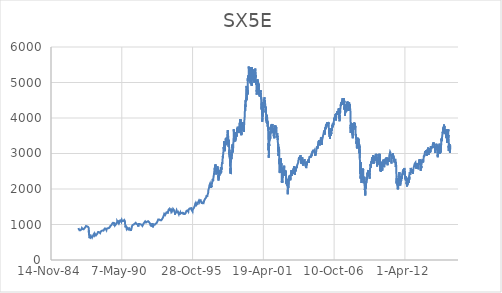
| Category | SX5E |
|---|---|
| 31777.0 | 900.82 |
| 31778.0 | 900.82 |
| 31779.0 | 891.78 |
| 31782.0 | 898.33 |
| 31783.0 | 902.32 |
| 31784.0 | 899.15 |
| 31785.0 | 887.37 |
| 31786.0 | 868.31 |
| 31789.0 | 879.41 |
| 31790.0 | 872.74 |
| 31791.0 | 876.39 |
| 31792.0 | 884.37 |
| 31793.0 | 883.78 |
| 31796.0 | 876.15 |
| 31797.0 | 875.1 |
| 31798.0 | 872.47 |
| 31799.0 | 876.69 |
| 31800.0 | 883.62 |
| 31803.0 | 870.96 |
| 31804.0 | 868.19 |
| 31805.0 | 838.6 |
| 31806.0 | 847.38 |
| 31807.0 | 859.08 |
| 31810.0 | 849.03 |
| 31811.0 | 839.6 |
| 31812.0 | 838.53 |
| 31813.0 | 833.03 |
| 31814.0 | 842.23 |
| 31817.0 | 844.73 |
| 31818.0 | 837.91 |
| 31819.0 | 837.56 |
| 31820.0 | 840.53 |
| 31821.0 | 841.54 |
| 31824.0 | 844.11 |
| 31825.0 | 833.81 |
| 31826.0 | 834.15 |
| 31827.0 | 844.07 |
| 31828.0 | 845.11 |
| 31831.0 | 839.36 |
| 31832.0 | 837.9 |
| 31833.0 | 833.39 |
| 31834.0 | 838.23 |
| 31835.0 | 840.97 |
| 31838.0 | 842.7 |
| 31839.0 | 836.22 |
| 31840.0 | 848.78 |
| 31841.0 | 855.04 |
| 31842.0 | 854.82 |
| 31845.0 | 856.93 |
| 31846.0 | 850.99 |
| 31847.0 | 844.78 |
| 31848.0 | 851.62 |
| 31849.0 | 855 |
| 31852.0 | 855.21 |
| 31853.0 | 848.47 |
| 31854.0 | 854.69 |
| 31855.0 | 842.48 |
| 31856.0 | 848.13 |
| 31859.0 | 860.44 |
| 31860.0 | 866.76 |
| 31861.0 | 868.3 |
| 31862.0 | 874.75 |
| 31863.0 | 882.89 |
| 31866.0 | 877.3 |
| 31867.0 | 869.44 |
| 31868.0 | 883.95 |
| 31869.0 | 888.39 |
| 31870.0 | 888.97 |
| 31873.0 | 900.79 |
| 31874.0 | 896.33 |
| 31875.0 | 895.42 |
| 31876.0 | 895.62 |
| 31877.0 | 884.61 |
| 31880.0 | 875.19 |
| 31881.0 | 881 |
| 31882.0 | 888.71 |
| 31883.0 | 895.48 |
| 31884.0 | 896.06 |
| 31887.0 | 893.33 |
| 31888.0 | 889.55 |
| 31889.0 | 900.5 |
| 31890.0 | 896.53 |
| 31891.0 | 890.62 |
| 31894.0 | 871.69 |
| 31895.0 | 879.07 |
| 31896.0 | 884.37 |
| 31897.0 | 881.46 |
| 31898.0 | 883.32 |
| 31901.0 | 880.31 |
| 31902.0 | 875.43 |
| 31903.0 | 880.91 |
| 31904.0 | 882.84 |
| 31905.0 | 882.7 |
| 31908.0 | 887.34 |
| 31909.0 | 879.78 |
| 31910.0 | 882.77 |
| 31911.0 | 883.11 |
| 31912.0 | 866.11 |
| 31915.0 | 868.85 |
| 31916.0 | 865.65 |
| 31917.0 | 856.08 |
| 31918.0 | 854.02 |
| 31919.0 | 857.63 |
| 31922.0 | 856.95 |
| 31923.0 | 864.83 |
| 31924.0 | 869.49 |
| 31925.0 | 869.29 |
| 31926.0 | 866.41 |
| 31929.0 | 872.52 |
| 31930.0 | 863.11 |
| 31931.0 | 864.57 |
| 31932.0 | 869.42 |
| 31933.0 | 864.75 |
| 31936.0 | 866.08 |
| 31937.0 | 863.17 |
| 31938.0 | 860.8 |
| 31939.0 | 868.26 |
| 31940.0 | 869.28 |
| 31943.0 | 879.82 |
| 31944.0 | 885.41 |
| 31945.0 | 885.93 |
| 31946.0 | 885.19 |
| 31947.0 | 897.16 |
| 31950.0 | 908.73 |
| 31951.0 | 915.58 |
| 31952.0 | 901.6 |
| 31953.0 | 903.66 |
| 31954.0 | 909.42 |
| 31957.0 | 909.76 |
| 31958.0 | 905.3 |
| 31959.0 | 894.32 |
| 31960.0 | 904.15 |
| 31961.0 | 917.81 |
| 31964.0 | 918.19 |
| 31965.0 | 917.15 |
| 31966.0 | 923.2 |
| 31967.0 | 920.76 |
| 31968.0 | 921.82 |
| 31971.0 | 921.73 |
| 31972.0 | 925.93 |
| 31973.0 | 928.92 |
| 31974.0 | 932.15 |
| 31975.0 | 941.03 |
| 31978.0 | 945.38 |
| 31979.0 | 941.54 |
| 31980.0 | 937.13 |
| 31981.0 | 932.12 |
| 31982.0 | 933.19 |
| 31985.0 | 936.9 |
| 31986.0 | 941.84 |
| 31987.0 | 949.38 |
| 31988.0 | 957.8 |
| 31989.0 | 955.83 |
| 31992.0 | 959.68 |
| 31993.0 | 957.2 |
| 31994.0 | 955.55 |
| 31995.0 | 961.22 |
| 31996.0 | 963.12 |
| 31999.0 | 962.46 |
| 32000.0 | 952.68 |
| 32001.0 | 961.8 |
| 32002.0 | 959.8 |
| 32003.0 | 961.79 |
| 32006.0 | 959.11 |
| 32007.0 | 949.25 |
| 32008.0 | 940.09 |
| 32009.0 | 949.22 |
| 32010.0 | 950.03 |
| 32013.0 | 941.89 |
| 32014.0 | 941.91 |
| 32015.0 | 942.2 |
| 32016.0 | 943.3 |
| 32017.0 | 947.55 |
| 32020.0 | 951.06 |
| 32021.0 | 953.63 |
| 32022.0 | 947.24 |
| 32023.0 | 939.54 |
| 32024.0 | 930.39 |
| 32027.0 | 919.53 |
| 32028.0 | 919.47 |
| 32029.0 | 919.76 |
| 32030.0 | 928.08 |
| 32031.0 | 933.42 |
| 32034.0 | 940.81 |
| 32035.0 | 936.45 |
| 32036.0 | 930.91 |
| 32037.0 | 934.09 |
| 32038.0 | 928.5 |
| 32041.0 | 927.1 |
| 32042.0 | 922.49 |
| 32043.0 | 937.85 |
| 32044.0 | 931.48 |
| 32045.0 | 928.34 |
| 32048.0 | 934 |
| 32049.0 | 936.2 |
| 32050.0 | 930.71 |
| 32051.0 | 938.2 |
| 32052.0 | 944.2 |
| 32055.0 | 949.42 |
| 32056.0 | 945.26 |
| 32057.0 | 935.79 |
| 32058.0 | 940.33 |
| 32059.0 | 926.63 |
| 32062.0 | 919.64 |
| 32063.0 | 921.87 |
| 32064.0 | 916.83 |
| 32065.0 | 901.83 |
| 32066.0 | 894.23 |
| 32069.0 | 823.32 |
| 32070.0 | 783.33 |
| 32071.0 | 831.37 |
| 32072.0 | 799.94 |
| 32073.0 | 788.59 |
| 32076.0 | 734.34 |
| 32077.0 | 741.49 |
| 32078.0 | 701.32 |
| 32079.0 | 691.31 |
| 32080.0 | 730.75 |
| 32083.0 | 725.43 |
| 32084.0 | 712.87 |
| 32085.0 | 689.49 |
| 32086.0 | 682.12 |
| 32087.0 | 683.04 |
| 32090.0 | 654.09 |
| 32091.0 | 615.9 |
| 32092.0 | 632.36 |
| 32093.0 | 676.32 |
| 32094.0 | 674.57 |
| 32097.0 | 694.95 |
| 32098.0 | 678.12 |
| 32099.0 | 676.37 |
| 32100.0 | 669.38 |
| 32101.0 | 653.27 |
| 32104.0 | 658.18 |
| 32105.0 | 676.14 |
| 32106.0 | 675.26 |
| 32107.0 | 671.13 |
| 32108.0 | 675.21 |
| 32111.0 | 658.03 |
| 32112.0 | 654.9 |
| 32113.0 | 655.07 |
| 32114.0 | 650.92 |
| 32115.0 | 635.83 |
| 32118.0 | 634.13 |
| 32119.0 | 638.18 |
| 32120.0 | 640.49 |
| 32121.0 | 641.11 |
| 32122.0 | 636.25 |
| 32125.0 | 639.67 |
| 32126.0 | 648.78 |
| 32127.0 | 661.4 |
| 32128.0 | 663.47 |
| 32129.0 | 658.56 |
| 32132.0 | 665.5 |
| 32133.0 | 667.53 |
| 32134.0 | 672.74 |
| 32135.0 | 671.57 |
| 32136.0 | 671.57 |
| 32139.0 | 663.68 |
| 32140.0 | 651.88 |
| 32141.0 | 656.14 |
| 32142.0 | 648.13 |
| 32143.0 | 648.32 |
| 32146.0 | 633.3 |
| 32147.0 | 658.48 |
| 32148.0 | 665.43 |
| 32149.0 | 669.13 |
| 32150.0 | 674.72 |
| 32153.0 | 650.12 |
| 32154.0 | 649.16 |
| 32155.0 | 639.19 |
| 32156.0 | 642.68 |
| 32157.0 | 645.79 |
| 32160.0 | 661.85 |
| 32161.0 | 648.62 |
| 32162.0 | 638.35 |
| 32163.0 | 633.54 |
| 32164.0 | 635.91 |
| 32167.0 | 636.19 |
| 32168.0 | 640.18 |
| 32169.0 | 637.47 |
| 32170.0 | 633.5 |
| 32171.0 | 635.95 |
| 32174.0 | 639.49 |
| 32175.0 | 638.99 |
| 32176.0 | 644.82 |
| 32177.0 | 653.51 |
| 32178.0 | 655.59 |
| 32181.0 | 660.39 |
| 32182.0 | 652.07 |
| 32183.0 | 658.26 |
| 32184.0 | 673 |
| 32185.0 | 678.61 |
| 32188.0 | 686.68 |
| 32189.0 | 688.36 |
| 32190.0 | 696.79 |
| 32191.0 | 697.01 |
| 32192.0 | 695.96 |
| 32195.0 | 702.05 |
| 32196.0 | 704.53 |
| 32197.0 | 707.13 |
| 32198.0 | 712.17 |
| 32199.0 | 705.06 |
| 32202.0 | 708.88 |
| 32203.0 | 715.83 |
| 32204.0 | 717.62 |
| 32205.0 | 716.51 |
| 32206.0 | 711.09 |
| 32209.0 | 700.57 |
| 32210.0 | 709.99 |
| 32211.0 | 713.48 |
| 32212.0 | 719.48 |
| 32213.0 | 713.28 |
| 32216.0 | 714.18 |
| 32217.0 | 714.82 |
| 32218.0 | 721.6 |
| 32219.0 | 706.85 |
| 32220.0 | 743.45 |
| 32223.0 | 740.41 |
| 32224.0 | 729.93 |
| 32225.0 | 731.4 |
| 32226.0 | 729.04 |
| 32227.0 | 719.87 |
| 32230.0 | 700.5 |
| 32231.0 | 706.16 |
| 32232.0 | 706.39 |
| 32233.0 | 701.56 |
| 32234.0 | 701.37 |
| 32237.0 | 699.45 |
| 32238.0 | 696.84 |
| 32239.0 | 707.35 |
| 32240.0 | 712.88 |
| 32241.0 | 712.36 |
| 32244.0 | 723.06 |
| 32245.0 | 728.31 |
| 32246.0 | 731.26 |
| 32247.0 | 725.77 |
| 32248.0 | 712.42 |
| 32251.0 | 711.6 |
| 32252.0 | 716.63 |
| 32253.0 | 711.86 |
| 32254.0 | 708.23 |
| 32255.0 | 711.58 |
| 32258.0 | 714.45 |
| 32259.0 | 716.27 |
| 32260.0 | 714.72 |
| 32261.0 | 717.48 |
| 32262.0 | 710.55 |
| 32265.0 | 709.88 |
| 32266.0 | 705.58 |
| 32267.0 | 710.63 |
| 32268.0 | 708.49 |
| 32269.0 | 707.04 |
| 32272.0 | 694.64 |
| 32273.0 | 691.69 |
| 32274.0 | 682.6 |
| 32275.0 | 680.1 |
| 32276.0 | 678.99 |
| 32279.0 | 693.32 |
| 32280.0 | 699.73 |
| 32281.0 | 697.68 |
| 32282.0 | 686.38 |
| 32283.0 | 691 |
| 32286.0 | 688.63 |
| 32287.0 | 689.83 |
| 32288.0 | 698.42 |
| 32289.0 | 697.56 |
| 32290.0 | 696.04 |
| 32293.0 | 702.31 |
| 32294.0 | 711.12 |
| 32295.0 | 724.44 |
| 32296.0 | 742.44 |
| 32297.0 | 732.45 |
| 32300.0 | 736.99 |
| 32301.0 | 733.47 |
| 32302.0 | 736.43 |
| 32303.0 | 749.58 |
| 32304.0 | 749.26 |
| 32307.0 | 746.51 |
| 32308.0 | 750.26 |
| 32309.0 | 752.49 |
| 32310.0 | 745.17 |
| 32311.0 | 747.38 |
| 32314.0 | 745.56 |
| 32315.0 | 748.29 |
| 32316.0 | 754.23 |
| 32317.0 | 759.34 |
| 32318.0 | 763.67 |
| 32321.0 | 762.99 |
| 32322.0 | 756.75 |
| 32323.0 | 760.82 |
| 32324.0 | 760.54 |
| 32325.0 | 769.63 |
| 32328.0 | 771.49 |
| 32329.0 | 775.35 |
| 32330.0 | 787.97 |
| 32331.0 | 783.36 |
| 32332.0 | 783.07 |
| 32335.0 | 780.72 |
| 32336.0 | 771.99 |
| 32337.0 | 766.99 |
| 32338.0 | 770.82 |
| 32339.0 | 774.77 |
| 32342.0 | 772.11 |
| 32343.0 | 767.36 |
| 32344.0 | 771.81 |
| 32345.0 | 772.11 |
| 32346.0 | 765.79 |
| 32349.0 | 765.03 |
| 32350.0 | 772.58 |
| 32351.0 | 775.46 |
| 32352.0 | 771.12 |
| 32353.0 | 780.03 |
| 32356.0 | 786.65 |
| 32357.0 | 786.91 |
| 32358.0 | 785.35 |
| 32359.0 | 784.49 |
| 32360.0 | 790.72 |
| 32363.0 | 786.05 |
| 32364.0 | 788.65 |
| 32365.0 | 774.91 |
| 32366.0 | 766.11 |
| 32367.0 | 773.27 |
| 32370.0 | 770.05 |
| 32371.0 | 766.83 |
| 32372.0 | 775.41 |
| 32373.0 | 777.71 |
| 32374.0 | 774.53 |
| 32377.0 | 773.6 |
| 32378.0 | 767.15 |
| 32379.0 | 769.97 |
| 32380.0 | 762.04 |
| 32381.0 | 760.86 |
| 32384.0 | 757.41 |
| 32385.0 | 759.76 |
| 32386.0 | 761.63 |
| 32387.0 | 757.92 |
| 32388.0 | 755.5 |
| 32391.0 | 762.97 |
| 32392.0 | 764.79 |
| 32393.0 | 767.95 |
| 32394.0 | 773.44 |
| 32395.0 | 768.47 |
| 32398.0 | 776.16 |
| 32399.0 | 779.82 |
| 32400.0 | 789.7 |
| 32401.0 | 794.24 |
| 32402.0 | 793.88 |
| 32405.0 | 798.4 |
| 32406.0 | 797.96 |
| 32407.0 | 803.58 |
| 32408.0 | 805.49 |
| 32409.0 | 802.23 |
| 32412.0 | 805.86 |
| 32413.0 | 802.73 |
| 32414.0 | 801.46 |
| 32415.0 | 807.99 |
| 32416.0 | 809.03 |
| 32419.0 | 809.23 |
| 32420.0 | 812.2 |
| 32421.0 | 814.6 |
| 32422.0 | 816.7 |
| 32423.0 | 818.72 |
| 32426.0 | 823.99 |
| 32427.0 | 817.84 |
| 32428.0 | 812.66 |
| 32429.0 | 819.84 |
| 32430.0 | 823.39 |
| 32433.0 | 825.53 |
| 32434.0 | 833.38 |
| 32435.0 | 837.6 |
| 32436.0 | 832.5 |
| 32437.0 | 832.21 |
| 32440.0 | 831.32 |
| 32441.0 | 832.41 |
| 32442.0 | 846.5 |
| 32443.0 | 836.33 |
| 32444.0 | 841.45 |
| 32447.0 | 837.84 |
| 32448.0 | 842.83 |
| 32449.0 | 838.65 |
| 32450.0 | 837.14 |
| 32451.0 | 838.31 |
| 32454.0 | 830.56 |
| 32455.0 | 836.86 |
| 32456.0 | 833.03 |
| 32457.0 | 830.49 |
| 32458.0 | 826.42 |
| 32461.0 | 821.69 |
| 32462.0 | 819.76 |
| 32463.0 | 822.09 |
| 32464.0 | 819.3 |
| 32465.0 | 825.01 |
| 32468.0 | 822.15 |
| 32469.0 | 822.15 |
| 32470.0 | 828.6 |
| 32471.0 | 829.94 |
| 32472.0 | 827.28 |
| 32475.0 | 822.2 |
| 32476.0 | 823.08 |
| 32477.0 | 828.32 |
| 32478.0 | 828.11 |
| 32479.0 | 825.56 |
| 32482.0 | 823.66 |
| 32483.0 | 827.01 |
| 32484.0 | 834.37 |
| 32485.0 | 833.25 |
| 32486.0 | 843.45 |
| 32489.0 | 836.02 |
| 32490.0 | 835.75 |
| 32491.0 | 832.87 |
| 32492.0 | 832.27 |
| 32493.0 | 839.18 |
| 32496.0 | 846.69 |
| 32497.0 | 854.39 |
| 32498.0 | 853.69 |
| 32499.0 | 843.38 |
| 32500.0 | 856.46 |
| 32503.0 | 856.06 |
| 32504.0 | 861.08 |
| 32505.0 | 859.15 |
| 32506.0 | 861.22 |
| 32507.0 | 861.36 |
| 32510.0 | 866.04 |
| 32511.0 | 872.11 |
| 32512.0 | 876.29 |
| 32513.0 | 883.29 |
| 32514.0 | 884.13 |
| 32517.0 | 886.05 |
| 32518.0 | 881.16 |
| 32519.0 | 881.55 |
| 32520.0 | 884.53 |
| 32521.0 | 885.25 |
| 32524.0 | 885.24 |
| 32525.0 | 881.7 |
| 32526.0 | 880.4 |
| 32527.0 | 888.68 |
| 32528.0 | 885.46 |
| 32531.0 | 880.02 |
| 32532.0 | 885.82 |
| 32533.0 | 892.57 |
| 32534.0 | 887.82 |
| 32535.0 | 891.09 |
| 32538.0 | 887.65 |
| 32539.0 | 880.79 |
| 32540.0 | 875.47 |
| 32541.0 | 878.08 |
| 32542.0 | 884.09 |
| 32545.0 | 885.49 |
| 32546.0 | 883.82 |
| 32547.0 | 891.81 |
| 32548.0 | 889.28 |
| 32549.0 | 888.1 |
| 32552.0 | 876.81 |
| 32553.0 | 878.7 |
| 32554.0 | 870.83 |
| 32555.0 | 872.89 |
| 32556.0 | 869.54 |
| 32559.0 | 876.73 |
| 32560.0 | 874.7 |
| 32561.0 | 867.41 |
| 32562.0 | 856.7 |
| 32563.0 | 864.05 |
| 32566.0 | 845.09 |
| 32567.0 | 852.86 |
| 32568.0 | 859.83 |
| 32569.0 | 860.68 |
| 32570.0 | 871.1 |
| 32573.0 | 879.28 |
| 32574.0 | 878.31 |
| 32575.0 | 872.83 |
| 32576.0 | 873.66 |
| 32577.0 | 870.96 |
| 32580.0 | 872.52 |
| 32581.0 | 876.31 |
| 32582.0 | 881.84 |
| 32583.0 | 882.9 |
| 32584.0 | 879.88 |
| 32587.0 | 853.38 |
| 32588.0 | 874.93 |
| 32589.0 | 874.77 |
| 32590.0 | 875.44 |
| 32591.0 | 875.9 |
| 32594.0 | 873.69 |
| 32595.0 | 875.62 |
| 32596.0 | 880.18 |
| 32597.0 | 882 |
| 32598.0 | 883.82 |
| 32601.0 | 891.11 |
| 32602.0 | 892.13 |
| 32603.0 | 893.29 |
| 32604.0 | 889.88 |
| 32605.0 | 891.2 |
| 32608.0 | 895.58 |
| 32609.0 | 899.74 |
| 32610.0 | 902.61 |
| 32611.0 | 902.29 |
| 32612.0 | 904.91 |
| 32615.0 | 909.4 |
| 32616.0 | 911.73 |
| 32617.0 | 911.97 |
| 32618.0 | 908.91 |
| 32619.0 | 908.9 |
| 32622.0 | 909.26 |
| 32623.0 | 904.67 |
| 32624.0 | 901.26 |
| 32625.0 | 901.96 |
| 32626.0 | 901.71 |
| 32629.0 | 900.64 |
| 32630.0 | 899.12 |
| 32631.0 | 897.81 |
| 32632.0 | 896.8 |
| 32633.0 | 904.73 |
| 32636.0 | 900.19 |
| 32637.0 | 898.8 |
| 32638.0 | 896.6 |
| 32639.0 | 893.82 |
| 32640.0 | 892.69 |
| 32643.0 | 891.69 |
| 32644.0 | 891.42 |
| 32645.0 | 890.49 |
| 32646.0 | 896.03 |
| 32647.0 | 898.16 |
| 32650.0 | 902.16 |
| 32651.0 | 904.47 |
| 32652.0 | 905.75 |
| 32653.0 | 913.38 |
| 32654.0 | 914.44 |
| 32657.0 | 920.33 |
| 32658.0 | 923.35 |
| 32659.0 | 923.42 |
| 32660.0 | 924.65 |
| 32661.0 | 926.05 |
| 32664.0 | 930.43 |
| 32665.0 | 929.08 |
| 32666.0 | 934.15 |
| 32667.0 | 939.58 |
| 32668.0 | 940.86 |
| 32671.0 | 944.7 |
| 32672.0 | 944.87 |
| 32673.0 | 947.36 |
| 32674.0 | 942.49 |
| 32675.0 | 942.76 |
| 32678.0 | 948.98 |
| 32679.0 | 958.23 |
| 32680.0 | 956.75 |
| 32681.0 | 958.9 |
| 32682.0 | 958.27 |
| 32685.0 | 962.7 |
| 32686.0 | 959.94 |
| 32687.0 | 966.26 |
| 32688.0 | 963.4 |
| 32689.0 | 953.51 |
| 32692.0 | 958.48 |
| 32693.0 | 963.44 |
| 32694.0 | 955.98 |
| 32695.0 | 956.83 |
| 32696.0 | 961.77 |
| 32699.0 | 965.66 |
| 32700.0 | 971.49 |
| 32701.0 | 971.05 |
| 32702.0 | 977.72 |
| 32703.0 | 981.2 |
| 32706.0 | 979.47 |
| 32707.0 | 981.3 |
| 32708.0 | 985.74 |
| 32709.0 | 991.39 |
| 32710.0 | 993.41 |
| 32713.0 | 983.6 |
| 32714.0 | 988.98 |
| 32715.0 | 994.46 |
| 32716.0 | 997.27 |
| 32717.0 | 996.93 |
| 32720.0 | 997.91 |
| 32721.0 | 1006.38 |
| 32722.0 | 1008.28 |
| 32723.0 | 1004.65 |
| 32724.0 | 1016.58 |
| 32727.0 | 1018.24 |
| 32728.0 | 1020.41 |
| 32729.0 | 1022.62 |
| 32730.0 | 1018.51 |
| 32731.0 | 1022.34 |
| 32734.0 | 1019.54 |
| 32735.0 | 1012.02 |
| 32736.0 | 1018.81 |
| 32737.0 | 1020.37 |
| 32738.0 | 1017.81 |
| 32741.0 | 1024.69 |
| 32742.0 | 1021.3 |
| 32743.0 | 1020.27 |
| 32744.0 | 1026.17 |
| 32745.0 | 1036.91 |
| 32748.0 | 1034.95 |
| 32749.0 | 1031.44 |
| 32750.0 | 1034.36 |
| 32751.0 | 1038.1 |
| 32752.0 | 1040.88 |
| 32755.0 | 1048.98 |
| 32756.0 | 1056.54 |
| 32757.0 | 1048.36 |
| 32758.0 | 1055.11 |
| 32759.0 | 1058.95 |
| 32762.0 | 1054.81 |
| 32763.0 | 1052.11 |
| 32764.0 | 1049.45 |
| 32765.0 | 1048.53 |
| 32766.0 | 1047.16 |
| 32769.0 | 1050.93 |
| 32770.0 | 1047.17 |
| 32771.0 | 1045.66 |
| 32772.0 | 1045.93 |
| 32773.0 | 1051.84 |
| 32776.0 | 1050.59 |
| 32777.0 | 1045.46 |
| 32778.0 | 1042.05 |
| 32779.0 | 1041.53 |
| 32780.0 | 1032.57 |
| 32783.0 | 1027.48 |
| 32784.0 | 1039.75 |
| 32785.0 | 1042.4 |
| 32786.0 | 1041.49 |
| 32787.0 | 1047.81 |
| 32790.0 | 1055.47 |
| 32791.0 | 1054.76 |
| 32792.0 | 1043.02 |
| 32793.0 | 1042.72 |
| 32794.0 | 1035.84 |
| 32797.0 | 960.81 |
| 32798.0 | 981.08 |
| 32799.0 | 983.38 |
| 32800.0 | 1001.41 |
| 32801.0 | 999.85 |
| 32804.0 | 1001.27 |
| 32805.0 | 983.84 |
| 32806.0 | 973.82 |
| 32807.0 | 971.67 |
| 32808.0 | 959.03 |
| 32811.0 | 965.83 |
| 32812.0 | 970.43 |
| 32813.0 | 972.43 |
| 32814.0 | 969.91 |
| 32815.0 | 961.72 |
| 32818.0 | 958.61 |
| 32819.0 | 947.37 |
| 32820.0 | 954.83 |
| 32821.0 | 960.36 |
| 32822.0 | 970.55 |
| 32825.0 | 982.49 |
| 32826.0 | 977.94 |
| 32827.0 | 973.5 |
| 32828.0 | 985.33 |
| 32829.0 | 985.81 |
| 32832.0 | 989.62 |
| 32833.0 | 984.76 |
| 32834.0 | 990.51 |
| 32835.0 | 996.73 |
| 32836.0 | 1005.91 |
| 32839.0 | 1010 |
| 32840.0 | 1009.79 |
| 32841.0 | 1013.96 |
| 32842.0 | 1023.52 |
| 32843.0 | 1034.12 |
| 32846.0 | 1045.01 |
| 32847.0 | 1040.5 |
| 32848.0 | 1048.9 |
| 32849.0 | 1051.22 |
| 32850.0 | 1050.31 |
| 32853.0 | 1048.34 |
| 32854.0 | 1048.03 |
| 32855.0 | 1046.28 |
| 32856.0 | 1043.37 |
| 32857.0 | 1045.44 |
| 32860.0 | 1042.84 |
| 32861.0 | 1038.3 |
| 32862.0 | 1050.06 |
| 32863.0 | 1057.82 |
| 32864.0 | 1060 |
| 32867.0 | 1060 |
| 32868.0 | 1063.68 |
| 32869.0 | 1082.78 |
| 32870.0 | 1095.22 |
| 32871.0 | 1098.49 |
| 32874.0 | 1098.49 |
| 32875.0 | 1101.34 |
| 32876.0 | 1112.82 |
| 32877.0 | 1113.02 |
| 32878.0 | 1099.52 |
| 32881.0 | 1104.62 |
| 32882.0 | 1108.79 |
| 32883.0 | 1099.88 |
| 32884.0 | 1111.34 |
| 32885.0 | 1100.32 |
| 32888.0 | 1094.09 |
| 32889.0 | 1076.85 |
| 32890.0 | 1085.63 |
| 32891.0 | 1071.44 |
| 32892.0 | 1069.32 |
| 32895.0 | 1070.13 |
| 32896.0 | 1072 |
| 32897.0 | 1048.74 |
| 32898.0 | 1061.73 |
| 32899.0 | 1061.64 |
| 32902.0 | 1063.84 |
| 32903.0 | 1067.73 |
| 32904.0 | 1069.92 |
| 32905.0 | 1081.45 |
| 32906.0 | 1099.38 |
| 32909.0 | 1111.72 |
| 32910.0 | 1108.79 |
| 32911.0 | 1093.94 |
| 32912.0 | 1102.05 |
| 32913.0 | 1091.27 |
| 32916.0 | 1075.59 |
| 32917.0 | 1067 |
| 32918.0 | 1067.95 |
| 32919.0 | 1072.31 |
| 32920.0 | 1088.18 |
| 32923.0 | 1073.87 |
| 32924.0 | 1053.49 |
| 32925.0 | 1046.7 |
| 32926.0 | 1053.05 |
| 32927.0 | 1038.72 |
| 32930.0 | 1031.27 |
| 32931.0 | 1045.13 |
| 32932.0 | 1048.91 |
| 32933.0 | 1039.54 |
| 32934.0 | 1057.33 |
| 32937.0 | 1064.82 |
| 32938.0 | 1062.78 |
| 32939.0 | 1074.51 |
| 32940.0 | 1082.32 |
| 32941.0 | 1087.35 |
| 32944.0 | 1082.45 |
| 32945.0 | 1088.53 |
| 32946.0 | 1092 |
| 32947.0 | 1101.47 |
| 32948.0 | 1105.71 |
| 32951.0 | 1108.72 |
| 32952.0 | 1103.16 |
| 32953.0 | 1114.3 |
| 32954.0 | 1104.94 |
| 32955.0 | 1107.65 |
| 32958.0 | 1114.94 |
| 32959.0 | 1108.58 |
| 32960.0 | 1108.04 |
| 32961.0 | 1113.82 |
| 32962.0 | 1115.39 |
| 32965.0 | 1102.63 |
| 32966.0 | 1117.39 |
| 32967.0 | 1117.46 |
| 32968.0 | 1120.48 |
| 32969.0 | 1126.63 |
| 32972.0 | 1120.33 |
| 32973.0 | 1119.32 |
| 32974.0 | 1122.83 |
| 32975.0 | 1127.94 |
| 32976.0 | 1127.36 |
| 32979.0 | 1130.41 |
| 32980.0 | 1133.43 |
| 32981.0 | 1124.96 |
| 32982.0 | 1120.75 |
| 32983.0 | 1127.18 |
| 32986.0 | 1108.59 |
| 32987.0 | 1106.22 |
| 32988.0 | 1104.51 |
| 32989.0 | 1095.66 |
| 32990.0 | 1091.63 |
| 32993.0 | 1087.94 |
| 32994.0 | 1088.04 |
| 32995.0 | 1098.06 |
| 32996.0 | 1111.77 |
| 32997.0 | 1118.26 |
| 33000.0 | 1128.43 |
| 33001.0 | 1123.19 |
| 33002.0 | 1119.61 |
| 33003.0 | 1116 |
| 33004.0 | 1110.37 |
| 33007.0 | 1111.93 |
| 33008.0 | 1109.35 |
| 33009.0 | 1107.71 |
| 33010.0 | 1113.09 |
| 33011.0 | 1109.49 |
| 33014.0 | 1098.29 |
| 33015.0 | 1106.66 |
| 33016.0 | 1111.21 |
| 33017.0 | 1110.43 |
| 33018.0 | 1102.43 |
| 33021.0 | 1099.45 |
| 33022.0 | 1111.82 |
| 33023.0 | 1117.22 |
| 33024.0 | 1116.83 |
| 33025.0 | 1116.17 |
| 33028.0 | 1120.1 |
| 33029.0 | 1123.85 |
| 33030.0 | 1108.59 |
| 33031.0 | 1107.05 |
| 33032.0 | 1099.46 |
| 33035.0 | 1094.01 |
| 33036.0 | 1092.18 |
| 33037.0 | 1094.42 |
| 33038.0 | 1097.85 |
| 33039.0 | 1089.21 |
| 33042.0 | 1084.24 |
| 33043.0 | 1098.5 |
| 33044.0 | 1102.64 |
| 33045.0 | 1105.72 |
| 33046.0 | 1112.61 |
| 33049.0 | 1118.94 |
| 33050.0 | 1123.46 |
| 33051.0 | 1122.16 |
| 33052.0 | 1122.46 |
| 33053.0 | 1120.33 |
| 33056.0 | 1124.08 |
| 33057.0 | 1121.5 |
| 33058.0 | 1120.64 |
| 33059.0 | 1113.32 |
| 33060.0 | 1114.14 |
| 33063.0 | 1110.41 |
| 33064.0 | 1100.56 |
| 33065.0 | 1109.54 |
| 33066.0 | 1118.71 |
| 33067.0 | 1121.3 |
| 33070.0 | 1127.62 |
| 33071.0 | 1133.76 |
| 33072.0 | 1133.35 |
| 33073.0 | 1134.74 |
| 33074.0 | 1136.18 |
| 33077.0 | 1120.62 |
| 33078.0 | 1120.9 |
| 33079.0 | 1122.36 |
| 33080.0 | 1120.59 |
| 33081.0 | 1112.67 |
| 33084.0 | 1107.72 |
| 33085.0 | 1116.48 |
| 33086.0 | 1108.96 |
| 33087.0 | 1097.11 |
| 33088.0 | 1073.07 |
| 33091.0 | 1021.5 |
| 33092.0 | 1038.87 |
| 33093.0 | 1016.7 |
| 33094.0 | 1023.96 |
| 33095.0 | 1021.27 |
| 33098.0 | 996.97 |
| 33099.0 | 1003.6 |
| 33100.0 | 1001.34 |
| 33101.0 | 1007.38 |
| 33102.0 | 976.71 |
| 33105.0 | 952.64 |
| 33106.0 | 920.64 |
| 33107.0 | 930.22 |
| 33108.0 | 903.54 |
| 33109.0 | 919.56 |
| 33112.0 | 964.12 |
| 33113.0 | 955.84 |
| 33114.0 | 962.32 |
| 33115.0 | 969.57 |
| 33116.0 | 962.15 |
| 33119.0 | 958.14 |
| 33120.0 | 940.34 |
| 33121.0 | 940.26 |
| 33122.0 | 935.87 |
| 33123.0 | 937.84 |
| 33126.0 | 956.25 |
| 33127.0 | 947.76 |
| 33128.0 | 954.82 |
| 33129.0 | 952.68 |
| 33130.0 | 934.09 |
| 33133.0 | 924.31 |
| 33134.0 | 907.31 |
| 33135.0 | 904.25 |
| 33136.0 | 890.88 |
| 33137.0 | 886.52 |
| 33140.0 | 871.4 |
| 33141.0 | 850.99 |
| 33142.0 | 860.78 |
| 33143.0 | 860.35 |
| 33144.0 | 845.96 |
| 33147.0 | 875.4 |
| 33148.0 | 896.69 |
| 33149.0 | 891.71 |
| 33150.0 | 881.17 |
| 33151.0 | 866.85 |
| 33154.0 | 893.92 |
| 33155.0 | 877.9 |
| 33156.0 | 866.26 |
| 33157.0 | 869.63 |
| 33158.0 | 884.94 |
| 33161.0 | 891.48 |
| 33162.0 | 889.95 |
| 33163.0 | 886.78 |
| 33164.0 | 901.35 |
| 33165.0 | 910.29 |
| 33168.0 | 904.12 |
| 33169.0 | 925.33 |
| 33170.0 | 924.52 |
| 33171.0 | 916.65 |
| 33172.0 | 898.73 |
| 33175.0 | 896.33 |
| 33176.0 | 886.68 |
| 33177.0 | 889.57 |
| 33178.0 | 884.62 |
| 33179.0 | 881.74 |
| 33182.0 | 877.88 |
| 33183.0 | 876.74 |
| 33184.0 | 864.83 |
| 33185.0 | 857.62 |
| 33186.0 | 861.32 |
| 33189.0 | 872.25 |
| 33190.0 | 875.77 |
| 33191.0 | 870.61 |
| 33192.0 | 871.07 |
| 33193.0 | 872 |
| 33196.0 | 882.81 |
| 33197.0 | 885.13 |
| 33198.0 | 882.83 |
| 33199.0 | 889.89 |
| 33200.0 | 888.42 |
| 33203.0 | 872.01 |
| 33204.0 | 863.28 |
| 33205.0 | 864.11 |
| 33206.0 | 869.21 |
| 33207.0 | 872.81 |
| 33210.0 | 891.1 |
| 33211.0 | 884.12 |
| 33212.0 | 893.1 |
| 33213.0 | 906.2 |
| 33214.0 | 911.41 |
| 33217.0 | 908.44 |
| 33218.0 | 904.26 |
| 33219.0 | 908.03 |
| 33220.0 | 911.65 |
| 33221.0 | 909.65 |
| 33224.0 | 892.49 |
| 33225.0 | 893.1 |
| 33226.0 | 888.7 |
| 33227.0 | 870.71 |
| 33228.0 | 872.92 |
| 33231.0 | 867.05 |
| 33232.0 | 871.47 |
| 33233.0 | 866.14 |
| 33234.0 | 866.16 |
| 33235.0 | 861.57 |
| 33238.0 | 858.72 |
| 33239.0 | 858.72 |
| 33240.0 | 851.35 |
| 33241.0 | 854.53 |
| 33242.0 | 864.27 |
| 33245.0 | 847.19 |
| 33246.0 | 842.12 |
| 33247.0 | 855.99 |
| 33248.0 | 846.31 |
| 33249.0 | 843.24 |
| 33252.0 | 818.5 |
| 33253.0 | 820.44 |
| 33254.0 | 821.34 |
| 33255.0 | 869.45 |
| 33256.0 | 862.65 |
| 33259.0 | 854.7 |
| 33260.0 | 848.71 |
| 33261.0 | 839.95 |
| 33262.0 | 852.09 |
| 33263.0 | 857.71 |
| 33266.0 | 858.5 |
| 33267.0 | 853.54 |
| 33268.0 | 867.21 |
| 33269.0 | 871.77 |
| 33270.0 | 871.68 |
| 33273.0 | 877.61 |
| 33274.0 | 883.56 |
| 33275.0 | 880.79 |
| 33276.0 | 889.81 |
| 33277.0 | 899.59 |
| 33280.0 | 914.85 |
| 33281.0 | 908.94 |
| 33282.0 | 916.72 |
| 33283.0 | 922.72 |
| 33284.0 | 934.79 |
| 33287.0 | 950.97 |
| 33288.0 | 957.05 |
| 33289.0 | 946.46 |
| 33290.0 | 948.9 |
| 33291.0 | 959.84 |
| 33294.0 | 971.27 |
| 33295.0 | 953.01 |
| 33296.0 | 956.15 |
| 33297.0 | 959.23 |
| 33298.0 | 948.8 |
| 33301.0 | 956.15 |
| 33302.0 | 963.97 |
| 33303.0 | 982.18 |
| 33304.0 | 983.63 |
| 33305.0 | 990.7 |
| 33308.0 | 979.89 |
| 33309.0 | 980.11 |
| 33310.0 | 969.17 |
| 33311.0 | 986.08 |
| 33312.0 | 982.29 |
| 33315.0 | 978.94 |
| 33316.0 | 972.89 |
| 33317.0 | 964.73 |
| 33318.0 | 970.5 |
| 33319.0 | 966.81 |
| 33322.0 | 969.86 |
| 33323.0 | 966.84 |
| 33324.0 | 971.07 |
| 33325.0 | 981.91 |
| 33326.0 | 982.08 |
| 33329.0 | 988.77 |
| 33330.0 | 985.68 |
| 33331.0 | 998.76 |
| 33332.0 | 995.97 |
| 33333.0 | 1002.3 |
| 33336.0 | 995.14 |
| 33337.0 | 999.3 |
| 33338.0 | 988.82 |
| 33339.0 | 995.21 |
| 33340.0 | 1001.18 |
| 33343.0 | 1006.18 |
| 33344.0 | 1001.9 |
| 33345.0 | 1012.74 |
| 33346.0 | 1012.91 |
| 33347.0 | 1007.43 |
| 33350.0 | 995.36 |
| 33351.0 | 1004.69 |
| 33352.0 | 1006.87 |
| 33353.0 | 1013.64 |
| 33354.0 | 998.46 |
| 33357.0 | 1006.89 |
| 33358.0 | 1002.08 |
| 33359.0 | 1004.74 |
| 33360.0 | 1017.29 |
| 33361.0 | 1018.24 |
| 33364.0 | 1019.47 |
| 33365.0 | 1019.77 |
| 33366.0 | 1013.48 |
| 33367.0 | 1015.16 |
| 33368.0 | 1024.15 |
| 33371.0 | 1015.48 |
| 33372.0 | 1012.67 |
| 33373.0 | 1004.96 |
| 33374.0 | 1008.49 |
| 33375.0 | 1004.86 |
| 33378.0 | 1006.74 |
| 33379.0 | 1015.4 |
| 33380.0 | 1021.14 |
| 33381.0 | 1020.26 |
| 33382.0 | 1021.3 |
| 33385.0 | 1023.97 |
| 33386.0 | 1027.34 |
| 33387.0 | 1031.32 |
| 33388.0 | 1035.19 |
| 33389.0 | 1045.52 |
| 33392.0 | 1048.03 |
| 33393.0 | 1044.26 |
| 33394.0 | 1051.3 |
| 33395.0 | 1045.72 |
| 33396.0 | 1043.22 |
| 33399.0 | 1042.47 |
| 33400.0 | 1050 |
| 33401.0 | 1041.42 |
| 33402.0 | 1039.11 |
| 33403.0 | 1047.25 |
| 33406.0 | 1041.32 |
| 33407.0 | 1037.89 |
| 33408.0 | 1029.36 |
| 33409.0 | 1024.79 |
| 33410.0 | 1033.43 |
| 33413.0 | 1020.52 |
| 33414.0 | 1021.47 |
| 33415.0 | 1014.97 |
| 33416.0 | 1014.9 |
| 33417.0 | 1003.15 |
| 33420.0 | 1004.3 |
| 33421.0 | 1001.04 |
| 33422.0 | 993.27 |
| 33423.0 | 991.43 |
| 33424.0 | 999.65 |
| 33427.0 | 987.06 |
| 33428.0 | 996.24 |
| 33429.0 | 1006.27 |
| 33430.0 | 999.48 |
| 33431.0 | 998.13 |
| 33434.0 | 1002.16 |
| 33435.0 | 1002.52 |
| 33436.0 | 995.75 |
| 33437.0 | 996.4 |
| 33438.0 | 1002 |
| 33441.0 | 1003.19 |
| 33442.0 | 1007.02 |
| 33443.0 | 1004.49 |
| 33444.0 | 1002.65 |
| 33445.0 | 996.86 |
| 33448.0 | 996.31 |
| 33449.0 | 1000.15 |
| 33450.0 | 1000.94 |
| 33451.0 | 1003.75 |
| 33452.0 | 1001.23 |
| 33455.0 | 1002.24 |
| 33456.0 | 995.93 |
| 33457.0 | 1006.09 |
| 33458.0 | 1004.69 |
| 33459.0 | 1003.49 |
| 33462.0 | 1000.7 |
| 33463.0 | 1008.87 |
| 33464.0 | 1012.18 |
| 33465.0 | 1012.9 |
| 33466.0 | 1013.94 |
| 33469.0 | 942.04 |
| 33470.0 | 962.69 |
| 33471.0 | 982.63 |
| 33472.0 | 1003.52 |
| 33473.0 | 1007.05 |
| 33476.0 | 1014.68 |
| 33477.0 | 1013.34 |
| 33478.0 | 1011.53 |
| 33479.0 | 1014.31 |
| 33480.0 | 1016.62 |
| 33483.0 | 1016.78 |
| 33484.0 | 1019.44 |
| 33485.0 | 1018.78 |
| 33486.0 | 1019.67 |
| 33487.0 | 1017.57 |
| 33490.0 | 1011.74 |
| 33491.0 | 1006.09 |
| 33492.0 | 1003.27 |
| 33493.0 | 1006.92 |
| 33494.0 | 1008.85 |
| 33497.0 | 1009.76 |
| 33498.0 | 1009.64 |
| 33499.0 | 1012.61 |
| 33500.0 | 1011.56 |
| 33501.0 | 1012.54 |
| 33504.0 | 1009.21 |
| 33505.0 | 1014.21 |
| 33506.0 | 1010.29 |
| 33507.0 | 1009.44 |
| 33508.0 | 1005.94 |
| 33511.0 | 1007 |
| 33512.0 | 1008.05 |
| 33513.0 | 1005.32 |
| 33514.0 | 1002.47 |
| 33515.0 | 997.52 |
| 33518.0 | 994.86 |
| 33519.0 | 994.24 |
| 33520.0 | 988.02 |
| 33521.0 | 990.9 |
| 33522.0 | 989.88 |
| 33525.0 | 990.58 |
| 33526.0 | 1000.39 |
| 33527.0 | 999.18 |
| 33528.0 | 998.53 |
| 33529.0 | 999.69 |
| 33532.0 | 999.81 |
| 33533.0 | 1003.45 |
| 33534.0 | 1002.95 |
| 33535.0 | 998 |
| 33536.0 | 992.65 |
| 33539.0 | 1002.02 |
| 33540.0 | 1002.97 |
| 33541.0 | 1000.52 |
| 33542.0 | 1003.13 |
| 33543.0 | 998.85 |
| 33546.0 | 994.85 |
| 33547.0 | 998.85 |
| 33548.0 | 994.26 |
| 33549.0 | 998.51 |
| 33550.0 | 1009.88 |
| 33553.0 | 1009.75 |
| 33554.0 | 1014.97 |
| 33555.0 | 1016.98 |
| 33556.0 | 1020.51 |
| 33557.0 | 1021.82 |
| 33560.0 | 1002.85 |
| 33561.0 | 992.68 |
| 33562.0 | 994.3 |
| 33563.0 | 992.55 |
| 33564.0 | 993.93 |
| 33567.0 | 988.24 |
| 33568.0 | 994.34 |
| 33569.0 | 991.02 |
| 33570.0 | 990.57 |
| 33571.0 | 985.85 |
| 33574.0 | 974.07 |
| 33575.0 | 981.09 |
| 33576.0 | 980.16 |
| 33577.0 | 979.66 |
| 33578.0 | 973.94 |
| 33581.0 | 969.4 |
| 33582.0 | 960.99 |
| 33583.0 | 962.77 |
| 33584.0 | 969.05 |
| 33585.0 | 977.91 |
| 33588.0 | 978.27 |
| 33589.0 | 980.8 |
| 33590.0 | 986.11 |
| 33591.0 | 976.26 |
| 33592.0 | 963.56 |
| 33595.0 | 965.28 |
| 33596.0 | 976.29 |
| 33597.0 | 976.29 |
| 33598.0 | 977.88 |
| 33599.0 | 985.78 |
| 33602.0 | 996.85 |
| 33603.0 | 1000 |
| 33605.0 | 1004.03 |
| 33606.0 | 1001.2 |
| 33609.0 | 1014.3 |
| 33610.0 | 1012.6 |
| 33611.0 | 1004.03 |
| 33612.0 | 1004.41 |
| 33613.0 | 1020.41 |
| 33616.0 | 1022.82 |
| 33617.0 | 1028.99 |
| 33618.0 | 1050.45 |
| 33619.0 | 1050.79 |
| 33620.0 | 1045.37 |
| 33623.0 | 1048.98 |
| 33624.0 | 1053.99 |
| 33625.0 | 1046.64 |
| 33626.0 | 1039.87 |
| 33627.0 | 1040.46 |
| 33630.0 | 1056.28 |
| 33631.0 | 1055.7 |
| 33632.0 | 1051.94 |
| 33633.0 | 1051.31 |
| 33634.0 | 1045.71 |
| 33637.0 | 1056.81 |
| 33638.0 | 1044.47 |
| 33639.0 | 1058.12 |
| 33640.0 | 1054.44 |
| 33641.0 | 1061.81 |
| 33644.0 | 1042.63 |
| 33645.0 | 1046.78 |
| 33646.0 | 1046.48 |
| 33647.0 | 1051.15 |
| 33648.0 | 1049.22 |
| 33651.0 | 1047.65 |
| 33652.0 | 1062.38 |
| 33653.0 | 1058.04 |
| 33654.0 | 1067.45 |
| 33655.0 | 1066.58 |
| 33658.0 | 1074.47 |
| 33659.0 | 1065.91 |
| 33660.0 | 1082.58 |
| 33661.0 | 1088.49 |
| 33662.0 | 1082.35 |
| 33665.0 | 1083.9 |
| 33666.0 | 1085.66 |
| 33667.0 | 1090.92 |
| 33668.0 | 1084.9 |
| 33669.0 | 1081.98 |
| 33672.0 | 1083.11 |
| 33673.0 | 1083.76 |
| 33674.0 | 1078.5 |
| 33675.0 | 1071.09 |
| 33676.0 | 1068.02 |
| 33679.0 | 1067.11 |
| 33680.0 | 1068.27 |
| 33681.0 | 1066.09 |
| 33682.0 | 1063.11 |
| 33683.0 | 1070.82 |
| 33686.0 | 1056.89 |
| 33687.0 | 1056.71 |
| 33688.0 | 1058.58 |
| 33689.0 | 1062.19 |
| 33690.0 | 1057.9 |
| 33693.0 | 1060.79 |
| 33694.0 | 1060.78 |
| 33695.0 | 1058.37 |
| 33696.0 | 1060.68 |
| 33697.0 | 1061.76 |
| 33700.0 | 1069.29 |
| 33701.0 | 1073.69 |
| 33702.0 | 1050.82 |
| 33703.0 | 1054.29 |
| 33704.0 | 1068.93 |
| 33707.0 | 1065.04 |
| 33708.0 | 1063.47 |
| 33709.0 | 1078.97 |
| 33710.0 | 1069.61 |
| 33711.0 | 1069.99 |
| 33714.0 | 1080.62 |
| 33715.0 | 1079.94 |
| 33716.0 | 1079.64 |
| 33717.0 | 1079.33 |
| 33718.0 | 1078.95 |
| 33721.0 | 1079.55 |
| 33722.0 | 1081.64 |
| 33723.0 | 1084.76 |
| 33724.0 | 1085.06 |
| 33725.0 | 1082.71 |
| 33728.0 | 1080.82 |
| 33729.0 | 1085.05 |
| 33730.0 | 1086.62 |
| 33731.0 | 1088.98 |
| 33732.0 | 1093.09 |
| 33735.0 | 1098.9 |
| 33736.0 | 1091.83 |
| 33737.0 | 1089.26 |
| 33738.0 | 1080.29 |
| 33739.0 | 1087.94 |
| 33742.0 | 1089 |
| 33743.0 | 1091.1 |
| 33744.0 | 1091.86 |
| 33745.0 | 1093.37 |
| 33746.0 | 1103.72 |
| 33749.0 | 1108.28 |
| 33750.0 | 1101.76 |
| 33751.0 | 1098.2 |
| 33752.0 | 1099.05 |
| 33753.0 | 1105.18 |
| 33756.0 | 1103.53 |
| 33757.0 | 1101.27 |
| 33758.0 | 1100.54 |
| 33759.0 | 1097.85 |
| 33760.0 | 1093.42 |
| 33763.0 | 1092.5 |
| 33764.0 | 1084.7 |
| 33765.0 | 1086.09 |
| 33766.0 | 1077.6 |
| 33767.0 | 1078.4 |
| 33770.0 | 1072.76 |
| 33771.0 | 1077.18 |
| 33772.0 | 1071.76 |
| 33773.0 | 1063.92 |
| 33774.0 | 1064.49 |
| 33777.0 | 1062.09 |
| 33778.0 | 1063.62 |
| 33779.0 | 1061.28 |
| 33780.0 | 1060.05 |
| 33781.0 | 1062.84 |
| 33784.0 | 1056.59 |
| 33785.0 | 1056.93 |
| 33786.0 | 1048.29 |
| 33787.0 | 1057.98 |
| 33788.0 | 1058.53 |
| 33791.0 | 1053.35 |
| 33792.0 | 1051.5 |
| 33793.0 | 1047.16 |
| 33794.0 | 1054.99 |
| 33795.0 | 1057.89 |
| 33798.0 | 1045.96 |
| 33799.0 | 1044.81 |
| 33800.0 | 1040.35 |
| 33801.0 | 1045.6 |
| 33802.0 | 1023.83 |
| 33805.0 | 999.15 |
| 33806.0 | 998.51 |
| 33807.0 | 990.68 |
| 33808.0 | 989.85 |
| 33809.0 | 978.09 |
| 33812.0 | 983.31 |
| 33813.0 | 982.82 |
| 33814.0 | 989.34 |
| 33815.0 | 993.47 |
| 33816.0 | 988.96 |
| 33819.0 | 987.91 |
| 33820.0 | 992.34 |
| 33821.0 | 993.09 |
| 33822.0 | 997.54 |
| 33823.0 | 985.2 |
| 33826.0 | 975.41 |
| 33827.0 | 961.91 |
| 33828.0 | 957.61 |
| 33829.0 | 951.98 |
| 33830.0 | 963.84 |
| 33833.0 | 964.61 |
| 33834.0 | 956.36 |
| 33835.0 | 957.62 |
| 33836.0 | 955.68 |
| 33837.0 | 968.19 |
| 33840.0 | 941.72 |
| 33841.0 | 935.47 |
| 33842.0 | 933.84 |
| 33843.0 | 942.65 |
| 33844.0 | 943.43 |
| 33847.0 | 951.68 |
| 33848.0 | 945.84 |
| 33849.0 | 945.24 |
| 33850.0 | 964.86 |
| 33851.0 | 968.69 |
| 33854.0 | 964 |
| 33855.0 | 961.34 |
| 33856.0 | 957.87 |
| 33857.0 | 954.49 |
| 33858.0 | 966.2 |
| 33861.0 | 1005.61 |
| 33862.0 | 992.17 |
| 33863.0 | 1018.38 |
| 33864.0 | 1005.53 |
| 33865.0 | 1036.18 |
| 33868.0 | 1013.23 |
| 33869.0 | 1020.47 |
| 33870.0 | 1007.01 |
| 33871.0 | 1009.94 |
| 33872.0 | 1002.4 |
| 33875.0 | 972.74 |
| 33876.0 | 970.13 |
| 33877.0 | 968.58 |
| 33878.0 | 958.97 |
| 33879.0 | 971.11 |
| 33882.0 | 920.65 |
| 33883.0 | 928.88 |
| 33884.0 | 931.96 |
| 33885.0 | 945.27 |
| 33886.0 | 952.37 |
| 33889.0 | 954.1 |
| 33890.0 | 959.87 |
| 33891.0 | 956.22 |
| 33892.0 | 950.13 |
| 33893.0 | 955.48 |
| 33896.0 | 953.12 |
| 33897.0 | 977.87 |
| 33898.0 | 962.91 |
| 33899.0 | 975.9 |
| 33900.0 | 988.52 |
| 33903.0 | 991.92 |
| 33904.0 | 988.47 |
| 33905.0 | 983.96 |
| 33906.0 | 978.65 |
| 33907.0 | 980.05 |
| 33910.0 | 979.79 |
| 33911.0 | 987.1 |
| 33912.0 | 987.65 |
| 33913.0 | 983.46 |
| 33914.0 | 978.72 |
| 33917.0 | 988.19 |
| 33918.0 | 999.19 |
| 33919.0 | 999.69 |
| 33920.0 | 1003.02 |
| 33921.0 | 1008.47 |
| 33924.0 | 1004.94 |
| 33925.0 | 1007.38 |
| 33926.0 | 1010.77 |
| 33927.0 | 1006.1 |
| 33928.0 | 993.55 |
| 33931.0 | 994.66 |
| 33932.0 | 997.83 |
| 33933.0 | 998.69 |
| 33934.0 | 999.34 |
| 33935.0 | 1009.72 |
| 33938.0 | 1012.37 |
| 33939.0 | 1010.7 |
| 33940.0 | 1005.95 |
| 33941.0 | 1005.95 |
| 33942.0 | 1004.67 |
| 33945.0 | 1010.94 |
| 33946.0 | 1001.4 |
| 33947.0 | 1003.7 |
| 33948.0 | 993.97 |
| 33949.0 | 989.86 |
| 33952.0 | 987.01 |
| 33953.0 | 988.15 |
| 33954.0 | 977.95 |
| 33955.0 | 988.38 |
| 33956.0 | 1000.43 |
| 33959.0 | 1014.45 |
| 33960.0 | 1023.98 |
| 33961.0 | 1025.51 |
| 33962.0 | 1031.59 |
| 33963.0 | 1031.99 |
| 33966.0 | 1025.32 |
| 33967.0 | 1040.9 |
| 33968.0 | 1034.45 |
| 33969.0 | 1033.51 |
| 33970.0 | 1033.66 |
| 33973.0 | 1028.81 |
| 33974.0 | 1039.76 |
| 33975.0 | 1039.67 |
| 33976.0 | 1034.24 |
| 33977.0 | 1027.8 |
| 33980.0 | 1014.66 |
| 33981.0 | 1017.84 |
| 33982.0 | 1016.11 |
| 33983.0 | 1023.19 |
| 33984.0 | 1036.54 |
| 33987.0 | 1047.05 |
| 33988.0 | 1047.03 |
| 33989.0 | 1046.62 |
| 33990.0 | 1048.36 |
| 33991.0 | 1051.29 |
| 33994.0 | 1034.69 |
| 33995.0 | 1045.07 |
| 33996.0 | 1037.13 |
| 33997.0 | 1038.88 |
| 33998.0 | 1043.55 |
| 34001.0 | 1051.34 |
| 34002.0 | 1054.58 |
| 34003.0 | 1072.46 |
| 34004.0 | 1079.36 |
| 34005.0 | 1097.01 |
| 34008.0 | 1101.94 |
| 34009.0 | 1094.13 |
| 34010.0 | 1095.43 |
| 34011.0 | 1101.06 |
| 34012.0 | 1099.46 |
| 34015.0 | 1106.34 |
| 34016.0 | 1098.08 |
| 34017.0 | 1096.6 |
| 34018.0 | 1109.86 |
| 34019.0 | 1112.21 |
| 34022.0 | 1118.75 |
| 34023.0 | 1111.42 |
| 34024.0 | 1109.4 |
| 34025.0 | 1112.65 |
| 34026.0 | 1128.36 |
| 34029.0 | 1140.59 |
| 34030.0 | 1139.91 |
| 34031.0 | 1141.15 |
| 34032.0 | 1138.23 |
| 34033.0 | 1141.56 |
| 34036.0 | 1146.06 |
| 34037.0 | 1148.63 |
| 34038.0 | 1147.44 |
| 34039.0 | 1148.35 |
| 34040.0 | 1135.92 |
| 34043.0 | 1139.06 |
| 34044.0 | 1135.51 |
| 34045.0 | 1130.76 |
| 34046.0 | 1133.46 |
| 34047.0 | 1135.09 |
| 34050.0 | 1118.33 |
| 34051.0 | 1118.76 |
| 34052.0 | 1119.93 |
| 34053.0 | 1127.34 |
| 34054.0 | 1130.78 |
| 34057.0 | 1136.44 |
| 34058.0 | 1139.72 |
| 34059.0 | 1140.82 |
| 34060.0 | 1130.04 |
| 34061.0 | 1122.92 |
| 34064.0 | 1119.36 |
| 34065.0 | 1126.34 |
| 34066.0 | 1123.45 |
| 34067.0 | 1130.13 |
| 34068.0 | 1127.08 |
| 34071.0 | 1126.34 |
| 34072.0 | 1139.77 |
| 34073.0 | 1138.3 |
| 34074.0 | 1135.2 |
| 34075.0 | 1138.89 |
| 34078.0 | 1142.12 |
| 34079.0 | 1136.21 |
| 34080.0 | 1127.24 |
| 34081.0 | 1130.8 |
| 34082.0 | 1123.68 |
| 34085.0 | 1121.77 |
| 34086.0 | 1121.59 |
| 34087.0 | 1120.58 |
| 34088.0 | 1109.83 |
| 34089.0 | 1114.25 |
| 34092.0 | 1117.22 |
| 34093.0 | 1116.43 |
| 34094.0 | 1115.33 |
| 34095.0 | 1113.33 |
| 34096.0 | 1103.06 |
| 34099.0 | 1103.24 |
| 34100.0 | 1103.51 |
| 34101.0 | 1107.86 |
| 34102.0 | 1122.14 |
| 34103.0 | 1113.78 |
| 34106.0 | 1106.7 |
| 34107.0 | 1108.23 |
| 34108.0 | 1106.5 |
| 34109.0 | 1104.22 |
| 34110.0 | 1102.94 |
| 34113.0 | 1107.2 |
| 34114.0 | 1115.34 |
| 34115.0 | 1113.38 |
| 34116.0 | 1117.93 |
| 34117.0 | 1113.7 |
| 34120.0 | 1113.68 |
| 34121.0 | 1107.38 |
| 34122.0 | 1110.22 |
| 34123.0 | 1110.47 |
| 34124.0 | 1109.2 |
| 34127.0 | 1114.59 |
| 34128.0 | 1118.2 |
| 34129.0 | 1129.83 |
| 34130.0 | 1131.03 |
| 34131.0 | 1136.25 |
| 34134.0 | 1138.45 |
| 34135.0 | 1131.08 |
| 34136.0 | 1136.87 |
| 34137.0 | 1134.49 |
| 34138.0 | 1140.78 |
| 34141.0 | 1144.34 |
| 34142.0 | 1157.33 |
| 34143.0 | 1157.26 |
| 34144.0 | 1153.37 |
| 34145.0 | 1153.83 |
| 34148.0 | 1161.96 |
| 34149.0 | 1156.5 |
| 34150.0 | 1157.58 |
| 34151.0 | 1156.84 |
| 34152.0 | 1147.51 |
| 34155.0 | 1144.93 |
| 34156.0 | 1147.62 |
| 34157.0 | 1154.35 |
| 34158.0 | 1181.25 |
| 34159.0 | 1186.77 |
| 34162.0 | 1190.42 |
| 34163.0 | 1187.02 |
| 34164.0 | 1187.25 |
| 34165.0 | 1191.95 |
| 34166.0 | 1190.28 |
| 34169.0 | 1195.4 |
| 34170.0 | 1192.38 |
| 34171.0 | 1181.09 |
| 34172.0 | 1186.64 |
| 34173.0 | 1194.61 |
| 34176.0 | 1202.53 |
| 34177.0 | 1202.27 |
| 34178.0 | 1201.89 |
| 34179.0 | 1214.8 |
| 34180.0 | 1236.14 |
| 34183.0 | 1245.89 |
| 34184.0 | 1241.47 |
| 34185.0 | 1244.39 |
| 34186.0 | 1242.77 |
| 34187.0 | 1247.11 |
| 34190.0 | 1260.27 |
| 34191.0 | 1253.82 |
| 34192.0 | 1270.63 |
| 34193.0 | 1266.59 |
| 34194.0 | 1269.49 |
| 34197.0 | 1273.5 |
| 34198.0 | 1275.57 |
| 34199.0 | 1293.3 |
| 34200.0 | 1299.07 |
| 34201.0 | 1287.25 |
| 34204.0 | 1280.01 |
| 34205.0 | 1284.42 |
| 34206.0 | 1304.85 |
| 34207.0 | 1302.86 |
| 34208.0 | 1308.24 |
| 34211.0 | 1317.64 |
| 34212.0 | 1321.88 |
| 34213.0 | 1307.58 |
| 34214.0 | 1307.92 |
| 34215.0 | 1307.61 |
| 34218.0 | 1297.08 |
| 34219.0 | 1287.05 |
| 34220.0 | 1278.79 |
| 34221.0 | 1276.85 |
| 34222.0 | 1271.75 |
| 34225.0 | 1270.08 |
| 34226.0 | 1277.9 |
| 34227.0 | 1261.46 |
| 34228.0 | 1256.55 |
| 34229.0 | 1267.02 |
| 34232.0 | 1279.08 |
| 34233.0 | 1275.84 |
| 34234.0 | 1266.05 |
| 34235.0 | 1267.75 |
| 34236.0 | 1263.38 |
| 34239.0 | 1281.61 |
| 34240.0 | 1283.62 |
| 34241.0 | 1279.85 |
| 34242.0 | 1285.92 |
| 34243.0 | 1287.49 |
| 34246.0 | 1293.23 |
| 34247.0 | 1313.89 |
| 34248.0 | 1322.78 |
| 34249.0 | 1321.29 |
| 34250.0 | 1336.44 |
| 34253.0 | 1320.14 |
| 34254.0 | 1315.69 |
| 34255.0 | 1314.41 |
| 34256.0 | 1313.68 |
| 34257.0 | 1326.15 |
| 34260.0 | 1339.69 |
| 34261.0 | 1335.07 |
| 34262.0 | 1342.11 |
| 34263.0 | 1351.2 |
| 34264.0 | 1366.84 |
| 34267.0 | 1369.39 |
| 34268.0 | 1361.37 |
| 34269.0 | 1349.74 |
| 34270.0 | 1353.7 |
| 34271.0 | 1359.41 |
| 34274.0 | 1360.77 |
| 34275.0 | 1367.39 |
| 34276.0 | 1364.93 |
| 34277.0 | 1353.48 |
| 34278.0 | 1323.35 |
| 34281.0 | 1322.96 |
| 34282.0 | 1329.71 |
| 34283.0 | 1320.77 |
| 34284.0 | 1318.93 |
| 34285.0 | 1316.41 |
| 34288.0 | 1329.77 |
| 34289.0 | 1330.29 |
| 34290.0 | 1336.67 |
| 34291.0 | 1345.02 |
| 34292.0 | 1340.76 |
| 34295.0 | 1310.32 |
| 34296.0 | 1303.98 |
| 34297.0 | 1304.92 |
| 34298.0 | 1319.41 |
| 34299.0 | 1324.02 |
| 34302.0 | 1322.54 |
| 34303.0 | 1326.28 |
| 34304.0 | 1347.38 |
| 34305.0 | 1356.17 |
| 34306.0 | 1363.86 |
| 34309.0 | 1368.98 |
| 34310.0 | 1371.06 |
| 34311.0 | 1385.54 |
| 34312.0 | 1395.19 |
| 34313.0 | 1385.03 |
| 34316.0 | 1388.06 |
| 34317.0 | 1371.28 |
| 34318.0 | 1364.39 |
| 34319.0 | 1374.58 |
| 34320.0 | 1385.53 |
| 34323.0 | 1398.71 |
| 34324.0 | 1402.55 |
| 34325.0 | 1410.18 |
| 34326.0 | 1421.32 |
| 34327.0 | 1421.46 |
| 34330.0 | 1433.22 |
| 34331.0 | 1425.08 |
| 34332.0 | 1420.37 |
| 34333.0 | 1431.63 |
| 34334.0 | 1433.34 |
| 34337.0 | 1440.91 |
| 34338.0 | 1436.03 |
| 34339.0 | 1424.89 |
| 34340.0 | 1429.78 |
| 34341.0 | 1433.71 |
| 34344.0 | 1438.03 |
| 34345.0 | 1440.3 |
| 34346.0 | 1420.37 |
| 34347.0 | 1401.53 |
| 34348.0 | 1406.11 |
| 34351.0 | 1403.61 |
| 34352.0 | 1408.49 |
| 34353.0 | 1421.76 |
| 34354.0 | 1413.34 |
| 34355.0 | 1403.16 |
| 34358.0 | 1409.51 |
| 34359.0 | 1418.52 |
| 34360.0 | 1421.35 |
| 34361.0 | 1422.43 |
| 34362.0 | 1436.71 |
| 34365.0 | 1456.88 |
| 34366.0 | 1453.55 |
| 34367.0 | 1459.27 |
| 34368.0 | 1447.44 |
| 34369.0 | 1444.99 |
| 34372.0 | 1415.52 |
| 34373.0 | 1433.9 |
| 34374.0 | 1429.25 |
| 34375.0 | 1433.5 |
| 34376.0 | 1422.66 |
| 34379.0 | 1418.12 |
| 34380.0 | 1422.12 |
| 34381.0 | 1428.76 |
| 34382.0 | 1433.04 |
| 34383.0 | 1432.03 |
| 34386.0 | 1412.26 |
| 34387.0 | 1406.44 |
| 34388.0 | 1419.19 |
| 34389.0 | 1390.34 |
| 34390.0 | 1381.66 |
| 34393.0 | 1396.06 |
| 34394.0 | 1374.03 |
| 34395.0 | 1347.84 |
| 34396.0 | 1360.09 |
| 34397.0 | 1372 |
| 34400.0 | 1396.36 |
| 34401.0 | 1398.47 |
| 34402.0 | 1387.76 |
| 34403.0 | 1393.91 |
| 34404.0 | 1380.04 |
| 34407.0 | 1402.91 |
| 34408.0 | 1418.62 |
| 34409.0 | 1414.77 |
| 34410.0 | 1417.33 |
| 34411.0 | 1404.37 |
| 34414.0 | 1391.96 |
| 34415.0 | 1390.01 |
| 34416.0 | 1397.12 |
| 34417.0 | 1383.47 |
| 34418.0 | 1369.6 |
| 34421.0 | 1385.36 |
| 34422.0 | 1383 |
| 34423.0 | 1367.86 |
| 34424.0 | 1365.74 |
| 34425.0 | 1368.12 |
| 34428.0 | 1364.65 |
| 34429.0 | 1373.5 |
| 34430.0 | 1394.06 |
| 34431.0 | 1399.86 |
| 34432.0 | 1407.45 |
| 34435.0 | 1425.69 |
| 34436.0 | 1429.36 |
| 34437.0 | 1425.17 |
| 34438.0 | 1417.49 |
| 34439.0 | 1424.74 |
| 34442.0 | 1421.75 |
| 34443.0 | 1400.29 |
| 34444.0 | 1396.54 |
| 34445.0 | 1393.58 |
| 34446.0 | 1415.98 |
| 34449.0 | 1408.35 |
| 34450.0 | 1427.08 |
| 34451.0 | 1436.48 |
| 34452.0 | 1431.79 |
| 34453.0 | 1427.37 |
| 34456.0 | 1432.21 |
| 34457.0 | 1428.69 |
| 34458.0 | 1414.59 |
| 34459.0 | 1414.68 |
| 34460.0 | 1425.01 |
| 34463.0 | 1413.35 |
| 34464.0 | 1429.21 |
| 34465.0 | 1431.48 |
| 34466.0 | 1433.57 |
| 34467.0 | 1437.29 |
| 34470.0 | 1437.63 |
| 34471.0 | 1440.05 |
| 34472.0 | 1441.33 |
| 34473.0 | 1434.04 |
| 34474.0 | 1425.53 |
| 34477.0 | 1421 |
| 34478.0 | 1400.81 |
| 34479.0 | 1381.18 |
| 34480.0 | 1371.98 |
| 34481.0 | 1365.66 |
| 34484.0 | 1363.29 |
| 34485.0 | 1358.74 |
| 34486.0 | 1348.31 |
| 34487.0 | 1355 |
| 34488.0 | 1364.1 |
| 34491.0 | 1372.67 |
| 34492.0 | 1364.9 |
| 34493.0 | 1370.33 |
| 34494.0 | 1362.82 |
| 34495.0 | 1368.07 |
| 34498.0 | 1347.58 |
| 34499.0 | 1339.28 |
| 34500.0 | 1334.64 |
| 34501.0 | 1320.83 |
| 34502.0 | 1315.61 |
| 34505.0 | 1278.38 |
| 34506.0 | 1272 |
| 34507.0 | 1285.93 |
| 34508.0 | 1306.64 |
| 34509.0 | 1290.51 |
| 34512.0 | 1278.8 |
| 34513.0 | 1289.22 |
| 34514.0 | 1299.5 |
| 34515.0 | 1284.6 |
| 34516.0 | 1286.27 |
| 34519.0 | 1288.94 |
| 34520.0 | 1286.05 |
| 34521.0 | 1287.28 |
| 34522.0 | 1292 |
| 34523.0 | 1297.6 |
| 34526.0 | 1307.31 |
| 34527.0 | 1297.31 |
| 34528.0 | 1310.64 |
| 34529.0 | 1314 |
| 34530.0 | 1327.15 |
| 34533.0 | 1338.19 |
| 34534.0 | 1354.19 |
| 34535.0 | 1353.32 |
| 34536.0 | 1354.42 |
| 34537.0 | 1367.05 |
| 34540.0 | 1366.36 |
| 34541.0 | 1370.81 |
| 34542.0 | 1360.05 |
| 34543.0 | 1357.62 |
| 34544.0 | 1373.6 |
| 34547.0 | 1380.36 |
| 34548.0 | 1398.24 |
| 34549.0 | 1401.79 |
| 34550.0 | 1396.72 |
| 34551.0 | 1397.49 |
| 34554.0 | 1396.94 |
| 34555.0 | 1381.63 |
| 34556.0 | 1373.03 |
| 34557.0 | 1369.94 |
| 34558.0 | 1350.68 |
| 34561.0 | 1353.01 |
| 34562.0 | 1355.39 |
| 34563.0 | 1363.02 |
| 34564.0 | 1352.49 |
| 34565.0 | 1352.22 |
| 34568.0 | 1341.66 |
| 34569.0 | 1347 |
| 34570.0 | 1356.09 |
| 34571.0 | 1369.09 |
| 34572.0 | 1383.31 |
| 34575.0 | 1397.07 |
| 34576.0 | 1394.68 |
| 34577.0 | 1397.12 |
| 34578.0 | 1384 |
| 34579.0 | 1383.88 |
| 34582.0 | 1368.69 |
| 34583.0 | 1354.66 |
| 34584.0 | 1359.5 |
| 34585.0 | 1367.16 |
| 34586.0 | 1362.97 |
| 34589.0 | 1352.29 |
| 34590.0 | 1350.94 |
| 34591.0 | 1343.46 |
| 34592.0 | 1351.45 |
| 34593.0 | 1342.28 |
| 34596.0 | 1332.83 |
| 34597.0 | 1321.61 |
| 34598.0 | 1319.69 |
| 34599.0 | 1314.59 |
| 34600.0 | 1327.59 |
| 34603.0 | 1319.29 |
| 34604.0 | 1317.98 |
| 34605.0 | 1329.13 |
| 34606.0 | 1312.49 |
| 34607.0 | 1302.53 |
| 34610.0 | 1292.05 |
| 34611.0 | 1291.81 |
| 34612.0 | 1268.62 |
| 34613.0 | 1269.74 |
| 34614.0 | 1268.87 |
| 34617.0 | 1296.61 |
| 34618.0 | 1316.56 |
| 34619.0 | 1319.51 |
| 34620.0 | 1333.21 |
| 34621.0 | 1334.83 |
| 34624.0 | 1326.1 |
| 34625.0 | 1317.49 |
| 34626.0 | 1304.88 |
| 34627.0 | 1308.15 |
| 34628.0 | 1289.34 |
| 34631.0 | 1291.24 |
| 34632.0 | 1275.36 |
| 34633.0 | 1285.21 |
| 34634.0 | 1289.75 |
| 34635.0 | 1312.51 |
| 34638.0 | 1327.67 |
| 34639.0 | 1321.83 |
| 34640.0 | 1304.8 |
| 34641.0 | 1315.17 |
| 34642.0 | 1321.16 |
| 34645.0 | 1305.87 |
| 34646.0 | 1312.15 |
| 34647.0 | 1331.69 |
| 34648.0 | 1328.05 |
| 34649.0 | 1326 |
| 34652.0 | 1329.47 |
| 34653.0 | 1344.61 |
| 34654.0 | 1337.76 |
| 34655.0 | 1330.84 |
| 34656.0 | 1328.5 |
| 34659.0 | 1332.02 |
| 34660.0 | 1314.21 |
| 34661.0 | 1295.05 |
| 34662.0 | 1312.35 |
| 34663.0 | 1313.97 |
| 34666.0 | 1319.31 |
| 34667.0 | 1313.83 |
| 34668.0 | 1323.35 |
| 34669.0 | 1321.32 |
| 34670.0 | 1325.7 |
| 34673.0 | 1334.17 |
| 34674.0 | 1322.52 |
| 34675.0 | 1322.22 |
| 34676.0 | 1316.92 |
| 34677.0 | 1305.13 |
| 34680.0 | 1296.02 |
| 34681.0 | 1293.5 |
| 34682.0 | 1299.74 |
| 34683.0 | 1306.21 |
| 34684.0 | 1312.17 |
| 34687.0 | 1314.24 |
| 34688.0 | 1315.12 |
| 34689.0 | 1325.52 |
| 34690.0 | 1330.99 |
| 34691.0 | 1331.54 |
| 34694.0 | 1334.14 |
| 34695.0 | 1337.81 |
| 34696.0 | 1341.66 |
| 34697.0 | 1312.9 |
| 34698.0 | 1320.59 |
| 34701.0 | 1315.75 |
| 34702.0 | 1317.34 |
| 34703.0 | 1318.64 |
| 34704.0 | 1308.53 |
| 34705.0 | 1310.15 |
| 34708.0 | 1304.48 |
| 34709.0 | 1301.75 |
| 34710.0 | 1298.69 |
| 34711.0 | 1300.27 |
| 34712.0 | 1303.13 |
| 34715.0 | 1322.54 |
| 34716.0 | 1317.97 |
| 34717.0 | 1315.89 |
| 34718.0 | 1319.01 |
| 34719.0 | 1305.78 |
| 34722.0 | 1288.91 |
| 34723.0 | 1292.01 |
| 34724.0 | 1294.99 |
| 34725.0 | 1305.39 |
| 34726.0 | 1306.55 |
| 34729.0 | 1306.73 |
| 34730.0 | 1296.71 |
| 34731.0 | 1314.58 |
| 34732.0 | 1314.11 |
| 34733.0 | 1325.2 |
| 34736.0 | 1339.4 |
| 34737.0 | 1337.86 |
| 34738.0 | 1334.62 |
| 34739.0 | 1343.66 |
| 34740.0 | 1348.1 |
| 34743.0 | 1340.69 |
| 34744.0 | 1344.6 |
| 34745.0 | 1346.27 |
| 34746.0 | 1331.42 |
| 34747.0 | 1329.81 |
| 34750.0 | 1319.1 |
| 34751.0 | 1319.05 |
| 34752.0 | 1314.36 |
| 34753.0 | 1325.85 |
| 34754.0 | 1321.92 |
| 34757.0 | 1313.54 |
| 34758.0 | 1312.78 |
| 34759.0 | 1322.62 |
| 34760.0 | 1321.78 |
| 34761.0 | 1316.19 |
| 34764.0 | 1304.05 |
| 34765.0 | 1296.32 |
| 34766.0 | 1282.35 |
| 34767.0 | 1274.57 |
| 34768.0 | 1282.26 |
| 34771.0 | 1275.46 |
| 34772.0 | 1287.85 |
| 34773.0 | 1285.04 |
| 34774.0 | 1289.06 |
| 34775.0 | 1305.29 |
| 34778.0 | 1303.91 |
| 34779.0 | 1301.41 |
| 34780.0 | 1303.8 |
| 34781.0 | 1280.09 |
| 34782.0 | 1284.27 |
| 34785.0 | 1295.5 |
| 34786.0 | 1285.68 |
| 34787.0 | 1288.75 |
| 34788.0 | 1307.45 |
| 34789.0 | 1300.13 |
| 34792.0 | 1298.18 |
| 34793.0 | 1312.51 |
| 34794.0 | 1314.91 |
| 34795.0 | 1322.25 |
| 34796.0 | 1318.14 |
| 34799.0 | 1313.45 |
| 34800.0 | 1316.22 |
| 34801.0 | 1319.31 |
| 34802.0 | 1319.39 |
| 34803.0 | 1321 |
| 34806.0 | 1322.13 |
| 34807.0 | 1313.99 |
| 34808.0 | 1314.07 |
| 34809.0 | 1315.96 |
| 34810.0 | 1333.56 |
| 34813.0 | 1331.78 |
| 34814.0 | 1343.63 |
| 34815.0 | 1352.99 |
| 34816.0 | 1352.3 |
| 34817.0 | 1346.68 |
| 34820.0 | 1353.12 |
| 34821.0 | 1366.09 |
| 34822.0 | 1372.6 |
| 34823.0 | 1374.59 |
| 34824.0 | 1369.95 |
| 34827.0 | 1369.38 |
| 34828.0 | 1382.59 |
| 34829.0 | 1390.37 |
| 34830.0 | 1394.78 |
| 34831.0 | 1397.85 |
| 34834.0 | 1390.14 |
| 34835.0 | 1400.6 |
| 34836.0 | 1395.11 |
| 34837.0 | 1384.17 |
| 34838.0 | 1368.56 |
| 34841.0 | 1379.26 |
| 34842.0 | 1377.25 |
| 34843.0 | 1389.13 |
| 34844.0 | 1386.57 |
| 34845.0 | 1366.49 |
| 34848.0 | 1360 |
| 34849.0 | 1371.27 |
| 34850.0 | 1377.67 |
| 34851.0 | 1394.26 |
| 34852.0 | 1395.04 |
| 34855.0 | 1394.93 |
| 34856.0 | 1394.92 |
| 34857.0 | 1397.06 |
| 34858.0 | 1390.89 |
| 34859.0 | 1377.42 |
| 34862.0 | 1375.53 |
| 34863.0 | 1376.66 |
| 34864.0 | 1373.44 |
| 34865.0 | 1381.04 |
| 34866.0 | 1373.41 |
| 34869.0 | 1385.22 |
| 34870.0 | 1382.7 |
| 34871.0 | 1383.11 |
| 34872.0 | 1395.21 |
| 34873.0 | 1390.06 |
| 34876.0 | 1390.96 |
| 34877.0 | 1383.23 |
| 34878.0 | 1369.96 |
| 34879.0 | 1369.88 |
| 34880.0 | 1362.52 |
| 34883.0 | 1371.32 |
| 34884.0 | 1381.8 |
| 34885.0 | 1383.98 |
| 34886.0 | 1382.42 |
| 34887.0 | 1409.15 |
| 34890.0 | 1422.24 |
| 34891.0 | 1427.72 |
| 34892.0 | 1433.24 |
| 34893.0 | 1436.53 |
| 34894.0 | 1427.71 |
| 34897.0 | 1432.5 |
| 34898.0 | 1429.64 |
| 34899.0 | 1417.83 |
| 34900.0 | 1412.99 |
| 34901.0 | 1418.79 |
| 34904.0 | 1431.84 |
| 34905.0 | 1443.23 |
| 34906.0 | 1446.81 |
| 34907.0 | 1446.46 |
| 34908.0 | 1440.2 |
| 34911.0 | 1435.52 |
| 34912.0 | 1435.56 |
| 34913.0 | 1455.38 |
| 34914.0 | 1447.58 |
| 34915.0 | 1448.35 |
| 34918.0 | 1451.33 |
| 34919.0 | 1451.31 |
| 34920.0 | 1445.04 |
| 34921.0 | 1446.24 |
| 34922.0 | 1448.09 |
| 34925.0 | 1442.91 |
| 34926.0 | 1448.51 |
| 34927.0 | 1453.87 |
| 34928.0 | 1452.71 |
| 34929.0 | 1459.19 |
| 34932.0 | 1466.2 |
| 34933.0 | 1458.76 |
| 34934.0 | 1456.82 |
| 34935.0 | 1453.06 |
| 34936.0 | 1448.77 |
| 34939.0 | 1438.38 |
| 34940.0 | 1435.2 |
| 34941.0 | 1440.17 |
| 34942.0 | 1432.86 |
| 34943.0 | 1432.19 |
| 34946.0 | 1443 |
| 34947.0 | 1446.49 |
| 34948.0 | 1450.19 |
| 34949.0 | 1447.03 |
| 34950.0 | 1449.53 |
| 34953.0 | 1448.65 |
| 34954.0 | 1452.99 |
| 34955.0 | 1464.6 |
| 34956.0 | 1467.5 |
| 34957.0 | 1469.19 |
| 34960.0 | 1459.76 |
| 34961.0 | 1466.58 |
| 34962.0 | 1465.6 |
| 34963.0 | 1460.87 |
| 34964.0 | 1427.68 |
| 34967.0 | 1425.73 |
| 34968.0 | 1437.57 |
| 34969.0 | 1422.01 |
| 34970.0 | 1407.34 |
| 34971.0 | 1419.6 |
| 34974.0 | 1422.45 |
| 34975.0 | 1423.05 |
| 34976.0 | 1427.18 |
| 34977.0 | 1428.26 |
| 34978.0 | 1417.28 |
| 34981.0 | 1409.74 |
| 34982.0 | 1395.99 |
| 34983.0 | 1403.18 |
| 34984.0 | 1408.5 |
| 34985.0 | 1418.95 |
| 34988.0 | 1413.06 |
| 34989.0 | 1412.95 |
| 34990.0 | 1412.09 |
| 34991.0 | 1405.78 |
| 34992.0 | 1394.95 |
| 34995.0 | 1370.71 |
| 34996.0 | 1376.41 |
| 34997.0 | 1393.82 |
| 34998.0 | 1385.92 |
| 34999.0 | 1367.15 |
| 35002.0 | 1391.12 |
| 35003.0 | 1407.17 |
| 35004.0 | 1406.86 |
| 35005.0 | 1414.24 |
| 35006.0 | 1420.17 |
| 35009.0 | 1410.78 |
| 35010.0 | 1416.33 |
| 35011.0 | 1415.68 |
| 35012.0 | 1424.28 |
| 35013.0 | 1417.32 |
| 35016.0 | 1416.54 |
| 35017.0 | 1421.71 |
| 35018.0 | 1426.58 |
| 35019.0 | 1439.55 |
| 35020.0 | 1440.88 |
| 35023.0 | 1449.35 |
| 35024.0 | 1442.92 |
| 35025.0 | 1444.01 |
| 35026.0 | 1440.97 |
| 35027.0 | 1448.04 |
| 35030.0 | 1459.12 |
| 35031.0 | 1455.17 |
| 35032.0 | 1459.1 |
| 35033.0 | 1455.1 |
| 35034.0 | 1461.04 |
| 35037.0 | 1450.38 |
| 35038.0 | 1461.55 |
| 35039.0 | 1467.33 |
| 35040.0 | 1467.5 |
| 35041.0 | 1474.15 |
| 35044.0 | 1481.72 |
| 35045.0 | 1493.92 |
| 35046.0 | 1487.9 |
| 35047.0 | 1501.94 |
| 35048.0 | 1491.1 |
| 35051.0 | 1481.58 |
| 35052.0 | 1469.93 |
| 35053.0 | 1484.09 |
| 35054.0 | 1490.43 |
| 35055.0 | 1507.08 |
| 35058.0 | 1508.48 |
| 35059.0 | 1509.91 |
| 35060.0 | 1508.09 |
| 35061.0 | 1507.52 |
| 35062.0 | 1506.82 |
| 35065.0 | 1507.65 |
| 35066.0 | 1526.58 |
| 35067.0 | 1544.07 |
| 35068.0 | 1535.23 |
| 35069.0 | 1527.9 |
| 35072.0 | 1526.41 |
| 35073.0 | 1530.44 |
| 35074.0 | 1523.43 |
| 35075.0 | 1513.85 |
| 35076.0 | 1535.02 |
| 35079.0 | 1533.84 |
| 35080.0 | 1549.09 |
| 35081.0 | 1558.37 |
| 35082.0 | 1563.18 |
| 35083.0 | 1577.92 |
| 35086.0 | 1576.04 |
| 35087.0 | 1565.5 |
| 35088.0 | 1586.43 |
| 35089.0 | 1593.03 |
| 35090.0 | 1599.87 |
| 35093.0 | 1605.08 |
| 35094.0 | 1603.77 |
| 35095.0 | 1611.05 |
| 35096.0 | 1608.78 |
| 35097.0 | 1610.54 |
| 35100.0 | 1590.69 |
| 35101.0 | 1594.11 |
| 35102.0 | 1594.51 |
| 35103.0 | 1586.24 |
| 35104.0 | 1583.29 |
| 35107.0 | 1589.01 |
| 35108.0 | 1599.64 |
| 35109.0 | 1593.17 |
| 35110.0 | 1587.69 |
| 35111.0 | 1586.81 |
| 35114.0 | 1572.32 |
| 35115.0 | 1556.36 |
| 35116.0 | 1563.72 |
| 35117.0 | 1579.31 |
| 35118.0 | 1594.36 |
| 35121.0 | 1581.35 |
| 35122.0 | 1577.78 |
| 35123.0 | 1593.88 |
| 35124.0 | 1595.64 |
| 35125.0 | 1609.59 |
| 35128.0 | 1604.76 |
| 35129.0 | 1593.18 |
| 35130.0 | 1592.6 |
| 35131.0 | 1599.87 |
| 35132.0 | 1585.61 |
| 35135.0 | 1563.31 |
| 35136.0 | 1566.72 |
| 35137.0 | 1568.97 |
| 35138.0 | 1576.33 |
| 35139.0 | 1578.08 |
| 35142.0 | 1589.2 |
| 35143.0 | 1601.27 |
| 35144.0 | 1600.39 |
| 35145.0 | 1603.15 |
| 35146.0 | 1604.06 |
| 35149.0 | 1606.1 |
| 35150.0 | 1602.44 |
| 35151.0 | 1611.44 |
| 35152.0 | 1604.96 |
| 35153.0 | 1612.24 |
| 35156.0 | 1619.33 |
| 35157.0 | 1620.88 |
| 35158.0 | 1622.79 |
| 35159.0 | 1627.37 |
| 35160.0 | 1625.74 |
| 35163.0 | 1626.08 |
| 35164.0 | 1627.77 |
| 35165.0 | 1644.85 |
| 35166.0 | 1633.45 |
| 35167.0 | 1632.71 |
| 35170.0 | 1647.87 |
| 35171.0 | 1651.56 |
| 35172.0 | 1639.99 |
| 35173.0 | 1645.28 |
| 35174.0 | 1651.43 |
| 35177.0 | 1666.3 |
| 35178.0 | 1665.07 |
| 35179.0 | 1666.47 |
| 35180.0 | 1670.37 |
| 35181.0 | 1674.5 |
| 35184.0 | 1669.09 |
| 35185.0 | 1671.13 |
| 35186.0 | 1675.67 |
| 35187.0 | 1673.12 |
| 35188.0 | 1653.2 |
| 35191.0 | 1655.77 |
| 35192.0 | 1655.23 |
| 35193.0 | 1645.41 |
| 35194.0 | 1651.74 |
| 35195.0 | 1658.16 |
| 35198.0 | 1660.23 |
| 35199.0 | 1676.5 |
| 35200.0 | 1687.45 |
| 35201.0 | 1684.09 |
| 35202.0 | 1678.32 |
| 35205.0 | 1685.34 |
| 35206.0 | 1691.04 |
| 35207.0 | 1681.22 |
| 35208.0 | 1682.84 |
| 35209.0 | 1678.46 |
| 35212.0 | 1680.44 |
| 35213.0 | 1686.86 |
| 35214.0 | 1678.81 |
| 35215.0 | 1668.58 |
| 35216.0 | 1673.76 |
| 35219.0 | 1662.58 |
| 35220.0 | 1665.87 |
| 35221.0 | 1673.71 |
| 35222.0 | 1674.43 |
| 35223.0 | 1666.66 |
| 35226.0 | 1676.01 |
| 35227.0 | 1680.02 |
| 35228.0 | 1685.21 |
| 35229.0 | 1675.32 |
| 35230.0 | 1665.96 |
| 35233.0 | 1665.98 |
| 35234.0 | 1672.31 |
| 35235.0 | 1661.97 |
| 35236.0 | 1651.82 |
| 35237.0 | 1649.54 |
| 35240.0 | 1658.69 |
| 35241.0 | 1667.28 |
| 35242.0 | 1667.4 |
| 35243.0 | 1657.51 |
| 35244.0 | 1665.9 |
| 35247.0 | 1663.44 |
| 35248.0 | 1662.17 |
| 35249.0 | 1662.39 |
| 35250.0 | 1668.86 |
| 35251.0 | 1657.4 |
| 35254.0 | 1643.72 |
| 35255.0 | 1649.9 |
| 35256.0 | 1644.54 |
| 35257.0 | 1637.84 |
| 35258.0 | 1624.01 |
| 35261.0 | 1614.81 |
| 35262.0 | 1578.26 |
| 35263.0 | 1589.28 |
| 35264.0 | 1599.28 |
| 35265.0 | 1602.75 |
| 35268.0 | 1578 |
| 35269.0 | 1586 |
| 35270.0 | 1563.32 |
| 35271.0 | 1578.7 |
| 35272.0 | 1571.31 |
| 35275.0 | 1573.74 |
| 35276.0 | 1574.73 |
| 35277.0 | 1590.93 |
| 35278.0 | 1601.71 |
| 35279.0 | 1616.43 |
| 35282.0 | 1620.54 |
| 35283.0 | 1617.66 |
| 35284.0 | 1621.59 |
| 35285.0 | 1620.71 |
| 35286.0 | 1612.64 |
| 35289.0 | 1610.67 |
| 35290.0 | 1614.26 |
| 35291.0 | 1612.07 |
| 35292.0 | 1615.67 |
| 35293.0 | 1620.22 |
| 35296.0 | 1627.45 |
| 35297.0 | 1638.17 |
| 35298.0 | 1625.95 |
| 35299.0 | 1637.33 |
| 35300.0 | 1633.28 |
| 35303.0 | 1625.81 |
| 35304.0 | 1628.32 |
| 35305.0 | 1627.22 |
| 35306.0 | 1615.32 |
| 35307.0 | 1601.43 |
| 35310.0 | 1602.57 |
| 35311.0 | 1595.17 |
| 35312.0 | 1604.53 |
| 35313.0 | 1605.33 |
| 35314.0 | 1605.98 |
| 35317.0 | 1623.19 |
| 35318.0 | 1630.62 |
| 35319.0 | 1626.79 |
| 35320.0 | 1635.45 |
| 35321.0 | 1656.08 |
| 35324.0 | 1665.71 |
| 35325.0 | 1659.79 |
| 35326.0 | 1655.95 |
| 35327.0 | 1658.05 |
| 35328.0 | 1665.15 |
| 35331.0 | 1655.69 |
| 35332.0 | 1652.97 |
| 35333.0 | 1672.15 |
| 35334.0 | 1678.28 |
| 35335.0 | 1689.69 |
| 35338.0 | 1694.51 |
| 35339.0 | 1693.99 |
| 35340.0 | 1705.92 |
| 35341.0 | 1708.95 |
| 35342.0 | 1710.79 |
| 35345.0 | 1712.03 |
| 35346.0 | 1714.22 |
| 35347.0 | 1710.64 |
| 35348.0 | 1700.19 |
| 35349.0 | 1701.25 |
| 35352.0 | 1704.06 |
| 35353.0 | 1723.12 |
| 35354.0 | 1714.92 |
| 35355.0 | 1718.44 |
| 35356.0 | 1734.83 |
| 35359.0 | 1734.44 |
| 35360.0 | 1741.5 |
| 35361.0 | 1724.32 |
| 35362.0 | 1720.07 |
| 35363.0 | 1719.42 |
| 35366.0 | 1725.65 |
| 35367.0 | 1704.83 |
| 35368.0 | 1698.65 |
| 35369.0 | 1700.54 |
| 35370.0 | 1702.07 |
| 35373.0 | 1697.24 |
| 35374.0 | 1720.3 |
| 35375.0 | 1738.32 |
| 35376.0 | 1735.62 |
| 35377.0 | 1742.08 |
| 35380.0 | 1737.84 |
| 35381.0 | 1749.75 |
| 35382.0 | 1756.94 |
| 35383.0 | 1764.12 |
| 35384.0 | 1774.15 |
| 35387.0 | 1768.38 |
| 35388.0 | 1773.49 |
| 35389.0 | 1773 |
| 35390.0 | 1770.72 |
| 35391.0 | 1783.62 |
| 35394.0 | 1788.27 |
| 35395.0 | 1798.65 |
| 35396.0 | 1784.3 |
| 35397.0 | 1799.9 |
| 35398.0 | 1817.95 |
| 35401.0 | 1825.15 |
| 35402.0 | 1836.59 |
| 35403.0 | 1823.51 |
| 35404.0 | 1830.76 |
| 35405.0 | 1780.95 |
| 35408.0 | 1804.8 |
| 35409.0 | 1810.43 |
| 35410.0 | 1781.06 |
| 35411.0 | 1784.2 |
| 35412.0 | 1761.6 |
| 35415.0 | 1791.28 |
| 35416.0 | 1778.59 |
| 35417.0 | 1795.03 |
| 35418.0 | 1816.01 |
| 35419.0 | 1833.99 |
| 35422.0 | 1836.26 |
| 35423.0 | 1836.31 |
| 35424.0 | 1833.04 |
| 35425.0 | 1839.58 |
| 35426.0 | 1845.66 |
| 35429.0 | 1859.1 |
| 35430.0 | 1850.32 |
| 35431.0 | 1853.78 |
| 35432.0 | 1824.52 |
| 35433.0 | 1845.79 |
| 35436.0 | 1853.82 |
| 35437.0 | 1854.75 |
| 35438.0 | 1874.47 |
| 35439.0 | 1880.96 |
| 35440.0 | 1898.34 |
| 35443.0 | 1923.44 |
| 35444.0 | 1941.9 |
| 35445.0 | 1943.9 |
| 35446.0 | 1959.29 |
| 35447.0 | 1967.86 |
| 35450.0 | 1972.72 |
| 35451.0 | 1961.12 |
| 35452.0 | 1991.18 |
| 35453.0 | 2000.68 |
| 35454.0 | 1977 |
| 35457.0 | 1975.98 |
| 35458.0 | 1983.83 |
| 35459.0 | 1969.12 |
| 35460.0 | 1987.84 |
| 35461.0 | 2005.36 |
| 35464.0 | 2004.32 |
| 35465.0 | 2006.61 |
| 35466.0 | 2035.49 |
| 35467.0 | 2038.2 |
| 35468.0 | 2056.83 |
| 35471.0 | 2064.99 |
| 35472.0 | 2057.73 |
| 35473.0 | 2071.1 |
| 35474.0 | 2088.21 |
| 35475.0 | 2097.42 |
| 35478.0 | 2102.12 |
| 35479.0 | 2107.17 |
| 35480.0 | 2098.1 |
| 35481.0 | 2086.06 |
| 35482.0 | 2070.45 |
| 35485.0 | 2069.43 |
| 35486.0 | 2096.81 |
| 35487.0 | 2088.77 |
| 35488.0 | 2099.8 |
| 35489.0 | 2077.22 |
| 35492.0 | 2080.42 |
| 35493.0 | 2111.36 |
| 35494.0 | 2122.98 |
| 35495.0 | 2150.21 |
| 35496.0 | 2142.99 |
| 35499.0 | 2162.2 |
| 35500.0 | 2169.71 |
| 35501.0 | 2143.17 |
| 35502.0 | 2133.95 |
| 35503.0 | 2139.65 |
| 35506.0 | 2124.55 |
| 35507.0 | 2095.49 |
| 35508.0 | 2099.91 |
| 35509.0 | 2068 |
| 35510.0 | 2090.88 |
| 35513.0 | 2080.93 |
| 35514.0 | 2108.68 |
| 35515.0 | 2133.6 |
| 35516.0 | 2141.51 |
| 35517.0 | 2142.45 |
| 35520.0 | 2137.28 |
| 35521.0 | 2063.22 |
| 35522.0 | 2056.63 |
| 35523.0 | 2026.91 |
| 35524.0 | 2031.61 |
| 35527.0 | 2072.15 |
| 35528.0 | 2077.81 |
| 35529.0 | 2100.7 |
| 35530.0 | 2091.17 |
| 35531.0 | 2080.82 |
| 35534.0 | 2059.07 |
| 35535.0 | 2100.96 |
| 35536.0 | 2108.24 |
| 35537.0 | 2120.31 |
| 35538.0 | 2104.84 |
| 35541.0 | 2108.25 |
| 35542.0 | 2108.48 |
| 35543.0 | 2134.76 |
| 35544.0 | 2135.01 |
| 35545.0 | 2123.99 |
| 35548.0 | 2111.6 |
| 35549.0 | 2142.84 |
| 35550.0 | 2164.68 |
| 35551.0 | 2175.5 |
| 35552.0 | 2175.52 |
| 35555.0 | 2204.66 |
| 35556.0 | 2213.29 |
| 35557.0 | 2205.71 |
| 35558.0 | 2206.78 |
| 35559.0 | 2218.99 |
| 35562.0 | 2243.84 |
| 35563.0 | 2252.52 |
| 35564.0 | 2264.28 |
| 35565.0 | 2260.64 |
| 35566.0 | 2267.46 |
| 35569.0 | 2266.3 |
| 35570.0 | 2228.67 |
| 35571.0 | 2281.58 |
| 35572.0 | 2267.18 |
| 35573.0 | 2274.95 |
| 35576.0 | 2280.76 |
| 35577.0 | 2288.31 |
| 35578.0 | 2262.02 |
| 35579.0 | 2256.07 |
| 35580.0 | 2220.86 |
| 35583.0 | 2250.77 |
| 35584.0 | 2262.72 |
| 35585.0 | 2275.62 |
| 35586.0 | 2288.6 |
| 35587.0 | 2310.55 |
| 35590.0 | 2314.58 |
| 35591.0 | 2305.01 |
| 35592.0 | 2316.53 |
| 35593.0 | 2346.73 |
| 35594.0 | 2369.86 |
| 35597.0 | 2373.32 |
| 35598.0 | 2355.68 |
| 35599.0 | 2359.91 |
| 35600.0 | 2370 |
| 35601.0 | 2386.13 |
| 35604.0 | 2384.72 |
| 35605.0 | 2389.28 |
| 35606.0 | 2426.34 |
| 35607.0 | 2438.38 |
| 35608.0 | 2431.73 |
| 35611.0 | 2398.41 |
| 35612.0 | 2445.8 |
| 35613.0 | 2452.79 |
| 35614.0 | 2491.58 |
| 35615.0 | 2509.09 |
| 35618.0 | 2531.84 |
| 35619.0 | 2520.46 |
| 35620.0 | 2544.62 |
| 35621.0 | 2512.98 |
| 35622.0 | 2542.17 |
| 35625.0 | 2554.05 |
| 35626.0 | 2546.57 |
| 35627.0 | 2598.19 |
| 35628.0 | 2601.8 |
| 35629.0 | 2558.56 |
| 35632.0 | 2516.79 |
| 35633.0 | 2578.77 |
| 35634.0 | 2645.05 |
| 35635.0 | 2619.17 |
| 35636.0 | 2640.14 |
| 35639.0 | 2660.13 |
| 35640.0 | 2638.05 |
| 35641.0 | 2674.56 |
| 35642.0 | 2674.83 |
| 35643.0 | 2656.32 |
| 35646.0 | 2614.82 |
| 35647.0 | 2618.3 |
| 35648.0 | 2667.77 |
| 35649.0 | 2699.78 |
| 35650.0 | 2654.07 |
| 35653.0 | 2625.86 |
| 35654.0 | 2645.81 |
| 35655.0 | 2578.11 |
| 35656.0 | 2558.3 |
| 35657.0 | 2503.46 |
| 35660.0 | 2508.04 |
| 35661.0 | 2549.74 |
| 35662.0 | 2589.14 |
| 35663.0 | 2581.93 |
| 35664.0 | 2515.62 |
| 35667.0 | 2513.53 |
| 35668.0 | 2466.54 |
| 35669.0 | 2467.04 |
| 35670.0 | 2438.6 |
| 35671.0 | 2407.58 |
| 35674.0 | 2439.92 |
| 35675.0 | 2514.53 |
| 35676.0 | 2537.65 |
| 35677.0 | 2521.34 |
| 35678.0 | 2533.35 |
| 35681.0 | 2528.14 |
| 35682.0 | 2512.4 |
| 35683.0 | 2478.75 |
| 35684.0 | 2434.49 |
| 35685.0 | 2409.42 |
| 35688.0 | 2430.24 |
| 35689.0 | 2473.76 |
| 35690.0 | 2500.16 |
| 35691.0 | 2506.79 |
| 35692.0 | 2511.17 |
| 35695.0 | 2558.1 |
| 35696.0 | 2546.6 |
| 35697.0 | 2561.21 |
| 35698.0 | 2556.23 |
| 35699.0 | 2555.21 |
| 35702.0 | 2551.87 |
| 35703.0 | 2581.36 |
| 35704.0 | 2608.01 |
| 35705.0 | 2609.64 |
| 35706.0 | 2641.68 |
| 35709.0 | 2635.67 |
| 35710.0 | 2628.43 |
| 35711.0 | 2625.44 |
| 35712.0 | 2550.22 |
| 35713.0 | 2534.48 |
| 35716.0 | 2582.03 |
| 35717.0 | 2584.02 |
| 35718.0 | 2567.53 |
| 35719.0 | 2544.6 |
| 35720.0 | 2508.15 |
| 35723.0 | 2502.42 |
| 35724.0 | 2546.57 |
| 35725.0 | 2537.55 |
| 35726.0 | 2444.06 |
| 35727.0 | 2450.3 |
| 35730.0 | 2371.39 |
| 35731.0 | 2241.21 |
| 35732.0 | 2370.94 |
| 35733.0 | 2330.44 |
| 35734.0 | 2331.25 |
| 35737.0 | 2392.17 |
| 35738.0 | 2368.23 |
| 35739.0 | 2386.78 |
| 35740.0 | 2362.16 |
| 35741.0 | 2300.25 |
| 35744.0 | 2319.53 |
| 35745.0 | 2309.75 |
| 35746.0 | 2281.01 |
| 35747.0 | 2303.29 |
| 35748.0 | 2313.77 |
| 35751.0 | 2369.83 |
| 35752.0 | 2382.46 |
| 35753.0 | 2369.87 |
| 35754.0 | 2418.67 |
| 35755.0 | 2448.63 |
| 35758.0 | 2385.77 |
| 35759.0 | 2386.28 |
| 35760.0 | 2412.67 |
| 35761.0 | 2423.99 |
| 35762.0 | 2423.74 |
| 35765.0 | 2482.43 |
| 35766.0 | 2489.56 |
| 35767.0 | 2475.79 |
| 35768.0 | 2498.54 |
| 35769.0 | 2503.93 |
| 35772.0 | 2525.86 |
| 35773.0 | 2521.96 |
| 35774.0 | 2481.39 |
| 35775.0 | 2420.75 |
| 35776.0 | 2432.06 |
| 35779.0 | 2439.14 |
| 35780.0 | 2488.89 |
| 35781.0 | 2502.96 |
| 35782.0 | 2485.06 |
| 35783.0 | 2420.83 |
| 35786.0 | 2429.42 |
| 35787.0 | 2435.84 |
| 35788.0 | 2440.93 |
| 35789.0 | 2438.12 |
| 35790.0 | 2439.15 |
| 35793.0 | 2498.93 |
| 35794.0 | 2528.77 |
| 35795.0 | 2531.99 |
| 35796.0 | 2532.01 |
| 35797.0 | 2575 |
| 35800.0 | 2616.8 |
| 35801.0 | 2591.05 |
| 35802.0 | 2588.56 |
| 35803.0 | 2562.42 |
| 35804.0 | 2527.59 |
| 35807.0 | 2466.81 |
| 35808.0 | 2508.36 |
| 35809.0 | 2524.47 |
| 35810.0 | 2524.59 |
| 35811.0 | 2553.34 |
| 35814.0 | 2576.53 |
| 35815.0 | 2593.95 |
| 35816.0 | 2585.15 |
| 35817.0 | 2565.88 |
| 35818.0 | 2545.09 |
| 35821.0 | 2570.85 |
| 35822.0 | 2603.16 |
| 35823.0 | 2643.21 |
| 35824.0 | 2664.66 |
| 35825.0 | 2676.03 |
| 35828.0 | 2694.29 |
| 35829.0 | 2698.07 |
| 35830.0 | 2682.6 |
| 35831.0 | 2708.33 |
| 35832.0 | 2719.19 |
| 35835.0 | 2724.07 |
| 35836.0 | 2721.88 |
| 35837.0 | 2746.36 |
| 35838.0 | 2713.24 |
| 35839.0 | 2717.35 |
| 35842.0 | 2744.34 |
| 35843.0 | 2795.88 |
| 35844.0 | 2796.52 |
| 35845.0 | 2779.69 |
| 35846.0 | 2785.22 |
| 35849.0 | 2798.66 |
| 35850.0 | 2801.52 |
| 35851.0 | 2861.65 |
| 35852.0 | 2875.61 |
| 35853.0 | 2878.04 |
| 35856.0 | 2929.02 |
| 35857.0 | 2908.59 |
| 35858.0 | 2878.59 |
| 35859.0 | 2863.18 |
| 35860.0 | 2930.86 |
| 35863.0 | 2962.52 |
| 35864.0 | 2959.09 |
| 35865.0 | 2974.45 |
| 35866.0 | 2967.95 |
| 35867.0 | 2999.97 |
| 35870.0 | 3029.49 |
| 35871.0 | 3053.96 |
| 35872.0 | 3035.43 |
| 35873.0 | 3048.63 |
| 35874.0 | 3086.08 |
| 35877.0 | 3111.1 |
| 35878.0 | 3143.37 |
| 35879.0 | 3179.72 |
| 35880.0 | 3135.27 |
| 35881.0 | 3150.9 |
| 35884.0 | 3137.03 |
| 35885.0 | 3153.32 |
| 35886.0 | 3196.05 |
| 35887.0 | 3230.54 |
| 35888.0 | 3268.7 |
| 35891.0 | 3345.86 |
| 35892.0 | 3286.69 |
| 35893.0 | 3253.58 |
| 35894.0 | 3264.15 |
| 35899.0 | 3283.05 |
| 35900.0 | 3289.71 |
| 35901.0 | 3251.87 |
| 35902.0 | 3267.75 |
| 35905.0 | 3298.98 |
| 35906.0 | 3294.93 |
| 35907.0 | 3272.2 |
| 35908.0 | 3226.14 |
| 35909.0 | 3174.18 |
| 35912.0 | 3061.04 |
| 35913.0 | 3153.55 |
| 35914.0 | 3118.37 |
| 35915.0 | 3195.43 |
| 35919.0 | 3309.96 |
| 35920.0 | 3261.38 |
| 35921.0 | 3262.55 |
| 35922.0 | 3216.03 |
| 35923.0 | 3255.78 |
| 35926.0 | 3327.92 |
| 35927.0 | 3290.86 |
| 35928.0 | 3304.42 |
| 35929.0 | 3305.41 |
| 35930.0 | 3304.69 |
| 35933.0 | 3253.33 |
| 35934.0 | 3313.72 |
| 35935.0 | 3352.25 |
| 35937.0 | 3371.39 |
| 35940.0 | 3422.42 |
| 35941.0 | 3424.55 |
| 35942.0 | 3340.51 |
| 35943.0 | 3338.8 |
| 35944.0 | 3357.77 |
| 35948.0 | 3368.29 |
| 35949.0 | 3399.22 |
| 35950.0 | 3375.03 |
| 35951.0 | 3421.55 |
| 35954.0 | 3443.76 |
| 35955.0 | 3415.77 |
| 35956.0 | 3424.65 |
| 35957.0 | 3393.76 |
| 35958.0 | 3303.01 |
| 35961.0 | 3253.91 |
| 35962.0 | 3269.06 |
| 35963.0 | 3330.55 |
| 35964.0 | 3291.14 |
| 35965.0 | 3258.16 |
| 35968.0 | 3252.12 |
| 35969.0 | 3309.48 |
| 35970.0 | 3330.29 |
| 35971.0 | 3391.88 |
| 35972.0 | 3395.41 |
| 35975.0 | 3431.06 |
| 35976.0 | 3406.82 |
| 35977.0 | 3464.96 |
| 35978.0 | 3471.65 |
| 35979.0 | 3506.45 |
| 35982.0 | 3518.79 |
| 35983.0 | 3530.93 |
| 35984.0 | 3553.07 |
| 35985.0 | 3542.2 |
| 35986.0 | 3532.65 |
| 35989.0 | 3551.74 |
| 35990.0 | 3576.68 |
| 35991.0 | 3602.83 |
| 35992.0 | 3613.4 |
| 35993.0 | 3658.48 |
| 35996.0 | 3670.82 |
| 35997.0 | 3649.96 |
| 35998.0 | 3582.12 |
| 35999.0 | 3582.16 |
| 36000.0 | 3570.67 |
| 36003.0 | 3512.62 |
| 36004.0 | 3499.87 |
| 36005.0 | 3494.53 |
| 36006.0 | 3529.5 |
| 36007.0 | 3480.63 |
| 36010.0 | 3422.75 |
| 36011.0 | 3412.66 |
| 36012.0 | 3344.15 |
| 36013.0 | 3290.5 |
| 36014.0 | 3348.61 |
| 36017.0 | 3282.7 |
| 36018.0 | 3187.44 |
| 36019.0 | 3248.14 |
| 36020.0 | 3240.83 |
| 36021.0 | 3284.47 |
| 36024.0 | 3277.21 |
| 36025.0 | 3389.88 |
| 36026.0 | 3400.07 |
| 36027.0 | 3349.23 |
| 36028.0 | 3209.05 |
| 36031.0 | 3202.96 |
| 36032.0 | 3282.91 |
| 36033.0 | 3186.77 |
| 36034.0 | 3063.83 |
| 36035.0 | 3009.74 |
| 36038.0 | 2978.12 |
| 36039.0 | 2950.01 |
| 36040.0 | 3035.73 |
| 36041.0 | 2971.38 |
| 36042.0 | 3003.66 |
| 36045.0 | 3038.09 |
| 36046.0 | 3105.31 |
| 36047.0 | 3051.49 |
| 36048.0 | 2903.71 |
| 36049.0 | 2890.98 |
| 36052.0 | 2968.55 |
| 36053.0 | 2947.01 |
| 36054.0 | 2971.83 |
| 36055.0 | 2826.22 |
| 36056.0 | 2781.69 |
| 36059.0 | 2658.27 |
| 36060.0 | 2726.32 |
| 36061.0 | 2820.29 |
| 36062.0 | 2789.07 |
| 36063.0 | 2743.04 |
| 36066.0 | 2785.63 |
| 36067.0 | 2760.26 |
| 36068.0 | 2670.97 |
| 36069.0 | 2533.07 |
| 36070.0 | 2488.59 |
| 36073.0 | 2445.89 |
| 36074.0 | 2586.69 |
| 36075.0 | 2541.08 |
| 36076.0 | 2419.23 |
| 36077.0 | 2469.87 |
| 36080.0 | 2628.44 |
| 36081.0 | 2674.13 |
| 36082.0 | 2742.95 |
| 36083.0 | 2741.34 |
| 36084.0 | 2780.89 |
| 36087.0 | 2779.79 |
| 36088.0 | 2863.89 |
| 36089.0 | 2818.18 |
| 36090.0 | 2797.33 |
| 36091.0 | 2806.22 |
| 36094.0 | 2829.55 |
| 36095.0 | 2910.1 |
| 36096.0 | 2845.3 |
| 36097.0 | 2832.82 |
| 36098.0 | 2887.11 |
| 36101.0 | 2952.04 |
| 36102.0 | 2952.23 |
| 36103.0 | 3030.34 |
| 36104.0 | 2975.7 |
| 36105.0 | 2972.25 |
| 36108.0 | 2957.79 |
| 36109.0 | 2918.94 |
| 36110.0 | 2935.14 |
| 36111.0 | 2929.19 |
| 36112.0 | 2924.97 |
| 36115.0 | 3000.97 |
| 36116.0 | 2982.07 |
| 36117.0 | 2974.98 |
| 36118.0 | 3049.68 |
| 36119.0 | 3133.49 |
| 36122.0 | 3194.17 |
| 36123.0 | 3163.88 |
| 36124.0 | 3167.24 |
| 36125.0 | 3230.34 |
| 36126.0 | 3261.19 |
| 36129.0 | 3179.09 |
| 36130.0 | 3056.11 |
| 36131.0 | 3017.89 |
| 36132.0 | 3064.55 |
| 36133.0 | 3079.64 |
| 36136.0 | 3095.55 |
| 36137.0 | 3102.99 |
| 36138.0 | 3111.96 |
| 36139.0 | 3106.59 |
| 36140.0 | 3048.92 |
| 36143.0 | 3045.14 |
| 36144.0 | 3069.72 |
| 36145.0 | 3114.53 |
| 36146.0 | 3148.97 |
| 36147.0 | 3123.38 |
| 36150.0 | 3225.6 |
| 36151.0 | 3248.07 |
| 36152.0 | 3301.32 |
| 36157.0 | 3331.51 |
| 36158.0 | 3354.71 |
| 36159.0 | 3342.32 |
| 36160.0 | 3342.32 |
| 36164.0 | 3543.1 |
| 36165.0 | 3604.67 |
| 36166.0 | 3685.36 |
| 36167.0 | 3627.87 |
| 36168.0 | 3616.57 |
| 36171.0 | 3546.4 |
| 36172.0 | 3502.38 |
| 36173.0 | 3336.45 |
| 36174.0 | 3365.43 |
| 36175.0 | 3426.06 |
| 36178.0 | 3515.43 |
| 36179.0 | 3515.69 |
| 36180.0 | 3601.36 |
| 36181.0 | 3561.56 |
| 36182.0 | 3426.11 |
| 36185.0 | 3428.8 |
| 36186.0 | 3433.87 |
| 36187.0 | 3453.7 |
| 36188.0 | 3511.31 |
| 36189.0 | 3547.15 |
| 36192.0 | 3597.04 |
| 36193.0 | 3541.43 |
| 36194.0 | 3488.13 |
| 36195.0 | 3487.08 |
| 36196.0 | 3489.98 |
| 36199.0 | 3462.29 |
| 36200.0 | 3342.58 |
| 36201.0 | 3325.56 |
| 36202.0 | 3375.42 |
| 36203.0 | 3405.68 |
| 36206.0 | 3414.97 |
| 36207.0 | 3402.21 |
| 36208.0 | 3343.04 |
| 36209.0 | 3380.58 |
| 36210.0 | 3415.52 |
| 36213.0 | 3470.89 |
| 36214.0 | 3537.81 |
| 36215.0 | 3556.69 |
| 36216.0 | 3496.27 |
| 36217.0 | 3484.24 |
| 36220.0 | 3441.74 |
| 36221.0 | 3451.18 |
| 36222.0 | 3393.95 |
| 36223.0 | 3434.49 |
| 36224.0 | 3536.64 |
| 36227.0 | 3495.43 |
| 36228.0 | 3493.54 |
| 36229.0 | 3485.05 |
| 36230.0 | 3521.63 |
| 36231.0 | 3574.73 |
| 36234.0 | 3582.78 |
| 36235.0 | 3606.67 |
| 36236.0 | 3589.16 |
| 36237.0 | 3579.21 |
| 36238.0 | 3633.05 |
| 36241.0 | 3607.82 |
| 36242.0 | 3520.64 |
| 36243.0 | 3472.44 |
| 36244.0 | 3528.43 |
| 36245.0 | 3488.15 |
| 36248.0 | 3536.62 |
| 36249.0 | 3523.24 |
| 36250.0 | 3559.86 |
| 36251.0 | 3573.6 |
| 36252.0 | 3573.6 |
| 36256.0 | 3644.76 |
| 36257.0 | 3659.41 |
| 36258.0 | 3669.21 |
| 36259.0 | 3689.61 |
| 36262.0 | 3690.16 |
| 36263.0 | 3725.4 |
| 36264.0 | 3699.33 |
| 36265.0 | 3652.06 |
| 36266.0 | 3655.15 |
| 36269.0 | 3705.63 |
| 36270.0 | 3613.96 |
| 36271.0 | 3643.26 |
| 36272.0 | 3676.61 |
| 36273.0 | 3662.31 |
| 36276.0 | 3678.37 |
| 36277.0 | 3756.2 |
| 36278.0 | 3743.49 |
| 36279.0 | 3735.91 |
| 36280.0 | 3757.87 |
| 36283.0 | 3776.39 |
| 36284.0 | 3775.33 |
| 36285.0 | 3716.13 |
| 36286.0 | 3700.37 |
| 36287.0 | 3683.34 |
| 36290.0 | 3693.41 |
| 36291.0 | 3702.38 |
| 36292.0 | 3679.45 |
| 36293.0 | 3693.62 |
| 36294.0 | 3643.82 |
| 36297.0 | 3574.13 |
| 36298.0 | 3608.77 |
| 36299.0 | 3653 |
| 36300.0 | 3684.21 |
| 36301.0 | 3691.31 |
| 36305.0 | 3634.4 |
| 36306.0 | 3643.9 |
| 36307.0 | 3587.16 |
| 36308.0 | 3602.45 |
| 36311.0 | 3629.46 |
| 36312.0 | 3610.59 |
| 36313.0 | 3615.54 |
| 36314.0 | 3650.98 |
| 36315.0 | 3671.42 |
| 36318.0 | 3717.94 |
| 36319.0 | 3721.67 |
| 36320.0 | 3739.07 |
| 36321.0 | 3706.76 |
| 36322.0 | 3749.67 |
| 36325.0 | 3735.77 |
| 36326.0 | 3742.88 |
| 36327.0 | 3780.6 |
| 36328.0 | 3806.55 |
| 36329.0 | 3822.89 |
| 36332.0 | 3867.89 |
| 36333.0 | 3857.06 |
| 36334.0 | 3828.79 |
| 36335.0 | 3779.39 |
| 36336.0 | 3739.81 |
| 36339.0 | 3766.49 |
| 36340.0 | 3787.49 |
| 36341.0 | 3788.66 |
| 36342.0 | 3865.54 |
| 36343.0 | 3888.11 |
| 36346.0 | 3971.84 |
| 36347.0 | 3968.99 |
| 36348.0 | 3950.49 |
| 36349.0 | 3951 |
| 36350.0 | 3962.42 |
| 36353.0 | 3962.35 |
| 36354.0 | 3905.52 |
| 36355.0 | 3922.49 |
| 36356.0 | 3960.67 |
| 36357.0 | 3952.2 |
| 36360.0 | 3946.4 |
| 36361.0 | 3856.65 |
| 36362.0 | 3798.69 |
| 36363.0 | 3762.34 |
| 36364.0 | 3723.55 |
| 36367.0 | 3676.91 |
| 36368.0 | 3687.58 |
| 36369.0 | 3684.64 |
| 36370.0 | 3580.19 |
| 36371.0 | 3638.62 |
| 36374.0 | 3633.44 |
| 36375.0 | 3614.05 |
| 36376.0 | 3590.69 |
| 36377.0 | 3512.71 |
| 36378.0 | 3525.47 |
| 36381.0 | 3585.58 |
| 36382.0 | 3535.1 |
| 36383.0 | 3551.39 |
| 36384.0 | 3640.44 |
| 36385.0 | 3710.57 |
| 36388.0 | 3724.68 |
| 36389.0 | 3747.89 |
| 36390.0 | 3738.83 |
| 36391.0 | 3679.48 |
| 36392.0 | 3715.39 |
| 36395.0 | 3752.59 |
| 36396.0 | 3781.3 |
| 36397.0 | 3856.72 |
| 36398.0 | 3852.53 |
| 36399.0 | 3853.48 |
| 36402.0 | 3837.7 |
| 36403.0 | 3769.14 |
| 36404.0 | 3795.62 |
| 36405.0 | 3718.37 |
| 36406.0 | 3809.11 |
| 36409.0 | 3842.59 |
| 36410.0 | 3834.34 |
| 36411.0 | 3827.07 |
| 36412.0 | 3858.15 |
| 36413.0 | 3887.09 |
| 36416.0 | 3858.01 |
| 36417.0 | 3825.86 |
| 36418.0 | 3816.53 |
| 36419.0 | 3775.24 |
| 36420.0 | 3748.75 |
| 36423.0 | 3782.02 |
| 36424.0 | 3731.96 |
| 36425.0 | 3713.41 |
| 36426.0 | 3750.49 |
| 36427.0 | 3688.79 |
| 36430.0 | 3727.93 |
| 36431.0 | 3673.4 |
| 36432.0 | 3666.99 |
| 36433.0 | 3669.71 |
| 36434.0 | 3642.34 |
| 36437.0 | 3695.09 |
| 36438.0 | 3731.23 |
| 36439.0 | 3752.79 |
| 36440.0 | 3785.24 |
| 36441.0 | 3784.32 |
| 36444.0 | 3789.89 |
| 36445.0 | 3756.44 |
| 36446.0 | 3724.4 |
| 36447.0 | 3695.77 |
| 36448.0 | 3638.82 |
| 36451.0 | 3607.72 |
| 36452.0 | 3691.34 |
| 36453.0 | 3699.15 |
| 36454.0 | 3691.66 |
| 36455.0 | 3778.61 |
| 36458.0 | 3757.7 |
| 36459.0 | 3796.72 |
| 36460.0 | 3786.07 |
| 36461.0 | 3866.75 |
| 36462.0 | 3922.91 |
| 36465.0 | 3913.89 |
| 36466.0 | 3923.14 |
| 36467.0 | 3955.95 |
| 36468.0 | 3994.54 |
| 36469.0 | 4014.08 |
| 36472.0 | 4024.55 |
| 36473.0 | 4039.47 |
| 36474.0 | 4076.96 |
| 36475.0 | 4140.58 |
| 36476.0 | 4133.93 |
| 36479.0 | 4199.86 |
| 36480.0 | 4220.85 |
| 36481.0 | 4221.36 |
| 36482.0 | 4288.14 |
| 36483.0 | 4292.4 |
| 36486.0 | 4212.8 |
| 36487.0 | 4225.9 |
| 36488.0 | 4238.34 |
| 36489.0 | 4343.22 |
| 36490.0 | 4380.77 |
| 36493.0 | 4364.32 |
| 36494.0 | 4314.38 |
| 36495.0 | 4340.7 |
| 36496.0 | 4336.42 |
| 36497.0 | 4449.47 |
| 36500.0 | 4458.76 |
| 36501.0 | 4509.37 |
| 36502.0 | 4491.35 |
| 36503.0 | 4498.75 |
| 36504.0 | 4458.04 |
| 36507.0 | 4474.2 |
| 36508.0 | 4510.99 |
| 36509.0 | 4482.19 |
| 36510.0 | 4517.68 |
| 36511.0 | 4538.23 |
| 36514.0 | 4583.02 |
| 36515.0 | 4566.87 |
| 36516.0 | 4632.56 |
| 36517.0 | 4752.96 |
| 36518.0 | 4781.16 |
| 36521.0 | 4785.17 |
| 36522.0 | 4788.7 |
| 36523.0 | 4807.01 |
| 36524.0 | 4904.46 |
| 36525.0 | 4904.46 |
| 36528.0 | 4849.22 |
| 36529.0 | 4657.83 |
| 36530.0 | 4541.75 |
| 36531.0 | 4500.69 |
| 36532.0 | 4648.27 |
| 36535.0 | 4714.03 |
| 36536.0 | 4671.5 |
| 36537.0 | 4649.3 |
| 36538.0 | 4688.35 |
| 36539.0 | 4829.36 |
| 36542.0 | 4884.5 |
| 36543.0 | 4761 |
| 36544.0 | 4768.37 |
| 36545.0 | 4778.71 |
| 36546.0 | 4719.29 |
| 36549.0 | 4718.76 |
| 36550.0 | 4653.61 |
| 36551.0 | 4721.03 |
| 36552.0 | 4786.82 |
| 36553.0 | 4781.94 |
| 36556.0 | 4684.48 |
| 36557.0 | 4792.04 |
| 36558.0 | 4902.12 |
| 36559.0 | 5046.12 |
| 36560.0 | 5119.79 |
| 36563.0 | 5041.08 |
| 36564.0 | 5176.17 |
| 36565.0 | 5191.79 |
| 36566.0 | 5174.35 |
| 36567.0 | 5195.67 |
| 36570.0 | 5166.08 |
| 36571.0 | 5043.33 |
| 36572.0 | 5063.73 |
| 36573.0 | 5114.47 |
| 36574.0 | 5079.59 |
| 36577.0 | 5033.33 |
| 36578.0 | 5024.05 |
| 36579.0 | 5086 |
| 36580.0 | 5117.41 |
| 36581.0 | 5208.87 |
| 36584.0 | 5126.33 |
| 36585.0 | 5182.62 |
| 36586.0 | 5235.14 |
| 36587.0 | 5406.37 |
| 36588.0 | 5450.22 |
| 36591.0 | 5464.43 |
| 36592.0 | 5426.36 |
| 36593.0 | 5364.52 |
| 36594.0 | 5352.88 |
| 36595.0 | 5416.81 |
| 36598.0 | 5254.41 |
| 36599.0 | 5258.32 |
| 36600.0 | 5083.15 |
| 36601.0 | 5175.23 |
| 36602.0 | 5231.35 |
| 36605.0 | 5286.71 |
| 36606.0 | 5266.23 |
| 36607.0 | 5268.35 |
| 36608.0 | 5259.15 |
| 36609.0 | 5379.75 |
| 36612.0 | 5369.11 |
| 36613.0 | 5426.57 |
| 36614.0 | 5416.32 |
| 36615.0 | 5251.97 |
| 36616.0 | 5249.55 |
| 36619.0 | 5118.37 |
| 36620.0 | 5176.71 |
| 36621.0 | 5044.17 |
| 36622.0 | 5179.96 |
| 36623.0 | 5259.52 |
| 36626.0 | 5282.26 |
| 36627.0 | 5174.38 |
| 36628.0 | 5179.28 |
| 36629.0 | 5181.33 |
| 36630.0 | 5034.25 |
| 36633.0 | 4979.66 |
| 36634.0 | 5061.9 |
| 36635.0 | 5078.69 |
| 36636.0 | 5117.78 |
| 36641.0 | 5158.13 |
| 36642.0 | 5245.11 |
| 36643.0 | 5171.96 |
| 36644.0 | 5303.95 |
| 36648.0 | 5434.81 |
| 36649.0 | 5316.94 |
| 36650.0 | 5306.32 |
| 36651.0 | 5351.71 |
| 36654.0 | 5285.09 |
| 36655.0 | 5182.73 |
| 36656.0 | 5065.85 |
| 36657.0 | 5171.77 |
| 36658.0 | 5238.42 |
| 36661.0 | 5182.68 |
| 36662.0 | 5335.02 |
| 36663.0 | 5230.74 |
| 36664.0 | 5247.13 |
| 36665.0 | 5063.46 |
| 36668.0 | 4945.17 |
| 36669.0 | 4984.7 |
| 36670.0 | 4903.92 |
| 36671.0 | 5018.79 |
| 36672.0 | 5007.97 |
| 36675.0 | 5084.69 |
| 36676.0 | 5156.07 |
| 36677.0 | 5200.89 |
| 36678.0 | 5275.2 |
| 36679.0 | 5428.27 |
| 36682.0 | 5379.6 |
| 36683.0 | 5325.87 |
| 36684.0 | 5272.37 |
| 36685.0 | 5286.74 |
| 36686.0 | 5292.97 |
| 36689.0 | 5294.65 |
| 36690.0 | 5305.34 |
| 36691.0 | 5379.57 |
| 36692.0 | 5338.49 |
| 36693.0 | 5281.57 |
| 36696.0 | 5271.82 |
| 36697.0 | 5312.13 |
| 36698.0 | 5253.3 |
| 36699.0 | 5231.93 |
| 36700.0 | 5240.58 |
| 36703.0 | 5235.39 |
| 36704.0 | 5209.53 |
| 36705.0 | 5229.17 |
| 36706.0 | 5061.63 |
| 36707.0 | 5145.35 |
| 36710.0 | 5187.01 |
| 36711.0 | 5185.87 |
| 36712.0 | 5166.25 |
| 36713.0 | 5152.38 |
| 36714.0 | 5251.65 |
| 36717.0 | 5263.97 |
| 36718.0 | 5231.33 |
| 36719.0 | 5249.15 |
| 36720.0 | 5299.54 |
| 36721.0 | 5320.06 |
| 36724.0 | 5357.19 |
| 36725.0 | 5314.95 |
| 36726.0 | 5294.76 |
| 36727.0 | 5316.51 |
| 36728.0 | 5238.02 |
| 36731.0 | 5237.95 |
| 36732.0 | 5212.83 |
| 36733.0 | 5222.83 |
| 36734.0 | 5097.41 |
| 36735.0 | 5061.83 |
| 36738.0 | 5122.8 |
| 36739.0 | 5104.23 |
| 36740.0 | 5091.86 |
| 36741.0 | 4995.82 |
| 36742.0 | 5049.45 |
| 36745.0 | 5088.41 |
| 36746.0 | 5105.52 |
| 36747.0 | 5158.12 |
| 36748.0 | 5182.06 |
| 36749.0 | 5179.68 |
| 36752.0 | 5218.59 |
| 36753.0 | 5203.14 |
| 36754.0 | 5223.7 |
| 36755.0 | 5192.06 |
| 36756.0 | 5180.7 |
| 36759.0 | 5165.44 |
| 36760.0 | 5161.42 |
| 36761.0 | 5160.14 |
| 36762.0 | 5123.99 |
| 36763.0 | 5175.65 |
| 36766.0 | 5204.18 |
| 36767.0 | 5188.93 |
| 36768.0 | 5166.91 |
| 36769.0 | 5175.12 |
| 36770.0 | 5298.64 |
| 36773.0 | 5392.63 |
| 36774.0 | 5326.69 |
| 36775.0 | 5299.24 |
| 36776.0 | 5329.06 |
| 36777.0 | 5229.04 |
| 36780.0 | 5233.87 |
| 36781.0 | 5222.37 |
| 36782.0 | 5153.2 |
| 36783.0 | 5204.62 |
| 36784.0 | 5199.14 |
| 36787.0 | 5129.43 |
| 36788.0 | 5117.15 |
| 36789.0 | 5051.4 |
| 36790.0 | 4941.06 |
| 36791.0 | 4945.37 |
| 36794.0 | 4984.29 |
| 36795.0 | 4934.89 |
| 36796.0 | 4949.87 |
| 36797.0 | 4934.08 |
| 36798.0 | 4915.18 |
| 36801.0 | 4961.88 |
| 36802.0 | 5003.46 |
| 36803.0 | 4959.41 |
| 36804.0 | 4997.25 |
| 36805.0 | 4958.37 |
| 36808.0 | 4844.44 |
| 36809.0 | 4867.33 |
| 36810.0 | 4743.47 |
| 36811.0 | 4747.87 |
| 36812.0 | 4782.74 |
| 36815.0 | 4793.14 |
| 36816.0 | 4760.92 |
| 36817.0 | 4658.85 |
| 36818.0 | 4836.86 |
| 36819.0 | 4889.51 |
| 36822.0 | 4906.67 |
| 36823.0 | 5031.03 |
| 36824.0 | 4977.07 |
| 36825.0 | 4926.36 |
| 36826.0 | 4965.92 |
| 36829.0 | 4981.38 |
| 36830.0 | 5057.46 |
| 36831.0 | 5085.47 |
| 36832.0 | 5092.63 |
| 36833.0 | 5101.4 |
| 36836.0 | 5091.25 |
| 36837.0 | 5076.8 |
| 36838.0 | 5055.05 |
| 36839.0 | 5017.69 |
| 36840.0 | 4934.47 |
| 36843.0 | 4847.46 |
| 36844.0 | 5011.12 |
| 36845.0 | 5053.48 |
| 36846.0 | 5010.65 |
| 36847.0 | 4961.54 |
| 36850.0 | 4849.33 |
| 36851.0 | 4893.95 |
| 36852.0 | 4783.35 |
| 36853.0 | 4837.48 |
| 36854.0 | 4940.22 |
| 36857.0 | 4945.34 |
| 36858.0 | 4893.46 |
| 36859.0 | 4907.61 |
| 36860.0 | 4781.43 |
| 36861.0 | 4839.27 |
| 36864.0 | 4734.72 |
| 36865.0 | 4911.93 |
| 36866.0 | 4869.48 |
| 36867.0 | 4900.6 |
| 36868.0 | 4889.72 |
| 36871.0 | 4970.66 |
| 36872.0 | 4947.72 |
| 36873.0 | 4890.16 |
| 36874.0 | 4810.94 |
| 36875.0 | 4718 |
| 36878.0 | 4744.26 |
| 36879.0 | 4814.64 |
| 36880.0 | 4641.15 |
| 36881.0 | 4614.24 |
| 36882.0 | 4655.87 |
| 36887.0 | 4721.49 |
| 36888.0 | 4770.9 |
| 36889.0 | 4772.39 |
| 36893.0 | 4701.68 |
| 36894.0 | 4660.48 |
| 36895.0 | 4752.71 |
| 36896.0 | 4734.48 |
| 36899.0 | 4711.31 |
| 36900.0 | 4641.79 |
| 36901.0 | 4598.82 |
| 36902.0 | 4686.88 |
| 36903.0 | 4737.95 |
| 36906.0 | 4763.53 |
| 36907.0 | 4693.82 |
| 36908.0 | 4787.45 |
| 36909.0 | 4754.97 |
| 36910.0 | 4720.03 |
| 36913.0 | 4743.39 |
| 36914.0 | 4743.93 |
| 36915.0 | 4773.26 |
| 36916.0 | 4779.35 |
| 36917.0 | 4760.2 |
| 36920.0 | 4757.09 |
| 36921.0 | 4726.65 |
| 36922.0 | 4779.9 |
| 36923.0 | 4709.19 |
| 36924.0 | 4665.19 |
| 36927.0 | 4668.57 |
| 36928.0 | 4706.83 |
| 36929.0 | 4634.42 |
| 36930.0 | 4653.17 |
| 36931.0 | 4583.76 |
| 36934.0 | 4628.17 |
| 36935.0 | 4629.67 |
| 36936.0 | 4556.49 |
| 36937.0 | 4607.64 |
| 36938.0 | 4519.95 |
| 36941.0 | 4516.31 |
| 36942.0 | 4481.04 |
| 36943.0 | 4412.76 |
| 36944.0 | 4345.1 |
| 36945.0 | 4236.82 |
| 36948.0 | 4310.14 |
| 36949.0 | 4333.32 |
| 36950.0 | 4318.88 |
| 36951.0 | 4282.9 |
| 36952.0 | 4300.35 |
| 36955.0 | 4347.4 |
| 36956.0 | 4412.11 |
| 36957.0 | 4413.62 |
| 36958.0 | 4370.56 |
| 36959.0 | 4334.23 |
| 36962.0 | 4218.14 |
| 36963.0 | 4184.15 |
| 36964.0 | 4123.97 |
| 36965.0 | 4200.08 |
| 36966.0 | 4106.79 |
| 36969.0 | 4085.53 |
| 36970.0 | 4158.42 |
| 36971.0 | 4067.26 |
| 36972.0 | 3891.49 |
| 36973.0 | 4002.56 |
| 36976.0 | 4143.85 |
| 36977.0 | 4229.81 |
| 36978.0 | 4157.55 |
| 36979.0 | 4165.75 |
| 36980.0 | 4185 |
| 36983.0 | 4190.8 |
| 36984.0 | 4039.16 |
| 36985.0 | 4062.12 |
| 36986.0 | 4158.19 |
| 36987.0 | 4145.85 |
| 36990.0 | 4204.13 |
| 36991.0 | 4305.96 |
| 36992.0 | 4329.23 |
| 36993.0 | 4338.12 |
| 36998.0 | 4293.51 |
| 36999.0 | 4441.58 |
| 37000.0 | 4420.55 |
| 37001.0 | 4383.59 |
| 37004.0 | 4331.54 |
| 37005.0 | 4372.41 |
| 37006.0 | 4363.11 |
| 37007.0 | 4405.39 |
| 37008.0 | 4473.96 |
| 37011.0 | 4525.01 |
| 37012.0 | 4526.97 |
| 37013.0 | 4494.71 |
| 37014.0 | 4401.57 |
| 37015.0 | 4416.79 |
| 37018.0 | 4479.9 |
| 37019.0 | 4441.86 |
| 37020.0 | 4415.99 |
| 37021.0 | 4519.04 |
| 37022.0 | 4479.9 |
| 37025.0 | 4426.78 |
| 37026.0 | 4453.95 |
| 37027.0 | 4449.61 |
| 37028.0 | 4504.26 |
| 37029.0 | 4546.41 |
| 37032.0 | 4558.76 |
| 37033.0 | 4582.07 |
| 37034.0 | 4535.97 |
| 37035.0 | 4561.38 |
| 37036.0 | 4498.11 |
| 37039.0 | 4512.6 |
| 37040.0 | 4477.95 |
| 37041.0 | 4413.37 |
| 37042.0 | 4426.24 |
| 37043.0 | 4414.95 |
| 37046.0 | 4432.65 |
| 37047.0 | 4493.93 |
| 37048.0 | 4468.95 |
| 37049.0 | 4450.41 |
| 37050.0 | 4450.97 |
| 37053.0 | 4424.92 |
| 37054.0 | 4289.07 |
| 37055.0 | 4336 |
| 37056.0 | 4282.1 |
| 37057.0 | 4236.9 |
| 37060.0 | 4168.95 |
| 37061.0 | 4195.43 |
| 37062.0 | 4175.88 |
| 37063.0 | 4174.06 |
| 37064.0 | 4194.96 |
| 37067.0 | 4211.77 |
| 37068.0 | 4143.75 |
| 37069.0 | 4124.24 |
| 37070.0 | 4169.49 |
| 37071.0 | 4243.91 |
| 37074.0 | 4304.44 |
| 37075.0 | 4243.8 |
| 37076.0 | 4214.62 |
| 37077.0 | 4185.47 |
| 37078.0 | 4076.47 |
| 37081.0 | 4077.86 |
| 37082.0 | 4032.97 |
| 37083.0 | 3974.64 |
| 37084.0 | 4010.85 |
| 37085.0 | 4044.42 |
| 37088.0 | 4011.59 |
| 37089.0 | 3996.05 |
| 37090.0 | 3911.3 |
| 37091.0 | 3991.08 |
| 37092.0 | 3947.49 |
| 37095.0 | 3977.18 |
| 37096.0 | 3930.11 |
| 37097.0 | 3860.7 |
| 37098.0 | 3915.62 |
| 37099.0 | 3986.48 |
| 37102.0 | 4047.66 |
| 37103.0 | 4091.38 |
| 37104.0 | 4092.22 |
| 37105.0 | 4066.43 |
| 37106.0 | 4024.9 |
| 37109.0 | 4044.29 |
| 37110.0 | 4042.71 |
| 37111.0 | 3972.98 |
| 37112.0 | 3885.05 |
| 37113.0 | 3828.68 |
| 37116.0 | 3874.67 |
| 37117.0 | 3924.67 |
| 37118.0 | 3894.77 |
| 37119.0 | 3849.17 |
| 37120.0 | 3759.69 |
| 37123.0 | 3765.61 |
| 37124.0 | 3790.34 |
| 37125.0 | 3793.55 |
| 37126.0 | 3816.99 |
| 37127.0 | 3890.55 |
| 37130.0 | 3892.15 |
| 37131.0 | 3823.33 |
| 37132.0 | 3832.6 |
| 37133.0 | 3737.12 |
| 37134.0 | 3743.97 |
| 37137.0 | 3691.77 |
| 37138.0 | 3736.82 |
| 37139.0 | 3637.17 |
| 37140.0 | 3550.26 |
| 37141.0 | 3456.52 |
| 37144.0 | 3440.65 |
| 37145.0 | 3220.27 |
| 37146.0 | 3260.9 |
| 37147.0 | 3293.82 |
| 37148.0 | 3091.21 |
| 37151.0 | 3204.96 |
| 37152.0 | 3189.94 |
| 37153.0 | 3105.13 |
| 37154.0 | 2967.94 |
| 37155.0 | 2877.68 |
| 37158.0 | 3068.05 |
| 37159.0 | 3095.75 |
| 37160.0 | 3155.68 |
| 37161.0 | 3198.78 |
| 37162.0 | 3296.66 |
| 37165.0 | 3208.31 |
| 37166.0 | 3265.24 |
| 37167.0 | 3264.59 |
| 37168.0 | 3394.69 |
| 37169.0 | 3348.02 |
| 37172.0 | 3353.41 |
| 37173.0 | 3357.12 |
| 37174.0 | 3468.32 |
| 37175.0 | 3510.55 |
| 37176.0 | 3498.66 |
| 37179.0 | 3393.62 |
| 37180.0 | 3455.27 |
| 37181.0 | 3531.76 |
| 37182.0 | 3457.9 |
| 37183.0 | 3406.94 |
| 37186.0 | 3480.27 |
| 37187.0 | 3580.5 |
| 37188.0 | 3609.65 |
| 37189.0 | 3523.43 |
| 37190.0 | 3611.88 |
| 37193.0 | 3527.55 |
| 37194.0 | 3414.72 |
| 37195.0 | 3478.63 |
| 37196.0 | 3508.96 |
| 37197.0 | 3503.26 |
| 37201.0 | 3589.69 |
| 37202.0 | 3633.05 |
| 37203.0 | 3719.47 |
| 37204.0 | 3665.78 |
| 37207.0 | 3744.56 |
| 37208.0 | 3717.98 |
| 37209.0 | 3708.36 |
| 37210.0 | 3703.85 |
| 37211.0 | 3743.44 |
| 37214.0 | 3795.72 |
| 37215.0 | 3747.27 |
| 37216.0 | 3730.04 |
| 37217.0 | 3770.29 |
| 37221.0 | 3753.54 |
| 37222.0 | 3681.05 |
| 37223.0 | 3631.76 |
| 37224.0 | 3629.37 |
| 37225.0 | 3658.27 |
| 37228.0 | 3645.6 |
| 37229.0 | 3690.25 |
| 37230.0 | 3821.8 |
| 37231.0 | 3828.76 |
| 37232.0 | 3792.85 |
| 37235.0 | 3720.2 |
| 37237.0 | 3692.39 |
| 37238.0 | 3607.26 |
| 37239.0 | 3568.73 |
| 37242.0 | 3692.85 |
| 37243.0 | 3680.55 |
| 37244.0 | 3651.51 |
| 37245.0 | 3617.47 |
| 37246.0 | 3696.44 |
| 37249.0 | 3696.98 |
| 37252.0 | 3778.39 |
| 37253.0 | 3806.13 |
| 37256.0 | 3806.13 |
| 37258.0 | 3755.56 |
| 37259.0 | 3833.09 |
| 37260.0 | 3820.42 |
| 37263.0 | 3754.42 |
| 37264.0 | 3724.04 |
| 37265.0 | 3722.98 |
| 37266.0 | 3666.36 |
| 37267.0 | 3696.66 |
| 37270.0 | 3588.51 |
| 37271.0 | 3637.2 |
| 37272.0 | 3576.6 |
| 37273.0 | 3649.43 |
| 37274.0 | 3639.27 |
| 37277.0 | 3601.97 |
| 37278.0 | 3614.62 |
| 37279.0 | 3648.81 |
| 37280.0 | 3710.14 |
| 37281.0 | 3701.3 |
| 37285.0 | 3684.65 |
| 37286.0 | 3630.73 |
| 37287.0 | 3670.26 |
| 37288.0 | 3682.69 |
| 37291.0 | 3619.23 |
| 37292.0 | 3535.7 |
| 37293.0 | 3485.38 |
| 37294.0 | 3519.93 |
| 37295.0 | 3507.46 |
| 37298.0 | 3556.09 |
| 37299.0 | 3543.27 |
| 37300.0 | 3571.55 |
| 37301.0 | 3616.14 |
| 37302.0 | 3555.15 |
| 37305.0 | 3537.52 |
| 37306.0 | 3448.98 |
| 37307.0 | 3433.08 |
| 37308.0 | 3480.58 |
| 37309.0 | 3430.18 |
| 37312.0 | 3493.32 |
| 37313.0 | 3519.8 |
| 37314.0 | 3591.23 |
| 37315.0 | 3624.74 |
| 37316.0 | 3645.33 |
| 37319.0 | 3748.55 |
| 37320.0 | 3732.08 |
| 37321.0 | 3748.67 |
| 37322.0 | 3766.81 |
| 37323.0 | 3789.88 |
| 37326.0 | 3766.9 |
| 37327.0 | 3723.95 |
| 37328.0 | 3702.89 |
| 37329.0 | 3711.45 |
| 37333.0 | 3778.72 |
| 37334.0 | 3796.26 |
| 37335.0 | 3747.27 |
| 37336.0 | 3722.68 |
| 37337.0 | 3744.37 |
| 37340.0 | 3711.76 |
| 37341.0 | 3732.75 |
| 37342.0 | 3734.98 |
| 37343.0 | 3784.05 |
| 37348.0 | 3743.96 |
| 37349.0 | 3748.44 |
| 37350.0 | 3691.1 |
| 37351.0 | 3677.72 |
| 37354.0 | 3604.73 |
| 37355.0 | 3623 |
| 37356.0 | 3660.5 |
| 37357.0 | 3593.43 |
| 37358.0 | 3611.79 |
| 37361.0 | 3650.23 |
| 37362.0 | 3742.88 |
| 37363.0 | 3746.69 |
| 37364.0 | 3704.86 |
| 37365.0 | 3709.01 |
| 37368.0 | 3665.27 |
| 37369.0 | 3657.8 |
| 37370.0 | 3625.67 |
| 37371.0 | 3574.38 |
| 37372.0 | 3561.08 |
| 37375.0 | 3538.74 |
| 37376.0 | 3574.24 |
| 37377.0 | 3574.24 |
| 37378.0 | 3543.12 |
| 37379.0 | 3496.44 |
| 37382.0 | 3479.29 |
| 37383.0 | 3453.29 |
| 37384.0 | 3540.64 |
| 37385.0 | 3525.59 |
| 37386.0 | 3465.12 |
| 37389.0 | 3511.01 |
| 37390.0 | 3575.62 |
| 37391.0 | 3595.73 |
| 37392.0 | 3579.03 |
| 37393.0 | 3554.77 |
| 37396.0 | 3518.98 |
| 37397.0 | 3512.88 |
| 37398.0 | 3459.02 |
| 37399.0 | 3467.67 |
| 37400.0 | 3477.06 |
| 37403.0 | 3500.94 |
| 37404.0 | 3472.4 |
| 37405.0 | 3462.38 |
| 37406.0 | 3388.44 |
| 37407.0 | 3425.79 |
| 37410.0 | 3382.54 |
| 37411.0 | 3260 |
| 37412.0 | 3267.77 |
| 37413.0 | 3277.53 |
| 37414.0 | 3210.5 |
| 37417.0 | 3205.36 |
| 37418.0 | 3265.27 |
| 37420.0 | 3142.21 |
| 37421.0 | 3054.5 |
| 37424.0 | 3193 |
| 37425.0 | 3188.26 |
| 37426.0 | 3122.35 |
| 37427.0 | 3057.43 |
| 37428.0 | 3036.29 |
| 37431.0 | 2928.72 |
| 37432.0 | 3008.29 |
| 37433.0 | 2949.07 |
| 37434.0 | 3002.74 |
| 37435.0 | 3133.39 |
| 37438.0 | 3131.39 |
| 37439.0 | 2999.17 |
| 37440.0 | 2928.94 |
| 37441.0 | 3013.8 |
| 37442.0 | 3165.47 |
| 37445.0 | 3155.88 |
| 37446.0 | 3113.7 |
| 37447.0 | 2983.47 |
| 37448.0 | 2883.92 |
| 37449.0 | 2886.3 |
| 37452.0 | 2709.22 |
| 37453.0 | 2713.73 |
| 37454.0 | 2819.63 |
| 37455.0 | 2850.14 |
| 37456.0 | 2695.47 |
| 37459.0 | 2544.95 |
| 37460.0 | 2458.56 |
| 37461.0 | 2438.31 |
| 37462.0 | 2515.2 |
| 37463.0 | 2536.94 |
| 37466.0 | 2723.01 |
| 37467.0 | 2691.91 |
| 37468.0 | 2685.79 |
| 37469.0 | 2557.85 |
| 37470.0 | 2547.12 |
| 37473.0 | 2447.32 |
| 37474.0 | 2592.24 |
| 37475.0 | 2564.77 |
| 37476.0 | 2698.18 |
| 37477.0 | 2750.17 |
| 37480.0 | 2670.78 |
| 37481.0 | 2698.99 |
| 37482.0 | 2590.75 |
| 37483.0 | 2677.74 |
| 37484.0 | 2713.96 |
| 37487.0 | 2825.39 |
| 37488.0 | 2771.4 |
| 37489.0 | 2802.95 |
| 37490.0 | 2872.02 |
| 37491.0 | 2821.04 |
| 37494.0 | 2771.19 |
| 37495.0 | 2863.6 |
| 37496.0 | 2729.93 |
| 37497.0 | 2667.17 |
| 37498.0 | 2709.29 |
| 37501.0 | 2639.18 |
| 37502.0 | 2509.46 |
| 37503.0 | 2534.01 |
| 37504.0 | 2511.53 |
| 37505.0 | 2618.18 |
| 37508.0 | 2564.81 |
| 37509.0 | 2639.83 |
| 37510.0 | 2723.14 |
| 37511.0 | 2590.19 |
| 37512.0 | 2530.8 |
| 37515.0 | 2516.31 |
| 37516.0 | 2493.42 |
| 37517.0 | 2382.7 |
| 37518.0 | 2328.29 |
| 37519.0 | 2308.03 |
| 37522.0 | 2217.48 |
| 37523.0 | 2187.22 |
| 37524.0 | 2238.11 |
| 37525.0 | 2373.03 |
| 37526.0 | 2343.22 |
| 37529.0 | 2204.39 |
| 37530.0 | 2266.55 |
| 37531.0 | 2361.73 |
| 37532.0 | 2305.18 |
| 37533.0 | 2224.74 |
| 37536.0 | 2207.62 |
| 37537.0 | 2170.54 |
| 37538.0 | 2150.26 |
| 37539.0 | 2234.62 |
| 37540.0 | 2351.81 |
| 37543.0 | 2318.5 |
| 37544.0 | 2485.13 |
| 37545.0 | 2444.85 |
| 37546.0 | 2536.45 |
| 37547.0 | 2527.38 |
| 37550.0 | 2549.84 |
| 37551.0 | 2507.5 |
| 37552.0 | 2399.77 |
| 37553.0 | 2469.62 |
| 37554.0 | 2456.91 |
| 37557.0 | 2508.51 |
| 37558.0 | 2383.5 |
| 37559.0 | 2468.8 |
| 37560.0 | 2518.99 |
| 37561.0 | 2487.66 |
| 37564.0 | 2592.55 |
| 37565.0 | 2614.14 |
| 37566.0 | 2578.36 |
| 37567.0 | 2485.81 |
| 37568.0 | 2450.42 |
| 37571.0 | 2434.73 |
| 37572.0 | 2454.27 |
| 37573.0 | 2435.68 |
| 37574.0 | 2525.74 |
| 37575.0 | 2535.73 |
| 37578.0 | 2572.65 |
| 37579.0 | 2550.47 |
| 37580.0 | 2544.38 |
| 37581.0 | 2644.1 |
| 37582.0 | 2648.14 |
| 37585.0 | 2638.11 |
| 37586.0 | 2564.49 |
| 37587.0 | 2654.77 |
| 37588.0 | 2669.89 |
| 37589.0 | 2656.85 |
| 37592.0 | 2662.49 |
| 37593.0 | 2585.42 |
| 37594.0 | 2577 |
| 37595.0 | 2527.18 |
| 37596.0 | 2531.66 |
| 37599.0 | 2459.02 |
| 37600.0 | 2486.94 |
| 37601.0 | 2515.34 |
| 37602.0 | 2471.38 |
| 37603.0 | 2429.42 |
| 37606.0 | 2522.05 |
| 37607.0 | 2490.61 |
| 37608.0 | 2427.31 |
| 37609.0 | 2406.08 |
| 37610.0 | 2438.97 |
| 37613.0 | 2456.5 |
| 37617.0 | 2364.99 |
| 37620.0 | 2386.41 |
| 37621.0 | 2386.41 |
| 37623.0 | 2522.24 |
| 37624.0 | 2502.19 |
| 37627.0 | 2529.86 |
| 37628.0 | 2504.91 |
| 37629.0 | 2449.78 |
| 37630.0 | 2492.18 |
| 37631.0 | 2489.01 |
| 37634.0 | 2497.61 |
| 37635.0 | 2509.43 |
| 37636.0 | 2479.71 |
| 37637.0 | 2474.88 |
| 37638.0 | 2390.35 |
| 37641.0 | 2352.81 |
| 37642.0 | 2326.93 |
| 37643.0 | 2278.22 |
| 37644.0 | 2269.04 |
| 37645.0 | 2234.56 |
| 37648.0 | 2154.53 |
| 37649.0 | 2159.8 |
| 37650.0 | 2189.03 |
| 37651.0 | 2238.19 |
| 37652.0 | 2248.18 |
| 37655.0 | 2270.73 |
| 37656.0 | 2184.36 |
| 37657.0 | 2225.44 |
| 37658.0 | 2169.88 |
| 37659.0 | 2133.6 |
| 37662.0 | 2125.75 |
| 37663.0 | 2190.28 |
| 37664.0 | 2136.6 |
| 37665.0 | 2123.71 |
| 37666.0 | 2199.97 |
| 37669.0 | 2240.3 |
| 37670.0 | 2280.82 |
| 37671.0 | 2208.18 |
| 37672.0 | 2173.77 |
| 37673.0 | 2208.25 |
| 37676.0 | 2160.58 |
| 37677.0 | 2081.3 |
| 37678.0 | 2058.97 |
| 37679.0 | 2104.41 |
| 37680.0 | 2140.73 |
| 37683.0 | 2142.39 |
| 37684.0 | 2093.04 |
| 37685.0 | 2080.6 |
| 37686.0 | 2043.35 |
| 37687.0 | 1992.45 |
| 37690.0 | 1936.39 |
| 37691.0 | 1934.34 |
| 37692.0 | 1849.64 |
| 37693.0 | 1974.93 |
| 37694.0 | 2079.71 |
| 37697.0 | 2158 |
| 37698.0 | 2153.86 |
| 37699.0 | 2187.16 |
| 37700.0 | 2156.89 |
| 37701.0 | 2249.11 |
| 37704.0 | 2124.78 |
| 37705.0 | 2184.98 |
| 37706.0 | 2172.64 |
| 37707.0 | 2132.5 |
| 37708.0 | 2132.11 |
| 37711.0 | 2036.86 |
| 37712.0 | 2067.23 |
| 37713.0 | 2160.23 |
| 37714.0 | 2182.97 |
| 37715.0 | 2223.17 |
| 37718.0 | 2314.54 |
| 37719.0 | 2282.24 |
| 37720.0 | 2279.52 |
| 37721.0 | 2222.4 |
| 37722.0 | 2247.47 |
| 37725.0 | 2273.96 |
| 37726.0 | 2317.72 |
| 37727.0 | 2294.95 |
| 37728.0 | 2324.27 |
| 37733.0 | 2343.59 |
| 37734.0 | 2365.97 |
| 37735.0 | 2310.87 |
| 37736.0 | 2271.92 |
| 37739.0 | 2344.02 |
| 37740.0 | 2322.27 |
| 37741.0 | 2324.24 |
| 37742.0 | 2324.24 |
| 37743.0 | 2321.91 |
| 37746.0 | 2351.65 |
| 37747.0 | 2389.7 |
| 37748.0 | 2357.14 |
| 37749.0 | 2287.25 |
| 37750.0 | 2314.1 |
| 37753.0 | 2318 |
| 37754.0 | 2312.9 |
| 37755.0 | 2309.93 |
| 37756.0 | 2344.01 |
| 37757.0 | 2349.13 |
| 37760.0 | 2248.03 |
| 37761.0 | 2249.06 |
| 37762.0 | 2229.43 |
| 37763.0 | 2261.98 |
| 37764.0 | 2246.58 |
| 37767.0 | 2242.16 |
| 37768.0 | 2259.35 |
| 37769.0 | 2309.33 |
| 37770.0 | 2310.83 |
| 37771.0 | 2330.06 |
| 37774.0 | 2379.39 |
| 37775.0 | 2366.31 |
| 37776.0 | 2394.79 |
| 37777.0 | 2365.76 |
| 37778.0 | 2421.92 |
| 37781.0 | 2388.55 |
| 37782.0 | 2410.55 |
| 37783.0 | 2452.4 |
| 37784.0 | 2479.92 |
| 37785.0 | 2440.32 |
| 37788.0 | 2492.28 |
| 37789.0 | 2505.99 |
| 37790.0 | 2527.44 |
| 37791.0 | 2491.99 |
| 37792.0 | 2515.33 |
| 37795.0 | 2450.57 |
| 37796.0 | 2446.78 |
| 37797.0 | 2453.73 |
| 37798.0 | 2452.86 |
| 37799.0 | 2453.49 |
| 37802.0 | 2419.51 |
| 37803.0 | 2366.86 |
| 37804.0 | 2420.35 |
| 37805.0 | 2421.64 |
| 37806.0 | 2408.18 |
| 37809.0 | 2486.01 |
| 37810.0 | 2492.73 |
| 37811.0 | 2473.62 |
| 37812.0 | 2441.9 |
| 37813.0 | 2477.72 |
| 37816.0 | 2517.88 |
| 37817.0 | 2503.36 |
| 37818.0 | 2487.99 |
| 37819.0 | 2449.73 |
| 37820.0 | 2458.92 |
| 37823.0 | 2419.81 |
| 37824.0 | 2436.88 |
| 37825.0 | 2429.07 |
| 37826.0 | 2480.87 |
| 37827.0 | 2442.13 |
| 37830.0 | 2486.76 |
| 37831.0 | 2470.41 |
| 37832.0 | 2483.9 |
| 37833.0 | 2519.79 |
| 37834.0 | 2479.7 |
| 37837.0 | 2456.28 |
| 37838.0 | 2481.77 |
| 37839.0 | 2437.38 |
| 37840.0 | 2436.06 |
| 37841.0 | 2460.14 |
| 37844.0 | 2479.06 |
| 37845.0 | 2496.58 |
| 37846.0 | 2497.74 |
| 37847.0 | 2544.05 |
| 37848.0 | 2548.86 |
| 37851.0 | 2574 |
| 37852.0 | 2579.19 |
| 37853.0 | 2562.65 |
| 37854.0 | 2583.91 |
| 37855.0 | 2593.55 |
| 37858.0 | 2565.03 |
| 37859.0 | 2537.14 |
| 37860.0 | 2560.76 |
| 37861.0 | 2575.99 |
| 37862.0 | 2556.71 |
| 37865.0 | 2600.9 |
| 37866.0 | 2599.8 |
| 37867.0 | 2641.55 |
| 37868.0 | 2638.8 |
| 37869.0 | 2614.81 |
| 37872.0 | 2635.59 |
| 37873.0 | 2604.08 |
| 37874.0 | 2565.52 |
| 37875.0 | 2572.74 |
| 37876.0 | 2546.78 |
| 37879.0 | 2555.64 |
| 37880.0 | 2585.28 |
| 37881.0 | 2586.81 |
| 37882.0 | 2608.58 |
| 37883.0 | 2582.47 |
| 37886.0 | 2514.11 |
| 37887.0 | 2493.03 |
| 37888.0 | 2477.34 |
| 37889.0 | 2465.13 |
| 37890.0 | 2447.92 |
| 37893.0 | 2440.12 |
| 37894.0 | 2395.87 |
| 37895.0 | 2439.25 |
| 37896.0 | 2434.63 |
| 37897.0 | 2516.48 |
| 37900.0 | 2497.1 |
| 37901.0 | 2476.61 |
| 37902.0 | 2473.88 |
| 37903.0 | 2531.38 |
| 37904.0 | 2518.44 |
| 37907.0 | 2563.4 |
| 37908.0 | 2552.38 |
| 37909.0 | 2571.41 |
| 37910.0 | 2557.8 |
| 37911.0 | 2550.82 |
| 37914.0 | 2552.18 |
| 37915.0 | 2560.14 |
| 37916.0 | 2509.97 |
| 37917.0 | 2489.07 |
| 37918.0 | 2482.56 |
| 37921.0 | 2512.32 |
| 37922.0 | 2542.7 |
| 37923.0 | 2556.16 |
| 37924.0 | 2571.51 |
| 37925.0 | 2575.04 |
| 37928.0 | 2631.65 |
| 37929.0 | 2627.32 |
| 37930.0 | 2609.9 |
| 37931.0 | 2626.68 |
| 37932.0 | 2657.6 |
| 37935.0 | 2633.07 |
| 37936.0 | 2618.9 |
| 37937.0 | 2627.15 |
| 37938.0 | 2636.78 |
| 37939.0 | 2656.94 |
| 37942.0 | 2586.05 |
| 37943.0 | 2584.05 |
| 37944.0 | 2574.66 |
| 37945.0 | 2568.72 |
| 37946.0 | 2578.24 |
| 37949.0 | 2632.25 |
| 37950.0 | 2625.31 |
| 37951.0 | 2619.56 |
| 37952.0 | 2635.89 |
| 37953.0 | 2630.48 |
| 37956.0 | 2674.62 |
| 37957.0 | 2666.97 |
| 37958.0 | 2694.01 |
| 37959.0 | 2693.43 |
| 37960.0 | 2672.02 |
| 37963.0 | 2651.41 |
| 37964.0 | 2672.62 |
| 37965.0 | 2660.73 |
| 37966.0 | 2684.71 |
| 37967.0 | 2685.39 |
| 37970.0 | 2698.77 |
| 37971.0 | 2697.14 |
| 37972.0 | 2692.26 |
| 37973.0 | 2714.73 |
| 37974.0 | 2725.25 |
| 37977.0 | 2714.09 |
| 37978.0 | 2721.57 |
| 37979.0 | 2725.07 |
| 37984.0 | 2744.2 |
| 37985.0 | 2750.09 |
| 37986.0 | 2760.66 |
| 37988.0 | 2797.56 |
| 37991.0 | 2808.07 |
| 37992.0 | 2805.91 |
| 37993.0 | 2782.52 |
| 37994.0 | 2821.33 |
| 37995.0 | 2800.16 |
| 37998.0 | 2793.88 |
| 37999.0 | 2801.97 |
| 38000.0 | 2829.44 |
| 38001.0 | 2840.8 |
| 38002.0 | 2865.96 |
| 38005.0 | 2879.94 |
| 38006.0 | 2859.58 |
| 38007.0 | 2873.86 |
| 38008.0 | 2891.83 |
| 38009.0 | 2892.54 |
| 38012.0 | 2874.47 |
| 38013.0 | 2884.25 |
| 38014.0 | 2896.78 |
| 38015.0 | 2860.08 |
| 38016.0 | 2839.14 |
| 38019.0 | 2853.9 |
| 38020.0 | 2841.26 |
| 38021.0 | 2819.92 |
| 38022.0 | 2816.34 |
| 38023.0 | 2833.63 |
| 38026.0 | 2870.98 |
| 38027.0 | 2880.94 |
| 38028.0 | 2890.8 |
| 38029.0 | 2896.25 |
| 38030.0 | 2860.88 |
| 38033.0 | 2877.39 |
| 38034.0 | 2895.39 |
| 38035.0 | 2897.59 |
| 38036.0 | 2932.95 |
| 38037.0 | 2904.36 |
| 38040.0 | 2907.46 |
| 38041.0 | 2866.04 |
| 38042.0 | 2872.48 |
| 38043.0 | 2883.54 |
| 38044.0 | 2893.18 |
| 38047.0 | 2918.56 |
| 38048.0 | 2946.62 |
| 38049.0 | 2926.79 |
| 38050.0 | 2952.61 |
| 38051.0 | 2945.63 |
| 38054.0 | 2959.71 |
| 38055.0 | 2923.05 |
| 38056.0 | 2922.68 |
| 38057.0 | 2834.02 |
| 38058.0 | 2834.03 |
| 38061.0 | 2756.13 |
| 38062.0 | 2773.18 |
| 38063.0 | 2821.8 |
| 38064.0 | 2761.66 |
| 38065.0 | 2769.86 |
| 38068.0 | 2712.11 |
| 38069.0 | 2713.68 |
| 38070.0 | 2702.05 |
| 38071.0 | 2752.43 |
| 38072.0 | 2763.75 |
| 38075.0 | 2797.68 |
| 38076.0 | 2791.58 |
| 38077.0 | 2787.5 |
| 38078.0 | 2819.7 |
| 38079.0 | 2885.08 |
| 38082.0 | 2905.88 |
| 38083.0 | 2865.03 |
| 38084.0 | 2851.83 |
| 38085.0 | 2858.93 |
| 38090.0 | 2889.91 |
| 38091.0 | 2856.61 |
| 38092.0 | 2854.52 |
| 38093.0 | 2866.95 |
| 38096.0 | 2859.24 |
| 38097.0 | 2878.8 |
| 38098.0 | 2855.47 |
| 38099.0 | 2877.65 |
| 38100.0 | 2894.18 |
| 38103.0 | 2886.05 |
| 38104.0 | 2884.82 |
| 38105.0 | 2836.67 |
| 38106.0 | 2806.38 |
| 38107.0 | 2787.48 |
| 38110.0 | 2806.46 |
| 38111.0 | 2799.71 |
| 38112.0 | 2823.37 |
| 38113.0 | 2765.74 |
| 38114.0 | 2756.85 |
| 38117.0 | 2684.96 |
| 38118.0 | 2721.08 |
| 38119.0 | 2680.1 |
| 38120.0 | 2712.5 |
| 38121.0 | 2694.92 |
| 38124.0 | 2659.85 |
| 38125.0 | 2675.75 |
| 38126.0 | 2729.52 |
| 38127.0 | 2708.54 |
| 38128.0 | 2697.46 |
| 38131.0 | 2716.07 |
| 38132.0 | 2699.36 |
| 38133.0 | 2729.62 |
| 38134.0 | 2752.02 |
| 38135.0 | 2736.83 |
| 38138.0 | 2749.62 |
| 38139.0 | 2713.29 |
| 38140.0 | 2730.15 |
| 38141.0 | 2736.72 |
| 38142.0 | 2767.87 |
| 38145.0 | 2799.81 |
| 38146.0 | 2800.36 |
| 38147.0 | 2787.39 |
| 38148.0 | 2800.18 |
| 38149.0 | 2797.05 |
| 38152.0 | 2759.27 |
| 38153.0 | 2785.68 |
| 38154.0 | 2807.16 |
| 38155.0 | 2807.16 |
| 38156.0 | 2822.05 |
| 38159.0 | 2816.56 |
| 38160.0 | 2782.43 |
| 38161.0 | 2793.63 |
| 38162.0 | 2822.35 |
| 38163.0 | 2818.85 |
| 38166.0 | 2840.04 |
| 38167.0 | 2828.59 |
| 38168.0 | 2811.08 |
| 38169.0 | 2806.62 |
| 38170.0 | 2783.99 |
| 38173.0 | 2784.92 |
| 38174.0 | 2764.89 |
| 38175.0 | 2764.31 |
| 38176.0 | 2776.88 |
| 38177.0 | 2776.25 |
| 38180.0 | 2760.11 |
| 38181.0 | 2763.2 |
| 38182.0 | 2754.77 |
| 38183.0 | 2715.64 |
| 38184.0 | 2713.27 |
| 38187.0 | 2697.69 |
| 38188.0 | 2708.16 |
| 38189.0 | 2728.91 |
| 38190.0 | 2680.44 |
| 38191.0 | 2673.44 |
| 38194.0 | 2640.6 |
| 38195.0 | 2670.49 |
| 38196.0 | 2665.98 |
| 38197.0 | 2717.61 |
| 38198.0 | 2720.05 |
| 38201.0 | 2696.26 |
| 38202.0 | 2712.45 |
| 38203.0 | 2684.28 |
| 38204.0 | 2689.26 |
| 38205.0 | 2618.68 |
| 38208.0 | 2596.52 |
| 38209.0 | 2619.42 |
| 38210.0 | 2594.45 |
| 38211.0 | 2588.8 |
| 38212.0 | 2580.04 |
| 38215.0 | 2604.75 |
| 38216.0 | 2617.27 |
| 38217.0 | 2627.37 |
| 38218.0 | 2630.71 |
| 38219.0 | 2624.96 |
| 38222.0 | 2662.35 |
| 38223.0 | 2659.14 |
| 38224.0 | 2664.67 |
| 38225.0 | 2688.67 |
| 38226.0 | 2704.53 |
| 38229.0 | 2697.05 |
| 38230.0 | 2670.79 |
| 38231.0 | 2691.67 |
| 38232.0 | 2711.16 |
| 38233.0 | 2739.43 |
| 38236.0 | 2748.39 |
| 38237.0 | 2751.93 |
| 38238.0 | 2746.96 |
| 38239.0 | 2730.74 |
| 38240.0 | 2745.86 |
| 38243.0 | 2780.85 |
| 38244.0 | 2771.67 |
| 38245.0 | 2763.75 |
| 38246.0 | 2765.87 |
| 38247.0 | 2788.64 |
| 38250.0 | 2776.1 |
| 38251.0 | 2790.67 |
| 38252.0 | 2759.68 |
| 38253.0 | 2735.45 |
| 38254.0 | 2740.06 |
| 38257.0 | 2725.1 |
| 38258.0 | 2733.69 |
| 38259.0 | 2746.36 |
| 38260.0 | 2726.3 |
| 38261.0 | 2796.08 |
| 38264.0 | 2823.46 |
| 38265.0 | 2830.12 |
| 38266.0 | 2831.88 |
| 38267.0 | 2834.62 |
| 38268.0 | 2816.42 |
| 38271.0 | 2813.93 |
| 38272.0 | 2788.07 |
| 38273.0 | 2792.27 |
| 38274.0 | 2776.03 |
| 38275.0 | 2773.39 |
| 38278.0 | 2768.63 |
| 38279.0 | 2801.2 |
| 38280.0 | 2769.26 |
| 38281.0 | 2786.53 |
| 38282.0 | 2788.9 |
| 38285.0 | 2734.37 |
| 38286.0 | 2739.37 |
| 38287.0 | 2787.15 |
| 38288.0 | 2818.54 |
| 38289.0 | 2811.72 |
| 38292.0 | 2834.03 |
| 38293.0 | 2855.16 |
| 38294.0 | 2860.68 |
| 38295.0 | 2859.52 |
| 38296.0 | 2874.79 |
| 38299.0 | 2872.48 |
| 38300.0 | 2864.94 |
| 38301.0 | 2872.66 |
| 38302.0 | 2903.93 |
| 38303.0 | 2907.45 |
| 38306.0 | 2898.17 |
| 38307.0 | 2879.01 |
| 38308.0 | 2922.24 |
| 38309.0 | 2917.21 |
| 38310.0 | 2893.08 |
| 38313.0 | 2879.58 |
| 38314.0 | 2876.88 |
| 38315.0 | 2876.84 |
| 38316.0 | 2904.17 |
| 38317.0 | 2898.95 |
| 38320.0 | 2891.15 |
| 38321.0 | 2876.39 |
| 38322.0 | 2913.21 |
| 38323.0 | 2926.73 |
| 38324.0 | 2911.58 |
| 38327.0 | 2904.51 |
| 38328.0 | 2918.43 |
| 38329.0 | 2912.44 |
| 38330.0 | 2888.01 |
| 38331.0 | 2903.96 |
| 38334.0 | 2928.43 |
| 38335.0 | 2934.1 |
| 38336.0 | 2921.95 |
| 38337.0 | 2929.63 |
| 38338.0 | 2891.48 |
| 38341.0 | 2906.25 |
| 38342.0 | 2912.8 |
| 38343.0 | 2937.74 |
| 38344.0 | 2950.92 |
| 38348.0 | 2944.16 |
| 38349.0 | 2955.1 |
| 38350.0 | 2953.15 |
| 38351.0 | 2951.24 |
| 38352.0 | 2951.24 |
| 38355.0 | 2970.02 |
| 38356.0 | 2971.12 |
| 38357.0 | 2947.19 |
| 38358.0 | 2966.24 |
| 38359.0 | 2979.81 |
| 38362.0 | 2977.21 |
| 38363.0 | 2949.29 |
| 38364.0 | 2924.01 |
| 38365.0 | 2936.32 |
| 38366.0 | 2948.22 |
| 38369.0 | 2963.06 |
| 38370.0 | 2962.43 |
| 38371.0 | 2959.9 |
| 38372.0 | 2937.71 |
| 38373.0 | 2940.87 |
| 38376.0 | 2937.83 |
| 38377.0 | 2958.61 |
| 38378.0 | 2956.43 |
| 38379.0 | 2970.81 |
| 38380.0 | 2955.89 |
| 38383.0 | 2984.59 |
| 38384.0 | 3008.85 |
| 38385.0 | 3022.34 |
| 38386.0 | 3010.39 |
| 38387.0 | 3037.14 |
| 38390.0 | 3051.97 |
| 38391.0 | 3055.9 |
| 38392.0 | 3044.36 |
| 38393.0 | 3044 |
| 38394.0 | 3080.08 |
| 38397.0 | 3075.76 |
| 38398.0 | 3086.95 |
| 38399.0 | 3068.55 |
| 38400.0 | 3067.34 |
| 38401.0 | 3072.04 |
| 38404.0 | 3063.64 |
| 38405.0 | 3045.24 |
| 38406.0 | 3028.08 |
| 38407.0 | 3024.8 |
| 38408.0 | 3062.72 |
| 38411.0 | 3058.32 |
| 38412.0 | 3078.44 |
| 38413.0 | 3082.71 |
| 38414.0 | 3078.1 |
| 38415.0 | 3106.86 |
| 38418.0 | 3114.54 |
| 38419.0 | 3097.34 |
| 38420.0 | 3081.99 |
| 38421.0 | 3053.66 |
| 38422.0 | 3060.36 |
| 38425.0 | 3060.73 |
| 38426.0 | 3083.73 |
| 38427.0 | 3032.13 |
| 38428.0 | 3039.8 |
| 38429.0 | 3053.54 |
| 38432.0 | 3038.14 |
| 38433.0 | 3050.44 |
| 38434.0 | 3036.85 |
| 38435.0 | 3060.67 |
| 38440.0 | 3069.35 |
| 38441.0 | 3056.25 |
| 38442.0 | 3055.73 |
| 38443.0 | 3061.11 |
| 38446.0 | 3042.17 |
| 38447.0 | 3064.07 |
| 38448.0 | 3076.23 |
| 38449.0 | 3090.72 |
| 38450.0 | 3088.92 |
| 38453.0 | 3080.6 |
| 38454.0 | 3065.18 |
| 38455.0 | 3080.54 |
| 38456.0 | 3075.33 |
| 38457.0 | 3013.79 |
| 38460.0 | 2947.78 |
| 38461.0 | 2957.36 |
| 38462.0 | 2944.33 |
| 38463.0 | 2950.34 |
| 38464.0 | 2976.39 |
| 38467.0 | 2987.05 |
| 38468.0 | 2983.23 |
| 38469.0 | 2942.62 |
| 38470.0 | 2930.87 |
| 38471.0 | 2930.1 |
| 38474.0 | 2949.09 |
| 38475.0 | 2962.59 |
| 38476.0 | 2981.04 |
| 38477.0 | 3004.52 |
| 38478.0 | 3019.26 |
| 38481.0 | 3007.09 |
| 38482.0 | 2983.42 |
| 38483.0 | 2970.5 |
| 38484.0 | 2993.09 |
| 38485.0 | 2994.52 |
| 38488.0 | 2988.16 |
| 38489.0 | 2983.84 |
| 38490.0 | 3036.3 |
| 38491.0 | 3051.79 |
| 38492.0 | 3050.45 |
| 38495.0 | 3070.98 |
| 38496.0 | 3066.55 |
| 38497.0 | 3059.84 |
| 38498.0 | 3086.08 |
| 38499.0 | 3084 |
| 38502.0 | 3096.54 |
| 38503.0 | 3076.7 |
| 38504.0 | 3125.88 |
| 38505.0 | 3131.03 |
| 38506.0 | 3114.27 |
| 38509.0 | 3099.2 |
| 38510.0 | 3134.82 |
| 38511.0 | 3125.59 |
| 38512.0 | 3122.93 |
| 38513.0 | 3143.85 |
| 38516.0 | 3159.83 |
| 38517.0 | 3162.86 |
| 38518.0 | 3147.55 |
| 38519.0 | 3160.09 |
| 38520.0 | 3178.48 |
| 38523.0 | 3162.14 |
| 38524.0 | 3179.62 |
| 38525.0 | 3182.07 |
| 38526.0 | 3190.8 |
| 38527.0 | 3161 |
| 38530.0 | 3132.5 |
| 38531.0 | 3162 |
| 38532.0 | 3178.56 |
| 38533.0 | 3181.54 |
| 38534.0 | 3208.61 |
| 38537.0 | 3215.6 |
| 38538.0 | 3207.91 |
| 38539.0 | 3224.11 |
| 38540.0 | 3170.06 |
| 38541.0 | 3224.59 |
| 38544.0 | 3246.4 |
| 38545.0 | 3236.33 |
| 38546.0 | 3260.67 |
| 38547.0 | 3277.2 |
| 38548.0 | 3278.71 |
| 38551.0 | 3276.49 |
| 38552.0 | 3314.06 |
| 38553.0 | 3303.88 |
| 38554.0 | 3299.92 |
| 38555.0 | 3292.92 |
| 38558.0 | 3298.27 |
| 38559.0 | 3302.98 |
| 38560.0 | 3310.84 |
| 38561.0 | 3333.05 |
| 38562.0 | 3326.51 |
| 38565.0 | 3320.44 |
| 38566.0 | 3349.91 |
| 38567.0 | 3343.63 |
| 38568.0 | 3310.62 |
| 38569.0 | 3280.49 |
| 38572.0 | 3292.41 |
| 38573.0 | 3331.29 |
| 38574.0 | 3370.84 |
| 38575.0 | 3354.16 |
| 38576.0 | 3334.15 |
| 38579.0 | 3326.34 |
| 38580.0 | 3307.42 |
| 38581.0 | 3298.2 |
| 38582.0 | 3283.84 |
| 38583.0 | 3328.17 |
| 38586.0 | 3330.44 |
| 38587.0 | 3299.28 |
| 38588.0 | 3294.25 |
| 38589.0 | 3258.52 |
| 38590.0 | 3224.1 |
| 38593.0 | 3239.96 |
| 38594.0 | 3234.1 |
| 38595.0 | 3263.78 |
| 38596.0 | 3282.29 |
| 38597.0 | 3274.42 |
| 38600.0 | 3303.05 |
| 38601.0 | 3341.8 |
| 38602.0 | 3349.46 |
| 38603.0 | 3346.63 |
| 38604.0 | 3359.66 |
| 38607.0 | 3354.64 |
| 38608.0 | 3325.55 |
| 38609.0 | 3338.99 |
| 38610.0 | 3339.02 |
| 38611.0 | 3366.57 |
| 38614.0 | 3356.28 |
| 38615.0 | 3375.79 |
| 38616.0 | 3326.78 |
| 38617.0 | 3312.26 |
| 38618.0 | 3331.55 |
| 38621.0 | 3400.93 |
| 38622.0 | 3384.24 |
| 38623.0 | 3429.42 |
| 38624.0 | 3412.75 |
| 38625.0 | 3428.51 |
| 38628.0 | 3449.34 |
| 38629.0 | 3464.23 |
| 38630.0 | 3418.84 |
| 38631.0 | 3384.15 |
| 38632.0 | 3374.1 |
| 38635.0 | 3381.17 |
| 38636.0 | 3387.46 |
| 38637.0 | 3359.85 |
| 38638.0 | 3331.42 |
| 38639.0 | 3349.58 |
| 38642.0 | 3356.77 |
| 38643.0 | 3334.79 |
| 38644.0 | 3279.61 |
| 38645.0 | 3284.77 |
| 38646.0 | 3271.05 |
| 38649.0 | 3310.13 |
| 38650.0 | 3292.52 |
| 38651.0 | 3304.27 |
| 38652.0 | 3241.14 |
| 38653.0 | 3245.98 |
| 38656.0 | 3320.15 |
| 38657.0 | 3312.45 |
| 38658.0 | 3320.62 |
| 38659.0 | 3361.64 |
| 38660.0 | 3355.28 |
| 38663.0 | 3362.83 |
| 38664.0 | 3361.75 |
| 38665.0 | 3355.77 |
| 38666.0 | 3361.05 |
| 38667.0 | 3406.23 |
| 38670.0 | 3412.19 |
| 38671.0 | 3413.96 |
| 38672.0 | 3391.59 |
| 38673.0 | 3404.12 |
| 38674.0 | 3427.18 |
| 38677.0 | 3450.01 |
| 38678.0 | 3450.51 |
| 38679.0 | 3471.43 |
| 38680.0 | 3459.15 |
| 38681.0 | 3466.08 |
| 38684.0 | 3453.11 |
| 38685.0 | 3463.67 |
| 38686.0 | 3447.07 |
| 38687.0 | 3501.53 |
| 38688.0 | 3519.66 |
| 38691.0 | 3499.4 |
| 38692.0 | 3516.84 |
| 38693.0 | 3505.34 |
| 38694.0 | 3510.38 |
| 38695.0 | 3500.8 |
| 38698.0 | 3514.07 |
| 38699.0 | 3528.34 |
| 38700.0 | 3519.12 |
| 38701.0 | 3522.3 |
| 38702.0 | 3556.76 |
| 38705.0 | 3551.1 |
| 38706.0 | 3561.11 |
| 38707.0 | 3591.94 |
| 38708.0 | 3591.02 |
| 38709.0 | 3599.47 |
| 38713.0 | 3612.21 |
| 38714.0 | 3605.12 |
| 38715.0 | 3616.33 |
| 38716.0 | 3578.93 |
| 38719.0 | 3604.33 |
| 38720.0 | 3614.34 |
| 38721.0 | 3652.46 |
| 38722.0 | 3650.24 |
| 38723.0 | 3666.99 |
| 38726.0 | 3671.78 |
| 38727.0 | 3644.94 |
| 38728.0 | 3668.61 |
| 38729.0 | 3670.2 |
| 38730.0 | 3629.25 |
| 38733.0 | 3644.41 |
| 38734.0 | 3610.06 |
| 38735.0 | 3570.17 |
| 38736.0 | 3593.22 |
| 38737.0 | 3550.8 |
| 38740.0 | 3544.31 |
| 38741.0 | 3532.68 |
| 38742.0 | 3578 |
| 38743.0 | 3641.42 |
| 38744.0 | 3685.48 |
| 38747.0 | 3677.52 |
| 38748.0 | 3691.41 |
| 38749.0 | 3728.34 |
| 38750.0 | 3677.05 |
| 38751.0 | 3678.48 |
| 38754.0 | 3682.32 |
| 38755.0 | 3680.79 |
| 38756.0 | 3671.37 |
| 38757.0 | 3726.81 |
| 38758.0 | 3695.63 |
| 38761.0 | 3727.46 |
| 38762.0 | 3734.48 |
| 38763.0 | 3729.79 |
| 38764.0 | 3756.47 |
| 38765.0 | 3767.7 |
| 38768.0 | 3766.74 |
| 38769.0 | 3779.51 |
| 38770.0 | 3818.48 |
| 38771.0 | 3813.29 |
| 38772.0 | 3826 |
| 38775.0 | 3840.56 |
| 38776.0 | 3774.51 |
| 38777.0 | 3806.03 |
| 38778.0 | 3763.73 |
| 38779.0 | 3733.95 |
| 38782.0 | 3754.07 |
| 38783.0 | 3745.2 |
| 38784.0 | 3727.96 |
| 38785.0 | 3757.73 |
| 38786.0 | 3798.46 |
| 38789.0 | 3824.97 |
| 38790.0 | 3833.48 |
| 38791.0 | 3842.16 |
| 38792.0 | 3839.71 |
| 38793.0 | 3832.43 |
| 38796.0 | 3842.1 |
| 38797.0 | 3848.17 |
| 38798.0 | 3868.48 |
| 38799.0 | 3860.13 |
| 38800.0 | 3870.89 |
| 38803.0 | 3827.93 |
| 38804.0 | 3811.22 |
| 38805.0 | 3826.29 |
| 38806.0 | 3874.61 |
| 38807.0 | 3853.74 |
| 38810.0 | 3878.64 |
| 38811.0 | 3850.11 |
| 38812.0 | 3863.92 |
| 38813.0 | 3861.29 |
| 38814.0 | 3823.11 |
| 38817.0 | 3843.52 |
| 38818.0 | 3788.81 |
| 38819.0 | 3776.94 |
| 38820.0 | 3779.94 |
| 38825.0 | 3770.79 |
| 38826.0 | 3820.96 |
| 38827.0 | 3860 |
| 38828.0 | 3888.46 |
| 38831.0 | 3862.27 |
| 38832.0 | 3871.09 |
| 38833.0 | 3887 |
| 38834.0 | 3865.42 |
| 38835.0 | 3839.9 |
| 38838.0 | 3839.9 |
| 38839.0 | 3862.24 |
| 38840.0 | 3821.97 |
| 38841.0 | 3843.08 |
| 38842.0 | 3874.31 |
| 38845.0 | 3877.53 |
| 38846.0 | 3890.94 |
| 38847.0 | 3863.56 |
| 38848.0 | 3837.86 |
| 38849.0 | 3750.44 |
| 38852.0 | 3711.16 |
| 38853.0 | 3730.35 |
| 38854.0 | 3605.19 |
| 38855.0 | 3606.33 |
| 38856.0 | 3625.25 |
| 38859.0 | 3539.77 |
| 38860.0 | 3620.28 |
| 38861.0 | 3574.86 |
| 38862.0 | 3635 |
| 38863.0 | 3699.8 |
| 38866.0 | 3679.57 |
| 38867.0 | 3590.91 |
| 38868.0 | 3637.17 |
| 38869.0 | 3648.33 |
| 38870.0 | 3636.89 |
| 38873.0 | 3604.33 |
| 38874.0 | 3529.1 |
| 38875.0 | 3562.36 |
| 38876.0 | 3462.37 |
| 38877.0 | 3520.99 |
| 38880.0 | 3480.76 |
| 38881.0 | 3408.02 |
| 38882.0 | 3414.21 |
| 38883.0 | 3493.25 |
| 38884.0 | 3463.56 |
| 38887.0 | 3490.24 |
| 38888.0 | 3514.83 |
| 38889.0 | 3526.86 |
| 38890.0 | 3544.85 |
| 38891.0 | 3550.15 |
| 38894.0 | 3534.84 |
| 38895.0 | 3506.93 |
| 38896.0 | 3506.02 |
| 38897.0 | 3582.61 |
| 38898.0 | 3648.92 |
| 38901.0 | 3662.92 |
| 38902.0 | 3670.75 |
| 38903.0 | 3618.64 |
| 38904.0 | 3662.39 |
| 38905.0 | 3651.33 |
| 38908.0 | 3666.51 |
| 38909.0 | 3617.78 |
| 38910.0 | 3630.5 |
| 38911.0 | 3562.56 |
| 38912.0 | 3508.25 |
| 38915.0 | 3498.62 |
| 38916.0 | 3492.11 |
| 38917.0 | 3585.65 |
| 38918.0 | 3589.63 |
| 38919.0 | 3557.08 |
| 38922.0 | 3632.93 |
| 38923.0 | 3631.5 |
| 38924.0 | 3640.75 |
| 38925.0 | 3681.55 |
| 38926.0 | 3710.6 |
| 38929.0 | 3691.87 |
| 38930.0 | 3640.6 |
| 38931.0 | 3696.35 |
| 38932.0 | 3667.91 |
| 38933.0 | 3718.09 |
| 38936.0 | 3658.25 |
| 38937.0 | 3668.1 |
| 38938.0 | 3707.19 |
| 38939.0 | 3675.44 |
| 38940.0 | 3675.06 |
| 38943.0 | 3719.11 |
| 38944.0 | 3766.38 |
| 38945.0 | 3791.1 |
| 38946.0 | 3800.1 |
| 38947.0 | 3791.4 |
| 38950.0 | 3777.25 |
| 38951.0 | 3792.55 |
| 38952.0 | 3758.98 |
| 38953.0 | 3781.87 |
| 38954.0 | 3781.17 |
| 38957.0 | 3808.57 |
| 38958.0 | 3806.81 |
| 38959.0 | 3817.86 |
| 38960.0 | 3808.7 |
| 38961.0 | 3820.89 |
| 38964.0 | 3837.61 |
| 38965.0 | 3817.76 |
| 38966.0 | 3772.21 |
| 38967.0 | 3739.7 |
| 38968.0 | 3750.08 |
| 38971.0 | 3742.06 |
| 38972.0 | 3788.96 |
| 38973.0 | 3805.55 |
| 38974.0 | 3796.59 |
| 38975.0 | 3812.11 |
| 38978.0 | 3808.47 |
| 38979.0 | 3780.18 |
| 38980.0 | 3841.31 |
| 38981.0 | 3857.14 |
| 38982.0 | 3812.73 |
| 38985.0 | 3822.12 |
| 38986.0 | 3872.92 |
| 38987.0 | 3896.18 |
| 38988.0 | 3894.98 |
| 38989.0 | 3899.41 |
| 38992.0 | 3892.48 |
| 38993.0 | 3880.14 |
| 38994.0 | 3914.73 |
| 38995.0 | 3939.86 |
| 38996.0 | 3940.31 |
| 38999.0 | 3939.48 |
| 39000.0 | 3960.67 |
| 39001.0 | 3967.39 |
| 39002.0 | 3999.89 |
| 39003.0 | 3999.07 |
| 39006.0 | 4001.97 |
| 39007.0 | 3949.57 |
| 39008.0 | 3991.38 |
| 39009.0 | 3986.82 |
| 39010.0 | 3998.19 |
| 39013.0 | 4019.02 |
| 39014.0 | 4014.01 |
| 39015.0 | 4019.14 |
| 39016.0 | 4027.29 |
| 39017.0 | 4017.27 |
| 39020.0 | 4004.92 |
| 39021.0 | 4004.8 |
| 39022.0 | 4014.34 |
| 39023.0 | 3974.62 |
| 39024.0 | 3990.46 |
| 39027.0 | 4045.22 |
| 39028.0 | 4072.86 |
| 39029.0 | 4073.81 |
| 39030.0 | 4073 |
| 39031.0 | 4063.84 |
| 39034.0 | 4086.15 |
| 39035.0 | 4084.33 |
| 39036.0 | 4108.83 |
| 39037.0 | 4109.81 |
| 39038.0 | 4080.03 |
| 39041.0 | 4095.75 |
| 39042.0 | 4096.06 |
| 39043.0 | 4094.97 |
| 39044.0 | 4085.76 |
| 39045.0 | 4048.16 |
| 39048.0 | 3978.25 |
| 39049.0 | 3975.11 |
| 39050.0 | 4023.09 |
| 39051.0 | 3987.23 |
| 39052.0 | 3932.09 |
| 39055.0 | 3962.93 |
| 39056.0 | 4007.94 |
| 39057.0 | 4002.31 |
| 39058.0 | 4018.69 |
| 39059.0 | 4019.89 |
| 39062.0 | 4052.9 |
| 39063.0 | 4059.74 |
| 39064.0 | 4094.33 |
| 39065.0 | 4118.84 |
| 39066.0 | 4140.66 |
| 39069.0 | 4130.06 |
| 39070.0 | 4100.48 |
| 39071.0 | 4118.54 |
| 39072.0 | 4112.1 |
| 39073.0 | 4073.5 |
| 39078.0 | 4134.86 |
| 39079.0 | 4130.66 |
| 39080.0 | 4119.94 |
| 39084.0 | 4182.12 |
| 39085.0 | 4188.24 |
| 39086.0 | 4177.76 |
| 39087.0 | 4129.35 |
| 39090.0 | 4123.33 |
| 39091.0 | 4129.49 |
| 39092.0 | 4090.88 |
| 39093.0 | 4165.95 |
| 39094.0 | 4174.8 |
| 39097.0 | 4187.36 |
| 39098.0 | 4169.18 |
| 39099.0 | 4146.73 |
| 39100.0 | 4137.31 |
| 39101.0 | 4173.07 |
| 39104.0 | 4140.61 |
| 39105.0 | 4140.19 |
| 39106.0 | 4187.55 |
| 39107.0 | 4175.7 |
| 39108.0 | 4149.01 |
| 39111.0 | 4166.83 |
| 39112.0 | 4195.21 |
| 39113.0 | 4178.54 |
| 39114.0 | 4211.32 |
| 39115.0 | 4228.39 |
| 39118.0 | 4227.47 |
| 39119.0 | 4233.47 |
| 39120.0 | 4251.06 |
| 39121.0 | 4225.92 |
| 39122.0 | 4248.24 |
| 39125.0 | 4213.85 |
| 39126.0 | 4239.03 |
| 39127.0 | 4267.02 |
| 39128.0 | 4258.13 |
| 39129.0 | 4247.4 |
| 39132.0 | 4266.23 |
| 39133.0 | 4250.3 |
| 39134.0 | 4232.52 |
| 39135.0 | 4241.48 |
| 39136.0 | 4245.99 |
| 39139.0 | 4272.32 |
| 39140.0 | 4156.73 |
| 39141.0 | 4087.12 |
| 39142.0 | 4031.3 |
| 39143.0 | 4011.63 |
| 39146.0 | 3980.06 |
| 39147.0 | 4010.39 |
| 39148.0 | 4021.97 |
| 39149.0 | 4082.58 |
| 39150.0 | 4091.67 |
| 39153.0 | 4066.78 |
| 39154.0 | 4017.75 |
| 39155.0 | 3906.15 |
| 39156.0 | 3985.57 |
| 39157.0 | 3984.54 |
| 39160.0 | 4055.49 |
| 39161.0 | 4079.52 |
| 39162.0 | 4078.29 |
| 39163.0 | 4170.08 |
| 39164.0 | 4191.58 |
| 39167.0 | 4142.11 |
| 39168.0 | 4153.61 |
| 39169.0 | 4128.2 |
| 39170.0 | 4180.07 |
| 39171.0 | 4181.03 |
| 39174.0 | 4189.55 |
| 39175.0 | 4246.3 |
| 39176.0 | 4261.83 |
| 39177.0 | 4271.54 |
| 39182.0 | 4301.47 |
| 39183.0 | 4293.2 |
| 39184.0 | 4280.02 |
| 39185.0 | 4317.35 |
| 39188.0 | 4379.25 |
| 39189.0 | 4384.38 |
| 39190.0 | 4358.95 |
| 39191.0 | 4339.93 |
| 39192.0 | 4416.79 |
| 39195.0 | 4400.12 |
| 39196.0 | 4367.83 |
| 39197.0 | 4404.44 |
| 39198.0 | 4414.21 |
| 39199.0 | 4383.13 |
| 39202.0 | 4392.34 |
| 39203.0 | 4392.41 |
| 39204.0 | 4415.48 |
| 39205.0 | 4427.32 |
| 39206.0 | 4445.59 |
| 39209.0 | 4441.31 |
| 39210.0 | 4411.32 |
| 39211.0 | 4425.03 |
| 39212.0 | 4391.87 |
| 39213.0 | 4423.07 |
| 39216.0 | 4413.72 |
| 39217.0 | 4441.03 |
| 39218.0 | 4422.62 |
| 39219.0 | 4428.56 |
| 39220.0 | 4480.81 |
| 39223.0 | 4465.54 |
| 39224.0 | 4469.88 |
| 39225.0 | 4499.69 |
| 39226.0 | 4452.7 |
| 39227.0 | 4463.52 |
| 39230.0 | 4475.46 |
| 39231.0 | 4474.81 |
| 39232.0 | 4468.72 |
| 39233.0 | 4512.65 |
| 39234.0 | 4556.97 |
| 39237.0 | 4537.81 |
| 39238.0 | 4513.19 |
| 39239.0 | 4437.29 |
| 39240.0 | 4381.45 |
| 39241.0 | 4376.42 |
| 39244.0 | 4415.5 |
| 39245.0 | 4383.02 |
| 39246.0 | 4401.68 |
| 39247.0 | 4485.04 |
| 39251.0 | 4530.22 |
| 39252.0 | 4527.22 |
| 39254.0 | 4488.66 |
| 39255.0 | 4479.36 |
| 39258.0 | 4471.13 |
| 39259.0 | 4433.04 |
| 39260.0 | 4412.12 |
| 39261.0 | 4457.99 |
| 39262.0 | 4489.77 |
| 39265.0 | 4470.26 |
| 39266.0 | 4513.01 |
| 39267.0 | 4524.24 |
| 39268.0 | 4491.87 |
| 39269.0 | 4524.45 |
| 39272.0 | 4528.76 |
| 39273.0 | 4474.15 |
| 39274.0 | 4447.52 |
| 39275.0 | 4517.7 |
| 39276.0 | 4542.57 |
| 39279.0 | 4557.57 |
| 39280.0 | 4538.31 |
| 39281.0 | 4472.22 |
| 39282.0 | 4522.63 |
| 39283.0 | 4445.23 |
| 39286.0 | 4482.75 |
| 39287.0 | 4412.06 |
| 39288.0 | 4360.9 |
| 39289.0 | 4252.92 |
| 39290.0 | 4244.58 |
| 39293.0 | 4239.18 |
| 39294.0 | 4315.69 |
| 39295.0 | 4237.05 |
| 39296.0 | 4288.66 |
| 39297.0 | 4229.19 |
| 39300.0 | 4202.77 |
| 39301.0 | 4276.8 |
| 39302.0 | 4364.22 |
| 39303.0 | 4275.18 |
| 39307.0 | 4255.79 |
| 39308.0 | 4195.6 |
| 39309.0 | 4183.06 |
| 39310.0 | 4062.33 |
| 39311.0 | 4157.2 |
| 39314.0 | 4173.29 |
| 39315.0 | 4175.07 |
| 39316.0 | 4226.52 |
| 39317.0 | 4225.89 |
| 39318.0 | 4238.63 |
| 39321.0 | 4240.95 |
| 39322.0 | 4170.68 |
| 39323.0 | 4193.58 |
| 39324.0 | 4246.12 |
| 39325.0 | 4294.56 |
| 39328.0 | 4295.99 |
| 39329.0 | 4324.35 |
| 39330.0 | 4235.41 |
| 39331.0 | 4256.12 |
| 39332.0 | 4162.42 |
| 39335.0 | 4136.44 |
| 39336.0 | 4197.35 |
| 39337.0 | 4210.69 |
| 39338.0 | 4249.01 |
| 39339.0 | 4221.34 |
| 39342.0 | 4184.6 |
| 39343.0 | 4264.42 |
| 39344.0 | 4389.33 |
| 39345.0 | 4366.16 |
| 39346.0 | 4370.35 |
| 39350.0 | 4328.9 |
| 39351.0 | 4364.4 |
| 39352.0 | 4388.98 |
| 39353.0 | 4381.71 |
| 39356.0 | 4409.65 |
| 39358.0 | 4421.58 |
| 39359.0 | 4420.39 |
| 39360.0 | 4455.31 |
| 39363.0 | 4435.87 |
| 39364.0 | 4447.58 |
| 39365.0 | 4442.61 |
| 39366.0 | 4473.57 |
| 39370.0 | 4434.98 |
| 39371.0 | 4420.91 |
| 39372.0 | 4441.8 |
| 39373.0 | 4420.38 |
| 39374.0 | 4411.26 |
| 39377.0 | 4356.24 |
| 39378.0 | 4378.42 |
| 39379.0 | 4357.14 |
| 39380.0 | 4412.12 |
| 39381.0 | 4440.23 |
| 39385.0 | 4462.95 |
| 39386.0 | 4489.79 |
| 39387.0 | 4415.27 |
| 39391.0 | 4392.8 |
| 39392.0 | 4407.34 |
| 39394.0 | 4363.6 |
| 39395.0 | 4297.83 |
| 39398.0 | 4302.88 |
| 39399.0 | 4311.98 |
| 39400.0 | 4338.28 |
| 39401.0 | 4301.44 |
| 39402.0 | 4282.4 |
| 39405.0 | 4226.7 |
| 39406.0 | 4277.24 |
| 39407.0 | 4195.58 |
| 39408.0 | 4208.92 |
| 39409.0 | 4268.53 |
| 39412.0 | 4238 |
| 39413.0 | 4224.44 |
| 39414.0 | 4321.75 |
| 39415.0 | 4347 |
| 39416.0 | 4394.95 |
| 39420.0 | 4339.1 |
| 39421.0 | 4410 |
| 39422.0 | 4414.65 |
| 39423.0 | 4446.34 |
| 39426.0 | 4465.52 |
| 39427.0 | 4449.95 |
| 39428.0 | 4469.47 |
| 39429.0 | 4370.76 |
| 39430.0 | 4384.65 |
| 39433.0 | 4312.47 |
| 39434.0 | 4309.15 |
| 39435.0 | 4301.33 |
| 39436.0 | 4314.7 |
| 39440.0 | 4388.38 |
| 39443.0 | 4404.61 |
| 39444.0 | 4404.64 |
| 39447.0 | 4399.72 |
| 39449.0 | 4339.23 |
| 39450.0 | 4333.42 |
| 39451.0 | 4270.53 |
| 39454.0 | 4283.37 |
| 39455.0 | 4295.23 |
| 39456.0 | 4258.32 |
| 39457.0 | 4237.62 |
| 39458.0 | 4225.31 |
| 39461.0 | 4236.68 |
| 39462.0 | 4140.94 |
| 39463.0 | 4108.34 |
| 39464.0 | 4065.76 |
| 39465.0 | 3995.17 |
| 39468.0 | 3703.05 |
| 39469.0 | 3753.68 |
| 39470.0 | 3577.99 |
| 39471.0 | 3809.07 |
| 39472.0 | 3777.06 |
| 39476.0 | 3810.01 |
| 39477.0 | 3789.31 |
| 39478.0 | 3792.8 |
| 39479.0 | 3867.47 |
| 39482.0 | 3867.16 |
| 39483.0 | 3717.08 |
| 39484.0 | 3760.12 |
| 39485.0 | 3699.29 |
| 39486.0 | 3701.17 |
| 39489.0 | 3678.16 |
| 39490.0 | 3803.76 |
| 39491.0 | 3803.21 |
| 39492.0 | 3797.89 |
| 39493.0 | 3719.28 |
| 39496.0 | 3795.12 |
| 39497.0 | 3805.27 |
| 39498.0 | 3758.47 |
| 39499.0 | 3778.21 |
| 39500.0 | 3737.11 |
| 39503.0 | 3798.99 |
| 39504.0 | 3855.03 |
| 39505.0 | 3856.69 |
| 39506.0 | 3784.27 |
| 39507.0 | 3724.5 |
| 39510.0 | 3675.51 |
| 39511.0 | 3610.2 |
| 39512.0 | 3684.54 |
| 39513.0 | 3617.68 |
| 39514.0 | 3576.68 |
| 39517.0 | 3546.1 |
| 39518.0 | 3606.59 |
| 39519.0 | 3647.64 |
| 39520.0 | 3599.58 |
| 39521.0 | 3566.59 |
| 39524.0 | 3431.82 |
| 39525.0 | 3558.66 |
| 39526.0 | 3529.54 |
| 39527.0 | 3505.9 |
| 39532.0 | 3632.59 |
| 39533.0 | 3611.45 |
| 39534.0 | 3652.11 |
| 39535.0 | 3641.05 |
| 39538.0 | 3628.06 |
| 39539.0 | 3753.55 |
| 39540.0 | 3797.9 |
| 39541.0 | 3774.94 |
| 39542.0 | 3795.2 |
| 39545.0 | 3828.46 |
| 39546.0 | 3810.51 |
| 39547.0 | 3775.93 |
| 39548.0 | 3758.05 |
| 39549.0 | 3699.99 |
| 39552.0 | 3671.28 |
| 39553.0 | 3690.75 |
| 39554.0 | 3748.56 |
| 39555.0 | 3725.23 |
| 39556.0 | 3808.59 |
| 39559.0 | 3769.89 |
| 39560.0 | 3736.12 |
| 39561.0 | 3763.55 |
| 39562.0 | 3761.96 |
| 39563.0 | 3794.39 |
| 39566.0 | 3814.76 |
| 39567.0 | 3793.63 |
| 39568.0 | 3825.02 |
| 39569.0 | 3825.02 |
| 39570.0 | 3877.5 |
| 39573.0 | 3872.15 |
| 39574.0 | 3845.08 |
| 39575.0 | 3871.78 |
| 39576.0 | 3855.86 |
| 39577.0 | 3801.59 |
| 39580.0 | 3812.69 |
| 39581.0 | 3817.07 |
| 39582.0 | 3857.46 |
| 39583.0 | 3854.86 |
| 39584.0 | 3862.91 |
| 39587.0 | 3882.28 |
| 39588.0 | 3822.31 |
| 39589.0 | 3794.13 |
| 39590.0 | 3793.03 |
| 39591.0 | 3725.82 |
| 39594.0 | 3724.9 |
| 39595.0 | 3711.03 |
| 39596.0 | 3743.18 |
| 39597.0 | 3752.24 |
| 39598.0 | 3777.85 |
| 39601.0 | 3720.5 |
| 39602.0 | 3737.34 |
| 39603.0 | 3699.05 |
| 39604.0 | 3682.83 |
| 39605.0 | 3596.7 |
| 39608.0 | 3597.34 |
| 39609.0 | 3574.7 |
| 39610.0 | 3509.39 |
| 39611.0 | 3542.59 |
| 39612.0 | 3562.67 |
| 39615.0 | 3532.83 |
| 39616.0 | 3555.58 |
| 39617.0 | 3507.97 |
| 39618.0 | 3486.71 |
| 39619.0 | 3426.58 |
| 39622.0 | 3427.33 |
| 39623.0 | 3404.52 |
| 39624.0 | 3460.4 |
| 39625.0 | 3366.35 |
| 39626.0 | 3340.27 |
| 39629.0 | 3352.81 |
| 39630.0 | 3292.86 |
| 39631.0 | 3288.52 |
| 39632.0 | 3330.9 |
| 39633.0 | 3275.2 |
| 39636.0 | 3332.66 |
| 39637.0 | 3287.6 |
| 39638.0 | 3342.48 |
| 39639.0 | 3283.01 |
| 39640.0 | 3197.78 |
| 39643.0 | 3216.24 |
| 39644.0 | 3142.73 |
| 39645.0 | 3174.76 |
| 39646.0 | 3256.09 |
| 39647.0 | 3321.53 |
| 39650.0 | 3333.92 |
| 39651.0 | 3326.24 |
| 39652.0 | 3387.5 |
| 39653.0 | 3354.58 |
| 39654.0 | 3351.13 |
| 39657.0 | 3313.41 |
| 39658.0 | 3324.86 |
| 39659.0 | 3367.33 |
| 39660.0 | 3367.82 |
| 39661.0 | 3316.61 |
| 39664.0 | 3289.26 |
| 39665.0 | 3380.09 |
| 39666.0 | 3409.02 |
| 39667.0 | 3397.25 |
| 39668.0 | 3408.48 |
| 39671.0 | 3445.66 |
| 39672.0 | 3436.85 |
| 39673.0 | 3354.75 |
| 39674.0 | 3356.84 |
| 39675.0 | 3367.62 |
| 39678.0 | 3366.09 |
| 39679.0 | 3279.75 |
| 39680.0 | 3295.28 |
| 39681.0 | 3248.92 |
| 39682.0 | 3312.41 |
| 39685.0 | 3280.41 |
| 39686.0 | 3297.42 |
| 39687.0 | 3299.15 |
| 39688.0 | 3359.42 |
| 39689.0 | 3365.63 |
| 39692.0 | 3364.4 |
| 39693.0 | 3416.46 |
| 39694.0 | 3368.97 |
| 39695.0 | 3274.82 |
| 39696.0 | 3185.83 |
| 39699.0 | 3284.12 |
| 39700.0 | 3261.07 |
| 39701.0 | 3242.02 |
| 39702.0 | 3222.1 |
| 39703.0 | 3278.02 |
| 39706.0 | 3151.17 |
| 39707.0 | 3088.43 |
| 39708.0 | 3018.77 |
| 39709.0 | 3000.83 |
| 39710.0 | 3253.52 |
| 39713.0 | 3181.77 |
| 39714.0 | 3139.83 |
| 39715.0 | 3119.83 |
| 39716.0 | 3207.11 |
| 39717.0 | 3156.46 |
| 39720.0 | 3008.19 |
| 39721.0 | 3038.2 |
| 39722.0 | 3067.35 |
| 39723.0 | 3007.51 |
| 39724.0 | 3113.82 |
| 39727.0 | 2868.97 |
| 39728.0 | 2879.45 |
| 39729.0 | 2694.55 |
| 39730.0 | 2629.04 |
| 39731.0 | 2421.87 |
| 39734.0 | 2688.32 |
| 39735.0 | 2756.74 |
| 39736.0 | 2578.06 |
| 39737.0 | 2423.8 |
| 39738.0 | 2532.17 |
| 39741.0 | 2613.68 |
| 39742.0 | 2598.97 |
| 39743.0 | 2457.97 |
| 39744.0 | 2452.03 |
| 39745.0 | 2333.28 |
| 39748.0 | 2293.04 |
| 39749.0 | 2381.68 |
| 39750.0 | 2515.24 |
| 39751.0 | 2528.04 |
| 39752.0 | 2591.76 |
| 39755.0 | 2610.04 |
| 39756.0 | 2755.12 |
| 39757.0 | 2710.65 |
| 39758.0 | 2542.04 |
| 39759.0 | 2602.54 |
| 39762.0 | 2625.84 |
| 39763.0 | 2483.61 |
| 39764.0 | 2400.74 |
| 39765.0 | 2429.94 |
| 39766.0 | 2456.43 |
| 39769.0 | 2364.83 |
| 39770.0 | 2390.1 |
| 39771.0 | 2295.36 |
| 39772.0 | 2225.99 |
| 39773.0 | 2165.91 |
| 39776.0 | 2380.3 |
| 39777.0 | 2385.9 |
| 39778.0 | 2373.82 |
| 39779.0 | 2427.97 |
| 39780.0 | 2430.31 |
| 39783.0 | 2288.39 |
| 39784.0 | 2354.13 |
| 39785.0 | 2369.52 |
| 39786.0 | 2368.72 |
| 39787.0 | 2252.09 |
| 39790.0 | 2449.28 |
| 39791.0 | 2480.79 |
| 39792.0 | 2495.58 |
| 39793.0 | 2485.39 |
| 39794.0 | 2418.91 |
| 39797.0 | 2407.47 |
| 39798.0 | 2450.36 |
| 39799.0 | 2444.46 |
| 39800.0 | 2452.42 |
| 39801.0 | 2444.14 |
| 39804.0 | 2397.65 |
| 39805.0 | 2382.14 |
| 39806.0 | 2377.42 |
| 39812.0 | 2451.48 |
| 39813.0 | 2447.62 |
| 39815.0 | 2536.47 |
| 39818.0 | 2553.41 |
| 39819.0 | 2578.43 |
| 39820.0 | 2538.55 |
| 39821.0 | 2516.56 |
| 39822.0 | 2486.59 |
| 39825.0 | 2451.87 |
| 39826.0 | 2411.28 |
| 39827.0 | 2298.46 |
| 39828.0 | 2257.67 |
| 39829.0 | 2281.45 |
| 39832.0 | 2252.39 |
| 39833.0 | 2200.8 |
| 39834.0 | 2188.43 |
| 39835.0 | 2160.07 |
| 39836.0 | 2147.87 |
| 39839.0 | 2226.77 |
| 39840.0 | 2224.62 |
| 39841.0 | 2322.78 |
| 39842.0 | 2269.4 |
| 39843.0 | 2236.98 |
| 39846.0 | 2198.74 |
| 39847.0 | 2244.89 |
| 39848.0 | 2297.73 |
| 39849.0 | 2293.23 |
| 39850.0 | 2343.66 |
| 39853.0 | 2348.95 |
| 39854.0 | 2268.15 |
| 39855.0 | 2267.9 |
| 39856.0 | 2214.95 |
| 39857.0 | 2228.29 |
| 39860.0 | 2193.64 |
| 39861.0 | 2119.98 |
| 39862.0 | 2118.47 |
| 39863.0 | 2114.84 |
| 39864.0 | 2011.68 |
| 39867.0 | 1991.63 |
| 39868.0 | 1977.5 |
| 39869.0 | 1965.26 |
| 39870.0 | 2021.14 |
| 39871.0 | 1976.23 |
| 39874.0 | 1882.79 |
| 39875.0 | 1864.73 |
| 39876.0 | 1943.46 |
| 39877.0 | 1852.25 |
| 39878.0 | 1817.24 |
| 39881.0 | 1809.98 |
| 39882.0 | 1919.53 |
| 39883.0 | 1932.79 |
| 39884.0 | 1962.64 |
| 39885.0 | 1969.52 |
| 39888.0 | 2033.72 |
| 39889.0 | 2012.25 |
| 39890.0 | 2019.19 |
| 39891.0 | 2039.58 |
| 39892.0 | 2050.96 |
| 39895.0 | 2121.72 |
| 39896.0 | 2127.37 |
| 39897.0 | 2149.18 |
| 39898.0 | 2156.97 |
| 39899.0 | 2118.76 |
| 39902.0 | 2010.61 |
| 39903.0 | 2071.13 |
| 39904.0 | 2097.57 |
| 39905.0 | 2216.49 |
| 39906.0 | 2198.75 |
| 39909.0 | 2179.73 |
| 39910.0 | 2165.56 |
| 39911.0 | 2186.79 |
| 39912.0 | 2247.89 |
| 39917.0 | 2278.65 |
| 39918.0 | 2262.96 |
| 39919.0 | 2300.51 |
| 39920.0 | 2341.15 |
| 39923.0 | 2249.44 |
| 39924.0 | 2243.63 |
| 39925.0 | 2285.69 |
| 39926.0 | 2259.54 |
| 39927.0 | 2319.89 |
| 39930.0 | 2317.36 |
| 39931.0 | 2280.52 |
| 39932.0 | 2334.59 |
| 39933.0 | 2375.34 |
| 39934.0 | 2375.34 |
| 39937.0 | 2419.53 |
| 39938.0 | 2407.55 |
| 39939.0 | 2437.27 |
| 39940.0 | 2406.08 |
| 39941.0 | 2462.39 |
| 39944.0 | 2433.59 |
| 39945.0 | 2424.34 |
| 39946.0 | 2357.3 |
| 39947.0 | 2353.53 |
| 39948.0 | 2364.1 |
| 39951.0 | 2422.74 |
| 39952.0 | 2459.59 |
| 39953.0 | 2487.17 |
| 39954.0 | 2423.72 |
| 39955.0 | 2433.52 |
| 39958.0 | 2440.23 |
| 39959.0 | 2468.45 |
| 39960.0 | 2479.48 |
| 39961.0 | 2453.15 |
| 39962.0 | 2451.24 |
| 39965.0 | 2537.35 |
| 39966.0 | 2534.17 |
| 39967.0 | 2483.39 |
| 39968.0 | 2487.08 |
| 39969.0 | 2503.17 |
| 39972.0 | 2468.37 |
| 39973.0 | 2479.38 |
| 39974.0 | 2500.94 |
| 39975.0 | 2522.33 |
| 39976.0 | 2509.22 |
| 39979.0 | 2431.4 |
| 39980.0 | 2425.97 |
| 39981.0 | 2383.71 |
| 39982.0 | 2414.44 |
| 39983.0 | 2434.77 |
| 39986.0 | 2359.28 |
| 39987.0 | 2353.48 |
| 39988.0 | 2418.46 |
| 39989.0 | 2402.32 |
| 39990.0 | 2389.91 |
| 39993.0 | 2437.72 |
| 39994.0 | 2401.69 |
| 39995.0 | 2449.73 |
| 39996.0 | 2369.65 |
| 39997.0 | 2376.48 |
| 40000.0 | 2343.88 |
| 40001.0 | 2320.9 |
| 40002.0 | 2291.33 |
| 40003.0 | 2313.87 |
| 40004.0 | 2281.47 |
| 40007.0 | 2345.22 |
| 40008.0 | 2370.71 |
| 40009.0 | 2451.02 |
| 40010.0 | 2458.97 |
| 40011.0 | 2469.2 |
| 40014.0 | 2500.69 |
| 40015.0 | 2519.99 |
| 40016.0 | 2528.85 |
| 40017.0 | 2585.79 |
| 40018.0 | 2582.76 |
| 40021.0 | 2601.41 |
| 40022.0 | 2573.08 |
| 40023.0 | 2600.31 |
| 40024.0 | 2654.74 |
| 40025.0 | 2638.13 |
| 40028.0 | 2674.07 |
| 40029.0 | 2670.96 |
| 40030.0 | 2643.13 |
| 40031.0 | 2662.01 |
| 40032.0 | 2706.22 |
| 40035.0 | 2693.61 |
| 40036.0 | 2650.94 |
| 40037.0 | 2688.21 |
| 40038.0 | 2705.74 |
| 40039.0 | 2669.41 |
| 40042.0 | 2603.79 |
| 40043.0 | 2630.6 |
| 40044.0 | 2622.88 |
| 40045.0 | 2663.67 |
| 40046.0 | 2745.62 |
| 40049.0 | 2778.34 |
| 40050.0 | 2801.14 |
| 40051.0 | 2788.9 |
| 40052.0 | 2777.62 |
| 40053.0 | 2803.65 |
| 40056.0 | 2775.17 |
| 40057.0 | 2715.74 |
| 40058.0 | 2703.76 |
| 40059.0 | 2699.22 |
| 40060.0 | 2743.34 |
| 40063.0 | 2783.84 |
| 40064.0 | 2786.25 |
| 40065.0 | 2820.58 |
| 40066.0 | 2817.5 |
| 40067.0 | 2831.37 |
| 40070.0 | 2829.25 |
| 40071.0 | 2843 |
| 40072.0 | 2882.28 |
| 40073.0 | 2895.45 |
| 40074.0 | 2887.24 |
| 40077.0 | 2872.51 |
| 40078.0 | 2881.6 |
| 40079.0 | 2887.24 |
| 40080.0 | 2838.22 |
| 40081.0 | 2831.95 |
| 40084.0 | 2899.12 |
| 40085.0 | 2892.44 |
| 40086.0 | 2872.63 |
| 40087.0 | 2810.46 |
| 40088.0 | 2760.6 |
| 40091.0 | 2790.78 |
| 40092.0 | 2865.7 |
| 40093.0 | 2852.17 |
| 40094.0 | 2887.61 |
| 40095.0 | 2882.18 |
| 40098.0 | 2914.35 |
| 40099.0 | 2879.06 |
| 40100.0 | 2950.82 |
| 40101.0 | 2939.09 |
| 40102.0 | 2893.53 |
| 40105.0 | 2947.41 |
| 40106.0 | 2925.08 |
| 40107.0 | 2936.83 |
| 40108.0 | 2902.19 |
| 40109.0 | 2886.08 |
| 40112.0 | 2834.82 |
| 40113.0 | 2835.17 |
| 40114.0 | 2778.46 |
| 40115.0 | 2824.78 |
| 40116.0 | 2743.5 |
| 40119.0 | 2762.95 |
| 40120.0 | 2712.3 |
| 40121.0 | 2763.29 |
| 40122.0 | 2793.44 |
| 40123.0 | 2794.25 |
| 40126.0 | 2860.11 |
| 40127.0 | 2856.44 |
| 40128.0 | 2881.01 |
| 40129.0 | 2876.92 |
| 40130.0 | 2883.04 |
| 40133.0 | 2926.15 |
| 40134.0 | 2906.92 |
| 40135.0 | 2908.53 |
| 40136.0 | 2860.29 |
| 40137.0 | 2833.06 |
| 40140.0 | 2898.19 |
| 40141.0 | 2877.58 |
| 40142.0 | 2896.9 |
| 40143.0 | 2799.44 |
| 40144.0 | 2831.14 |
| 40147.0 | 2797.25 |
| 40148.0 | 2871.75 |
| 40149.0 | 2877.94 |
| 40150.0 | 2876.14 |
| 40151.0 | 2910.33 |
| 40154.0 | 2896.23 |
| 40155.0 | 2849.17 |
| 40156.0 | 2818.1 |
| 40157.0 | 2851.29 |
| 40158.0 | 2862.32 |
| 40161.0 | 2885 |
| 40162.0 | 2888.58 |
| 40163.0 | 2926.52 |
| 40164.0 | 2891.66 |
| 40165.0 | 2871.22 |
| 40168.0 | 2926.05 |
| 40169.0 | 2945.71 |
| 40170.0 | 2957.48 |
| 40171.0 | 2957.03 |
| 40175.0 | 2982.42 |
| 40176.0 | 2992.08 |
| 40177.0 | 2966.24 |
| 40178.0 | 2964.96 |
| 40182.0 | 3017.8 |
| 40183.0 | 3012.36 |
| 40184.0 | 3009.66 |
| 40185.0 | 3007.34 |
| 40186.0 | 3017.85 |
| 40189.0 | 3010.24 |
| 40190.0 | 2976.89 |
| 40191.0 | 2978.41 |
| 40192.0 | 2989.71 |
| 40193.0 | 2940.25 |
| 40196.0 | 2957.87 |
| 40197.0 | 2984.82 |
| 40198.0 | 2914.6 |
| 40199.0 | 2863.25 |
| 40200.0 | 2836.8 |
| 40203.0 | 2807.3 |
| 40204.0 | 2827.74 |
| 40205.0 | 2787.4 |
| 40206.0 | 2737.33 |
| 40207.0 | 2776.83 |
| 40210.0 | 2793.29 |
| 40211.0 | 2830.01 |
| 40212.0 | 2804.61 |
| 40213.0 | 2707.45 |
| 40214.0 | 2631.64 |
| 40217.0 | 2664.29 |
| 40218.0 | 2668.43 |
| 40219.0 | 2700.17 |
| 40220.0 | 2680.25 |
| 40221.0 | 2674.46 |
| 40224.0 | 2683.83 |
| 40225.0 | 2720.77 |
| 40226.0 | 2762.25 |
| 40227.0 | 2778.3 |
| 40228.0 | 2793.37 |
| 40231.0 | 2778.12 |
| 40232.0 | 2730.57 |
| 40233.0 | 2734.95 |
| 40234.0 | 2684.42 |
| 40235.0 | 2728.47 |
| 40238.0 | 2772.7 |
| 40239.0 | 2784 |
| 40240.0 | 2822.59 |
| 40241.0 | 2816.1 |
| 40242.0 | 2877.44 |
| 40245.0 | 2879.29 |
| 40246.0 | 2880.71 |
| 40247.0 | 2909.4 |
| 40248.0 | 2895.74 |
| 40249.0 | 2898.36 |
| 40252.0 | 2870.55 |
| 40253.0 | 2905.93 |
| 40254.0 | 2931.31 |
| 40255.0 | 2913.74 |
| 40256.0 | 2897.95 |
| 40259.0 | 2890.75 |
| 40260.0 | 2910.52 |
| 40261.0 | 2900.14 |
| 40262.0 | 2939.9 |
| 40263.0 | 2940.94 |
| 40266.0 | 2947.49 |
| 40267.0 | 2939.68 |
| 40268.0 | 2931.16 |
| 40269.0 | 2978.5 |
| 40274.0 | 2989.49 |
| 40275.0 | 2974.62 |
| 40276.0 | 2942.31 |
| 40277.0 | 2993.54 |
| 40280.0 | 3002.23 |
| 40281.0 | 2988.24 |
| 40282.0 | 3008.03 |
| 40283.0 | 3012.65 |
| 40284.0 | 2949.65 |
| 40287.0 | 2940.19 |
| 40288.0 | 2983.91 |
| 40289.0 | 2947.64 |
| 40290.0 | 2897.59 |
| 40291.0 | 2918.11 |
| 40294.0 | 2947.04 |
| 40295.0 | 2838.78 |
| 40296.0 | 2788.54 |
| 40297.0 | 2828.12 |
| 40298.0 | 2816.86 |
| 40301.0 | 2816.5 |
| 40302.0 | 2708.12 |
| 40303.0 | 2679.3 |
| 40304.0 | 2611.41 |
| 40305.0 | 2500.18 |
| 40308.0 | 2758.89 |
| 40309.0 | 2730.48 |
| 40310.0 | 2764.31 |
| 40311.0 | 2764.05 |
| 40312.0 | 2633.92 |
| 40315.0 | 2635.34 |
| 40316.0 | 2698.21 |
| 40317.0 | 2619.48 |
| 40318.0 | 2569.58 |
| 40319.0 | 2574.18 |
| 40322.0 | 2558.27 |
| 40323.0 | 2488.5 |
| 40324.0 | 2530.34 |
| 40325.0 | 2619.36 |
| 40326.0 | 2614.06 |
| 40329.0 | 2610.26 |
| 40330.0 | 2606.58 |
| 40331.0 | 2601.98 |
| 40332.0 | 2634.16 |
| 40333.0 | 2553.59 |
| 40336.0 | 2529.97 |
| 40337.0 | 2510.84 |
| 40338.0 | 2556.68 |
| 40339.0 | 2608.74 |
| 40340.0 | 2638.31 |
| 40343.0 | 2683.46 |
| 40344.0 | 2716.3 |
| 40345.0 | 2718.73 |
| 40346.0 | 2728.12 |
| 40347.0 | 2737.02 |
| 40350.0 | 2768.27 |
| 40351.0 | 2745.97 |
| 40352.0 | 2704.8 |
| 40353.0 | 2645.32 |
| 40354.0 | 2629.25 |
| 40357.0 | 2668.67 |
| 40358.0 | 2556.34 |
| 40359.0 | 2573.32 |
| 40360.0 | 2518.65 |
| 40361.0 | 2522.36 |
| 40364.0 | 2507.83 |
| 40365.0 | 2578.69 |
| 40366.0 | 2634.39 |
| 40367.0 | 2666.42 |
| 40368.0 | 2681.2 |
| 40371.0 | 2686.09 |
| 40372.0 | 2737.59 |
| 40373.0 | 2738.96 |
| 40374.0 | 2702.81 |
| 40375.0 | 2645.61 |
| 40378.0 | 2634.6 |
| 40379.0 | 2627.28 |
| 40380.0 | 2639.52 |
| 40381.0 | 2714.21 |
| 40382.0 | 2719.13 |
| 40385.0 | 2743.12 |
| 40386.0 | 2769.31 |
| 40387.0 | 2766.11 |
| 40388.0 | 2752.93 |
| 40389.0 | 2742.14 |
| 40392.0 | 2822.17 |
| 40393.0 | 2818.97 |
| 40394.0 | 2825.08 |
| 40395.0 | 2819.34 |
| 40396.0 | 2779.34 |
| 40399.0 | 2827.27 |
| 40400.0 | 2800.02 |
| 40401.0 | 2724.16 |
| 40402.0 | 2720.85 |
| 40403.0 | 2708.73 |
| 40406.0 | 2698.29 |
| 40407.0 | 2737.69 |
| 40408.0 | 2728.66 |
| 40409.0 | 2675.02 |
| 40410.0 | 2643.98 |
| 40413.0 | 2660.84 |
| 40414.0 | 2614.54 |
| 40415.0 | 2587.4 |
| 40416.0 | 2606.89 |
| 40417.0 | 2630.35 |
| 40420.0 | 2616.57 |
| 40421.0 | 2622.95 |
| 40422.0 | 2715.27 |
| 40423.0 | 2715.19 |
| 40424.0 | 2746.23 |
| 40427.0 | 2753.6 |
| 40428.0 | 2727.16 |
| 40429.0 | 2752.89 |
| 40430.0 | 2782.43 |
| 40431.0 | 2780.4 |
| 40434.0 | 2805.06 |
| 40435.0 | 2806.47 |
| 40436.0 | 2794.36 |
| 40437.0 | 2784.61 |
| 40438.0 | 2757.37 |
| 40441.0 | 2802.67 |
| 40442.0 | 2794.55 |
| 40443.0 | 2752.77 |
| 40444.0 | 2738.61 |
| 40445.0 | 2792.75 |
| 40448.0 | 2776.33 |
| 40449.0 | 2774.62 |
| 40450.0 | 2752.71 |
| 40451.0 | 2747.9 |
| 40452.0 | 2732.91 |
| 40455.0 | 2701.02 |
| 40456.0 | 2758.56 |
| 40457.0 | 2780 |
| 40458.0 | 2786.88 |
| 40459.0 | 2785.43 |
| 40462.0 | 2789.72 |
| 40463.0 | 2775.75 |
| 40464.0 | 2840.55 |
| 40465.0 | 2836.11 |
| 40466.0 | 2841.65 |
| 40469.0 | 2850.72 |
| 40470.0 | 2837.33 |
| 40471.0 | 2851.52 |
| 40472.0 | 2882.29 |
| 40473.0 | 2873.74 |
| 40476.0 | 2871.48 |
| 40477.0 | 2856.31 |
| 40478.0 | 2829.42 |
| 40479.0 | 2845.53 |
| 40480.0 | 2844.99 |
| 40483.0 | 2836.73 |
| 40484.0 | 2861.01 |
| 40485.0 | 2830.43 |
| 40486.0 | 2884.12 |
| 40487.0 | 2875.94 |
| 40490.0 | 2867.96 |
| 40491.0 | 2890.64 |
| 40492.0 | 2845.93 |
| 40493.0 | 2831.22 |
| 40494.0 | 2822.43 |
| 40497.0 | 2848.45 |
| 40498.0 | 2781.77 |
| 40499.0 | 2802.7 |
| 40500.0 | 2855.23 |
| 40501.0 | 2845.75 |
| 40504.0 | 2811.43 |
| 40505.0 | 2739.37 |
| 40506.0 | 2758.02 |
| 40507.0 | 2765.05 |
| 40508.0 | 2736.96 |
| 40511.0 | 2669.96 |
| 40512.0 | 2650.99 |
| 40513.0 | 2721.87 |
| 40514.0 | 2781.39 |
| 40515.0 | 2782.39 |
| 40518.0 | 2769.96 |
| 40519.0 | 2802.74 |
| 40520.0 | 2818.95 |
| 40521.0 | 2840.71 |
| 40522.0 | 2839.53 |
| 40525.0 | 2855.37 |
| 40526.0 | 2861.67 |
| 40527.0 | 2831.88 |
| 40528.0 | 2845.78 |
| 40529.0 | 2821.77 |
| 40532.0 | 2839.22 |
| 40533.0 | 2876.99 |
| 40534.0 | 2869.63 |
| 40535.0 | 2864.52 |
| 40536.0 | 2861.94 |
| 40539.0 | 2826.51 |
| 40540.0 | 2824.3 |
| 40541.0 | 2841.23 |
| 40542.0 | 2807.04 |
| 40543.0 | 2792.82 |
| 40546.0 | 2839.43 |
| 40547.0 | 2844.17 |
| 40548.0 | 2833.74 |
| 40549.0 | 2836.23 |
| 40550.0 | 2808.25 |
| 40553.0 | 2760.88 |
| 40554.0 | 2796.6 |
| 40555.0 | 2879.11 |
| 40556.0 | 2915.62 |
| 40557.0 | 2920.4 |
| 40560.0 | 2910.63 |
| 40561.0 | 2945.62 |
| 40562.0 | 2923.76 |
| 40563.0 | 2927.42 |
| 40564.0 | 2970.56 |
| 40567.0 | 2979.06 |
| 40568.0 | 2957.78 |
| 40569.0 | 2967.78 |
| 40570.0 | 2989.75 |
| 40571.0 | 2954.13 |
| 40574.0 | 2953.63 |
| 40575.0 | 3006.81 |
| 40576.0 | 3012.7 |
| 40577.0 | 2995.49 |
| 40578.0 | 3003.19 |
| 40581.0 | 3031.18 |
| 40582.0 | 3042.5 |
| 40583.0 | 3031.62 |
| 40584.0 | 3025.68 |
| 40585.0 | 3024.36 |
| 40588.0 | 3018.38 |
| 40589.0 | 3030.46 |
| 40590.0 | 3061.92 |
| 40591.0 | 3064.54 |
| 40592.0 | 3068 |
| 40595.0 | 3012.34 |
| 40596.0 | 2983.33 |
| 40597.0 | 2954.92 |
| 40598.0 | 2949.13 |
| 40599.0 | 2985.02 |
| 40602.0 | 3013.09 |
| 40603.0 | 2983.27 |
| 40604.0 | 2958.8 |
| 40605.0 | 2969.24 |
| 40606.0 | 2949.18 |
| 40609.0 | 2931.42 |
| 40610.0 | 2945.42 |
| 40611.0 | 2935.11 |
| 40612.0 | 2909.73 |
| 40613.0 | 2883.84 |
| 40616.0 | 2852.11 |
| 40617.0 | 2784.2 |
| 40618.0 | 2721.24 |
| 40619.0 | 2786.16 |
| 40620.0 | 2792.61 |
| 40623.0 | 2860.81 |
| 40624.0 | 2854.79 |
| 40625.0 | 2866.23 |
| 40626.0 | 2909.78 |
| 40627.0 | 2911.33 |
| 40630.0 | 2914.76 |
| 40631.0 | 2910.93 |
| 40632.0 | 2936.44 |
| 40633.0 | 2910.91 |
| 40634.0 | 2962.92 |
| 40637.0 | 2955.84 |
| 40638.0 | 2950.96 |
| 40639.0 | 2971.48 |
| 40640.0 | 2963.69 |
| 40641.0 | 2984.66 |
| 40644.0 | 2974.58 |
| 40645.0 | 2932.33 |
| 40646.0 | 2949.98 |
| 40647.0 | 2917.72 |
| 40648.0 | 2919.05 |
| 40651.0 | 2847.96 |
| 40652.0 | 2857.61 |
| 40653.0 | 2921.43 |
| 40654.0 | 2936.3 |
| 40659.0 | 2955.36 |
| 40660.0 | 2977.59 |
| 40661.0 | 3005.33 |
| 40662.0 | 3011.25 |
| 40665.0 | 3008.89 |
| 40666.0 | 3000.39 |
| 40667.0 | 2952.02 |
| 40668.0 | 2926.54 |
| 40669.0 | 2952.9 |
| 40672.0 | 2902.4 |
| 40673.0 | 2939.02 |
| 40674.0 | 2942.43 |
| 40675.0 | 2917.05 |
| 40676.0 | 2894.6 |
| 40679.0 | 2881.31 |
| 40680.0 | 2849.6 |
| 40681.0 | 2867.3 |
| 40682.0 | 2890.6 |
| 40683.0 | 2853.98 |
| 40686.0 | 2794.26 |
| 40687.0 | 2801.27 |
| 40688.0 | 2816.84 |
| 40689.0 | 2799.82 |
| 40690.0 | 2819.4 |
| 40693.0 | 2814.34 |
| 40694.0 | 2861.92 |
| 40695.0 | 2827.66 |
| 40696.0 | 2782.57 |
| 40697.0 | 2789.11 |
| 40700.0 | 2765.33 |
| 40701.0 | 2774.5 |
| 40702.0 | 2752.06 |
| 40703.0 | 2778.12 |
| 40704.0 | 2732.54 |
| 40707.0 | 2733.95 |
| 40708.0 | 2779.94 |
| 40709.0 | 2731.5 |
| 40710.0 | 2730.62 |
| 40711.0 | 2770.12 |
| 40714.0 | 2748.01 |
| 40715.0 | 2801.99 |
| 40716.0 | 2795.07 |
| 40717.0 | 2730.86 |
| 40718.0 | 2715.88 |
| 40721.0 | 2723.93 |
| 40722.0 | 2750.49 |
| 40723.0 | 2802.55 |
| 40724.0 | 2848.53 |
| 40725.0 | 2875.67 |
| 40728.0 | 2870.19 |
| 40729.0 | 2850.51 |
| 40730.0 | 2832.63 |
| 40731.0 | 2844.51 |
| 40732.0 | 2790.09 |
| 40735.0 | 2709.15 |
| 40736.0 | 2693.53 |
| 40737.0 | 2715.05 |
| 40738.0 | 2695.29 |
| 40739.0 | 2675.38 |
| 40742.0 | 2622.36 |
| 40743.0 | 2657.45 |
| 40744.0 | 2705.75 |
| 40745.0 | 2763.34 |
| 40746.0 | 2772.6 |
| 40749.0 | 2742.7 |
| 40750.0 | 2739.65 |
| 40751.0 | 2693.71 |
| 40752.0 | 2692.76 |
| 40753.0 | 2670.37 |
| 40756.0 | 2593.34 |
| 40757.0 | 2544.89 |
| 40758.0 | 2497.83 |
| 40759.0 | 2412.29 |
| 40760.0 | 2375.15 |
| 40763.0 | 2286.91 |
| 40764.0 | 2294.24 |
| 40765.0 | 2153.77 |
| 40766.0 | 2215.45 |
| 40767.0 | 2307.33 |
| 40770.0 | 2324.48 |
| 40771.0 | 2323.67 |
| 40772.0 | 2331.12 |
| 40773.0 | 2206.61 |
| 40774.0 | 2159.07 |
| 40777.0 | 2183.39 |
| 40778.0 | 2199.98 |
| 40779.0 | 2238.7 |
| 40780.0 | 2216.7 |
| 40781.0 | 2190.44 |
| 40784.0 | 2239.3 |
| 40785.0 | 2239.14 |
| 40786.0 | 2302.08 |
| 40787.0 | 2305.75 |
| 40788.0 | 2220.72 |
| 40791.0 | 2107.27 |
| 40792.0 | 2080.1 |
| 40793.0 | 2151.16 |
| 40794.0 | 2163.4 |
| 40795.0 | 2073.67 |
| 40798.0 | 1995.01 |
| 40799.0 | 2036.64 |
| 40800.0 | 2083.38 |
| 40801.0 | 2155.62 |
| 40802.0 | 2159.28 |
| 40805.0 | 2096.1 |
| 40806.0 | 2140.41 |
| 40807.0 | 2098.49 |
| 40808.0 | 1995.75 |
| 40809.0 | 2026.03 |
| 40812.0 | 2083.35 |
| 40813.0 | 2194.03 |
| 40814.0 | 2176.64 |
| 40815.0 | 2212.44 |
| 40816.0 | 2179.66 |
| 40819.0 | 2138.24 |
| 40820.0 | 2091.09 |
| 40821.0 | 2179.42 |
| 40822.0 | 2248.78 |
| 40823.0 | 2269.19 |
| 40826.0 | 2320.8 |
| 40827.0 | 2315.97 |
| 40828.0 | 2372.15 |
| 40829.0 | 2332.52 |
| 40830.0 | 2355.48 |
| 40833.0 | 2315.89 |
| 40834.0 | 2306.81 |
| 40835.0 | 2330.08 |
| 40836.0 | 2271.77 |
| 40837.0 | 2337.51 |
| 40840.0 | 2369.07 |
| 40841.0 | 2343.96 |
| 40842.0 | 2335.06 |
| 40843.0 | 2476.92 |
| 40844.0 | 2462.36 |
| 40847.0 | 2385.22 |
| 40848.0 | 2259.73 |
| 40849.0 | 2291.89 |
| 40850.0 | 2347.94 |
| 40851.0 | 2291.47 |
| 40854.0 | 2275.92 |
| 40855.0 | 2303.2 |
| 40856.0 | 2249.39 |
| 40857.0 | 2254.92 |
| 40858.0 | 2324.81 |
| 40861.0 | 2288.32 |
| 40862.0 | 2254 |
| 40863.0 | 2267.96 |
| 40864.0 | 2242.78 |
| 40865.0 | 2236.68 |
| 40868.0 | 2160.28 |
| 40869.0 | 2136.81 |
| 40870.0 | 2096.79 |
| 40871.0 | 2090.25 |
| 40872.0 | 2111.26 |
| 40875.0 | 2221.76 |
| 40876.0 | 2234.17 |
| 40877.0 | 2330.43 |
| 40878.0 | 2313.84 |
| 40879.0 | 2342.5 |
| 40882.0 | 2369.39 |
| 40883.0 | 2356.71 |
| 40884.0 | 2344.92 |
| 40885.0 | 2288.05 |
| 40886.0 | 2342.59 |
| 40889.0 | 2269.46 |
| 40890.0 | 2260.98 |
| 40891.0 | 2205.91 |
| 40892.0 | 2224.89 |
| 40893.0 | 2202.72 |
| 40896.0 | 2202.95 |
| 40897.0 | 2262.39 |
| 40898.0 | 2244.35 |
| 40899.0 | 2273.02 |
| 40900.0 | 2290.37 |
| 40904.0 | 2290.31 |
| 40905.0 | 2255.03 |
| 40906.0 | 2292.28 |
| 40907.0 | 2316.55 |
| 40910.0 | 2370.2 |
| 40911.0 | 2389.91 |
| 40912.0 | 2349.89 |
| 40913.0 | 2315.75 |
| 40914.0 | 2298.65 |
| 40917.0 | 2286.45 |
| 40918.0 | 2347.47 |
| 40919.0 | 2339.51 |
| 40920.0 | 2345.85 |
| 40921.0 | 2338.01 |
| 40924.0 | 2361.56 |
| 40925.0 | 2396.63 |
| 40926.0 | 2390.64 |
| 40927.0 | 2435.04 |
| 40928.0 | 2426.96 |
| 40931.0 | 2441.44 |
| 40932.0 | 2432.07 |
| 40933.0 | 2421.12 |
| 40934.0 | 2460.4 |
| 40935.0 | 2436.62 |
| 40938.0 | 2404.62 |
| 40939.0 | 2416.66 |
| 40940.0 | 2470.79 |
| 40941.0 | 2478.15 |
| 40942.0 | 2515.15 |
| 40945.0 | 2507.89 |
| 40946.0 | 2514.12 |
| 40947.0 | 2512.92 |
| 40948.0 | 2522.34 |
| 40949.0 | 2480.76 |
| 40952.0 | 2491.54 |
| 40953.0 | 2488.29 |
| 40954.0 | 2493.96 |
| 40955.0 | 2489.34 |
| 40956.0 | 2520.31 |
| 40959.0 | 2550.28 |
| 40960.0 | 2541.6 |
| 40961.0 | 2519 |
| 40962.0 | 2508.08 |
| 40963.0 | 2523.69 |
| 40966.0 | 2513.06 |
| 40967.0 | 2519.72 |
| 40968.0 | 2512.11 |
| 40969.0 | 2548.66 |
| 40970.0 | 2546.16 |
| 40973.0 | 2529.86 |
| 40974.0 | 2443.52 |
| 40975.0 | 2460.77 |
| 40976.0 | 2514.22 |
| 40977.0 | 2515.95 |
| 40980.0 | 2514.97 |
| 40981.0 | 2556.82 |
| 40982.0 | 2574.79 |
| 40983.0 | 2593.97 |
| 40984.0 | 2608.3 |
| 40987.0 | 2608.42 |
| 40988.0 | 2576.61 |
| 40989.0 | 2567.58 |
| 40990.0 | 2530.22 |
| 40991.0 | 2525.43 |
| 40994.0 | 2539.87 |
| 40995.0 | 2525.21 |
| 40996.0 | 2496.69 |
| 40997.0 | 2452.74 |
| 40998.0 | 2477.28 |
| 41001.0 | 2501.18 |
| 41002.0 | 2458.98 |
| 41003.0 | 2398.46 |
| 41004.0 | 2392.54 |
| 41009.0 | 2321.53 |
| 41010.0 | 2341.36 |
| 41011.0 | 2352.24 |
| 41012.0 | 2291.51 |
| 41015.0 | 2301.19 |
| 41016.0 | 2367.05 |
| 41017.0 | 2327.84 |
| 41018.0 | 2284.67 |
| 41019.0 | 2311.27 |
| 41022.0 | 2244.83 |
| 41023.0 | 2284.08 |
| 41024.0 | 2322.91 |
| 41025.0 | 2322.69 |
| 41026.0 | 2344.02 |
| 41029.0 | 2306.43 |
| 41030.0 | 2306.69 |
| 41031.0 | 2290.31 |
| 41032.0 | 2287.1 |
| 41033.0 | 2248.34 |
| 41036.0 | 2283.09 |
| 41037.0 | 2236.11 |
| 41038.0 | 2225.63 |
| 41039.0 | 2247.38 |
| 41040.0 | 2254.54 |
| 41043.0 | 2201.95 |
| 41044.0 | 2178.67 |
| 41045.0 | 2175.34 |
| 41046.0 | 2146.91 |
| 41047.0 | 2144.69 |
| 41050.0 | 2150.16 |
| 41051.0 | 2192.85 |
| 41052.0 | 2134.05 |
| 41053.0 | 2156.52 |
| 41054.0 | 2161.87 |
| 41057.0 | 2147.92 |
| 41058.0 | 2160.31 |
| 41059.0 | 2116.18 |
| 41060.0 | 2118.94 |
| 41061.0 | 2068.66 |
| 41064.0 | 2078.96 |
| 41065.0 | 2087.31 |
| 41066.0 | 2137.73 |
| 41067.0 | 2143.08 |
| 41068.0 | 2143.9 |
| 41071.0 | 2137.7 |
| 41072.0 | 2143.38 |
| 41073.0 | 2143.5 |
| 41074.0 | 2148.21 |
| 41075.0 | 2181.23 |
| 41078.0 | 2155.64 |
| 41079.0 | 2198.01 |
| 41080.0 | 2207.49 |
| 41081.0 | 2199.42 |
| 41082.0 | 2186.81 |
| 41085.0 | 2130.71 |
| 41086.0 | 2127.95 |
| 41087.0 | 2165.61 |
| 41088.0 | 2157.62 |
| 41089.0 | 2264.72 |
| 41092.0 | 2292.08 |
| 41093.0 | 2320.43 |
| 41094.0 | 2312.41 |
| 41095.0 | 2284.92 |
| 41096.0 | 2235.51 |
| 41099.0 | 2227.91 |
| 41100.0 | 2241.85 |
| 41101.0 | 2246.23 |
| 41102.0 | 2228.01 |
| 41103.0 | 2259.09 |
| 41106.0 | 2251.96 |
| 41107.0 | 2250.75 |
| 41108.0 | 2284.7 |
| 41109.0 | 2302.45 |
| 41110.0 | 2237.33 |
| 41113.0 | 2179.31 |
| 41114.0 | 2151.54 |
| 41115.0 | 2159.09 |
| 41116.0 | 2251.05 |
| 41117.0 | 2301.23 |
| 41120.0 | 2340.31 |
| 41121.0 | 2325.72 |
| 41122.0 | 2333.38 |
| 41123.0 | 2263.36 |
| 41124.0 | 2372.58 |
| 41127.0 | 2399.32 |
| 41128.0 | 2440.24 |
| 41129.0 | 2432.28 |
| 41130.0 | 2437.04 |
| 41131.0 | 2423.22 |
| 41134.0 | 2415.96 |
| 41135.0 | 2432.29 |
| 41136.0 | 2430.39 |
| 41137.0 | 2456.53 |
| 41138.0 | 2471.53 |
| 41141.0 | 2466.32 |
| 41142.0 | 2490.27 |
| 41143.0 | 2452.73 |
| 41144.0 | 2429.17 |
| 41145.0 | 2434.23 |
| 41148.0 | 2461.82 |
| 41149.0 | 2442.12 |
| 41150.0 | 2434.23 |
| 41151.0 | 2403.8 |
| 41152.0 | 2440.71 |
| 41155.0 | 2463.17 |
| 41156.0 | 2436.54 |
| 41157.0 | 2441.81 |
| 41158.0 | 2524.95 |
| 41159.0 | 2538.6 |
| 41162.0 | 2528.53 |
| 41163.0 | 2557.65 |
| 41164.0 | 2564.8 |
| 41165.0 | 2543.22 |
| 41166.0 | 2594.56 |
| 41169.0 | 2583.57 |
| 41170.0 | 2553.4 |
| 41171.0 | 2567.67 |
| 41172.0 | 2553.03 |
| 41173.0 | 2577.08 |
| 41176.0 | 2557.89 |
| 41177.0 | 2568.48 |
| 41178.0 | 2498.52 |
| 41179.0 | 2506.06 |
| 41180.0 | 2454.26 |
| 41183.0 | 2498.81 |
| 41184.0 | 2493.59 |
| 41185.0 | 2492.48 |
| 41186.0 | 2485.75 |
| 41187.0 | 2531.21 |
| 41190.0 | 2496.09 |
| 41191.0 | 2472.23 |
| 41192.0 | 2456.54 |
| 41193.0 | 2487.08 |
| 41194.0 | 2469.09 |
| 41197.0 | 2485.12 |
| 41198.0 | 2547.9 |
| 41199.0 | 2569.83 |
| 41200.0 | 2574.19 |
| 41201.0 | 2542.24 |
| 41204.0 | 2531.1 |
| 41205.0 | 2477.92 |
| 41206.0 | 2490.58 |
| 41207.0 | 2483.43 |
| 41208.0 | 2496.1 |
| 41211.0 | 2478.83 |
| 41212.0 | 2515.99 |
| 41213.0 | 2503.64 |
| 41214.0 | 2533.87 |
| 41215.0 | 2547.15 |
| 41218.0 | 2517.67 |
| 41219.0 | 2535.94 |
| 41220.0 | 2479.1 |
| 41221.0 | 2479.13 |
| 41222.0 | 2479.82 |
| 41225.0 | 2473.52 |
| 41226.0 | 2493.14 |
| 41227.0 | 2472.84 |
| 41228.0 | 2461.77 |
| 41229.0 | 2427.32 |
| 41232.0 | 2495.21 |
| 41233.0 | 2509.62 |
| 41234.0 | 2519.68 |
| 41235.0 | 2535.09 |
| 41236.0 | 2557.03 |
| 41239.0 | 2542.52 |
| 41240.0 | 2543.45 |
| 41241.0 | 2546.84 |
| 41242.0 | 2581.69 |
| 41243.0 | 2575.25 |
| 41246.0 | 2582.36 |
| 41247.0 | 2590.83 |
| 41248.0 | 2592.09 |
| 41249.0 | 2603.41 |
| 41250.0 | 2601.37 |
| 41253.0 | 2596.02 |
| 41254.0 | 2624.03 |
| 41255.0 | 2630.34 |
| 41256.0 | 2627.66 |
| 41257.0 | 2630.54 |
| 41260.0 | 2628.01 |
| 41261.0 | 2643.5 |
| 41262.0 | 2654.69 |
| 41263.0 | 2658.3 |
| 41264.0 | 2651.09 |
| 41267.0 | 2648.53 |
| 41268.0 | 2648.53 |
| 41269.0 | 2648.53 |
| 41270.0 | 2659.95 |
| 41271.0 | 2626.85 |
| 41274.0 | 2635.93 |
| 41276.0 | 2711.25 |
| 41277.0 | 2701.22 |
| 41278.0 | 2709.35 |
| 41281.0 | 2695.56 |
| 41282.0 | 2691.45 |
| 41283.0 | 2706.39 |
| 41284.0 | 2708.27 |
| 41285.0 | 2717.79 |
| 41288.0 | 2715.16 |
| 41289.0 | 2701.59 |
| 41290.0 | 2702.54 |
| 41291.0 | 2718.93 |
| 41292.0 | 2709.59 |
| 41295.0 | 2726.63 |
| 41296.0 | 2716.7 |
| 41297.0 | 2708.28 |
| 41298.0 | 2722.96 |
| 41299.0 | 2744.18 |
| 41302.0 | 2744.5 |
| 41303.0 | 2749.27 |
| 41304.0 | 2732.12 |
| 41305.0 | 2702.98 |
| 41306.0 | 2710.08 |
| 41309.0 | 2625.17 |
| 41310.0 | 2651.21 |
| 41311.0 | 2617.35 |
| 41312.0 | 2597.92 |
| 41313.0 | 2630.3 |
| 41316.0 | 2622.61 |
| 41317.0 | 2648.83 |
| 41318.0 | 2656.86 |
| 41319.0 | 2635.35 |
| 41320.0 | 2615.26 |
| 41323.0 | 2616.65 |
| 41324.0 | 2662.37 |
| 41325.0 | 2640.35 |
| 41326.0 | 2579.76 |
| 41327.0 | 2630.05 |
| 41330.0 | 2651.86 |
| 41331.0 | 2570.52 |
| 41332.0 | 2611.89 |
| 41333.0 | 2633.55 |
| 41334.0 | 2616.75 |
| 41337.0 | 2619.78 |
| 41338.0 | 2683.02 |
| 41339.0 | 2679.89 |
| 41340.0 | 2690.85 |
| 41341.0 | 2728.78 |
| 41344.0 | 2718.71 |
| 41345.0 | 2711.85 |
| 41346.0 | 2704.73 |
| 41347.0 | 2744.7 |
| 41348.0 | 2725.72 |
| 41351.0 | 2705.47 |
| 41352.0 | 2671.96 |
| 41353.0 | 2708.9 |
| 41354.0 | 2683.92 |
| 41355.0 | 2681.67 |
| 41358.0 | 2649.28 |
| 41359.0 | 2641.12 |
| 41360.0 | 2612.46 |
| 41361.0 | 2624.02 |
| 41366.0 | 2679.8 |
| 41367.0 | 2639.01 |
| 41368.0 | 2621.43 |
| 41369.0 | 2585.28 |
| 41372.0 | 2589.25 |
| 41373.0 | 2595.13 |
| 41374.0 | 2661.62 |
| 41375.0 | 2674.33 |
| 41376.0 | 2633.47 |
| 41379.0 | 2624.71 |
| 41380.0 | 2609.3 |
| 41381.0 | 2553.49 |
| 41382.0 | 2555.5 |
| 41383.0 | 2575.16 |
| 41386.0 | 2583.62 |
| 41387.0 | 2662.88 |
| 41388.0 | 2702.05 |
| 41389.0 | 2704.41 |
| 41390.0 | 2683.43 |
| 41393.0 | 2717.38 |
| 41394.0 | 2712 |
| 41395.0 | 2711.74 |
| 41396.0 | 2718.9 |
| 41397.0 | 2763.68 |
| 41400.0 | 2750.52 |
| 41401.0 | 2769.08 |
| 41402.0 | 2784.62 |
| 41403.0 | 2773.16 |
| 41404.0 | 2785.24 |
| 41407.0 | 2777.39 |
| 41408.0 | 2795.63 |
| 41409.0 | 2809.58 |
| 41410.0 | 2806.7 |
| 41411.0 | 2817.99 |
| 41414.0 | 2824.5 |
| 41415.0 | 2821.65 |
| 41416.0 | 2835.01 |
| 41417.0 | 2776.78 |
| 41418.0 | 2764.29 |
| 41421.0 | 2795 |
| 41422.0 | 2835.87 |
| 41423.0 | 2786.54 |
| 41424.0 | 2799.2 |
| 41425.0 | 2769.64 |
| 41428.0 | 2747.74 |
| 41429.0 | 2755.7 |
| 41430.0 | 2709.33 |
| 41431.0 | 2676.21 |
| 41432.0 | 2724.08 |
| 41435.0 | 2719.4 |
| 41436.0 | 2683.2 |
| 41437.0 | 2666.52 |
| 41438.0 | 2661.71 |
| 41439.0 | 2667.32 |
| 41442.0 | 2702.69 |
| 41443.0 | 2700.93 |
| 41444.0 | 2683.98 |
| 41445.0 | 2586.45 |
| 41446.0 | 2549.48 |
| 41449.0 | 2511.83 |
| 41450.0 | 2543.37 |
| 41451.0 | 2602.81 |
| 41452.0 | 2619.86 |
| 41453.0 | 2602.59 |
| 41456.0 | 2622.62 |
| 41457.0 | 2603.2 |
| 41458.0 | 2570.76 |
| 41459.0 | 2646.54 |
| 41460.0 | 2596.01 |
| 41463.0 | 2650.85 |
| 41464.0 | 2664.14 |
| 41465.0 | 2659.71 |
| 41466.0 | 2681.32 |
| 41467.0 | 2674.87 |
| 41470.0 | 2686.69 |
| 41471.0 | 2665.61 |
| 41472.0 | 2681.88 |
| 41473.0 | 2717.99 |
| 41474.0 | 2716.17 |
| 41477.0 | 2725.4 |
| 41478.0 | 2722.9 |
| 41479.0 | 2752.25 |
| 41480.0 | 2740.29 |
| 41481.0 | 2741.96 |
| 41484.0 | 2741.73 |
| 41485.0 | 2759.21 |
| 41486.0 | 2768.15 |
| 41487.0 | 2808.64 |
| 41488.0 | 2811 |
| 41491.0 | 2809.08 |
| 41492.0 | 2790.78 |
| 41493.0 | 2794.44 |
| 41494.0 | 2816.88 |
| 41495.0 | 2825.62 |
| 41498.0 | 2827.15 |
| 41499.0 | 2841.61 |
| 41500.0 | 2852.08 |
| 41501.0 | 2835.86 |
| 41502.0 | 2854.27 |
| 41505.0 | 2823.35 |
| 41506.0 | 2787.98 |
| 41507.0 | 2774.58 |
| 41508.0 | 2812.32 |
| 41509.0 | 2826.05 |
| 41512.0 | 2821.45 |
| 41513.0 | 2749.27 |
| 41514.0 | 2742.61 |
| 41515.0 | 2758.31 |
| 41516.0 | 2721.37 |
| 41519.0 | 2774.09 |
| 41520.0 | 2753.35 |
| 41521.0 | 2758.29 |
| 41522.0 | 2774.2 |
| 41523.0 | 2803.42 |
| 41526.0 | 2798.31 |
| 41527.0 | 2851.4 |
| 41528.0 | 2863.44 |
| 41529.0 | 2862.07 |
| 41530.0 | 2867.11 |
| 41533.0 | 2894.64 |
| 41534.0 | 2890.95 |
| 41535.0 | 2908.92 |
| 41536.0 | 2936.2 |
| 41537.0 | 2927.19 |
| 41540.0 | 2906.35 |
| 41541.0 | 2922.93 |
| 41542.0 | 2927.35 |
| 41543.0 | 2922.99 |
| 41544.0 | 2919.34 |
| 41547.0 | 2893.15 |
| 41548.0 | 2933.02 |
| 41549.0 | 2918.31 |
| 41550.0 | 2902.12 |
| 41551.0 | 2928.31 |
| 41554.0 | 2923.04 |
| 41555.0 | 2903.35 |
| 41556.0 | 2904.73 |
| 41557.0 | 2969.41 |
| 41558.0 | 2974.28 |
| 41561.0 | 2977.69 |
| 41562.0 | 3004.56 |
| 41563.0 | 3015.4 |
| 41564.0 | 3010.39 |
| 41565.0 | 3033.31 |
| 41568.0 | 3028.65 |
| 41569.0 | 3045.77 |
| 41570.0 | 3017.16 |
| 41571.0 | 3038.96 |
| 41572.0 | 3034.5 |
| 41575.0 | 3022.04 |
| 41576.0 | 3050.64 |
| 41577.0 | 3040.69 |
| 41578.0 | 3067.95 |
| 41579.0 | 3052.14 |
| 41582.0 | 3061.18 |
| 41583.0 | 3035.92 |
| 41584.0 | 3056.4 |
| 41585.0 | 3042.98 |
| 41586.0 | 3034.91 |
| 41589.0 | 3052.83 |
| 41590.0 | 3034.68 |
| 41591.0 | 3021.17 |
| 41592.0 | 3053.69 |
| 41593.0 | 3054.53 |
| 41596.0 | 3081.3 |
| 41597.0 | 3049.17 |
| 41598.0 | 3047.32 |
| 41599.0 | 3044.34 |
| 41600.0 | 3055.98 |
| 41603.0 | 3072.75 |
| 41604.0 | 3062.62 |
| 41605.0 | 3082.65 |
| 41606.0 | 3092.42 |
| 41607.0 | 3086.64 |
| 41610.0 | 3077.23 |
| 41611.0 | 3013.88 |
| 41612.0 | 2991.76 |
| 41613.0 | 2953.17 |
| 41614.0 | 2979.94 |
| 41617.0 | 2988.67 |
| 41618.0 | 2960.86 |
| 41619.0 | 2947.31 |
| 41620.0 | 2928.12 |
| 41621.0 | 2921.92 |
| 41624.0 | 2978.77 |
| 41625.0 | 2941.76 |
| 41626.0 | 2975.09 |
| 41627.0 | 3031.05 |
| 41628.0 | 3049.35 |
| 41631.0 | 3070.91 |
| 41632.0 | 3072.88 |
| 41635.0 | 3111.37 |
| 41638.0 | 3100.93 |
| 41639.0 | 3109 |
| 41641.0 | 3059.93 |
| 41642.0 | 3074.43 |
| 41645.0 | 3069.16 |
| 41646.0 | 3110.96 |
| 41647.0 | 3110.66 |
| 41648.0 | 3090.26 |
| 41649.0 | 3104.15 |
| 41652.0 | 3111.94 |
| 41653.0 | 3119.53 |
| 41654.0 | 3168.76 |
| 41655.0 | 3150.2 |
| 41656.0 | 3154.1 |
| 41659.0 | 3153.17 |
| 41660.0 | 3153.08 |
| 41661.0 | 3151.27 |
| 41662.0 | 3117.08 |
| 41663.0 | 3028.2 |
| 41666.0 | 3014.62 |
| 41667.0 | 3038.6 |
| 41668.0 | 3011.45 |
| 41669.0 | 3027.3 |
| 41670.0 | 3013.96 |
| 41673.0 | 2963.96 |
| 41674.0 | 2962.49 |
| 41675.0 | 2962.51 |
| 41676.0 | 3010.79 |
| 41677.0 | 3038.49 |
| 41680.0 | 3032.53 |
| 41681.0 | 3077.08 |
| 41682.0 | 3094.89 |
| 41683.0 | 3097.95 |
| 41684.0 | 3119.06 |
| 41687.0 | 3118.91 |
| 41688.0 | 3117.44 |
| 41689.0 | 3120.8 |
| 41690.0 | 3121.59 |
| 41691.0 | 3131.67 |
| 41694.0 | 3157.31 |
| 41695.0 | 3157.48 |
| 41696.0 | 3148.19 |
| 41697.0 | 3134.94 |
| 41698.0 | 3149.23 |
| 41701.0 | 3053.99 |
| 41702.0 | 3136.33 |
| 41703.0 | 3135.97 |
| 41704.0 | 3144.53 |
| 41705.0 | 3095.31 |
| 41708.0 | 3092.79 |
| 41709.0 | 3092.55 |
| 41710.0 | 3065.46 |
| 41711.0 | 3019.54 |
| 41712.0 | 3004.64 |
| 41715.0 | 3049.19 |
| 41716.0 | 3073.75 |
| 41717.0 | 3076.36 |
| 41718.0 | 3088.9 |
| 41719.0 | 3096.49 |
| 41722.0 | 3052.91 |
| 41723.0 | 3096.64 |
| 41724.0 | 3130.17 |
| 41725.0 | 3133.75 |
| 41726.0 | 3172.43 |
| 41729.0 | 3161.6 |
| 41730.0 | 3186.34 |
| 41731.0 | 3187.45 |
| 41732.0 | 3206.76 |
| 41733.0 | 3230.33 |
| 41736.0 | 3185.97 |
| 41737.0 | 3177.66 |
| 41738.0 | 3182.79 |
| 41739.0 | 3152.86 |
| 41740.0 | 3116.54 |
| 41743.0 | 3131.57 |
| 41744.0 | 3091.52 |
| 41745.0 | 3139.26 |
| 41746.0 | 3155.81 |
| 41751.0 | 3199.69 |
| 41752.0 | 3175.97 |
| 41753.0 | 3189.81 |
| 41754.0 | 3147.4 |
| 41757.0 | 3165.84 |
| 41758.0 | 3208.68 |
| 41759.0 | 3198.39 |
| 41760.0 | 3198.66 |
| 41761.0 | 3177.89 |
| 41764.0 | 3171.29 |
| 41765.0 | 3149.79 |
| 41766.0 | 3159.67 |
| 41767.0 | 3204.3 |
| 41768.0 | 3184.09 |
| 41771.0 | 3206.97 |
| 41772.0 | 3211.78 |
| 41773.0 | 3210.42 |
| 41774.0 | 3163.22 |
| 41775.0 | 3172.72 |
| 41778.0 | 3169.9 |
| 41779.0 | 3163.93 |
| 41780.0 | 3187.08 |
| 41781.0 | 3187.63 |
| 41782.0 | 3203.28 |
| 41785.0 | 3240.39 |
| 41786.0 | 3244.28 |
| 41787.0 | 3246.24 |
| 41788.0 | 3244.66 |
| 41789.0 | 3244.6 |
| 41792.0 | 3247.8 |
| 41793.0 | 3241.04 |
| 41794.0 | 3237.93 |
| 41795.0 | 3267.05 |
| 41796.0 | 3294.28 |
| 41799.0 | 3305.26 |
| 41800.0 | 3313.8 |
| 41801.0 | 3289.09 |
| 41802.0 | 3284.28 |
| 41803.0 | 3282.84 |
| 41806.0 | 3261.42 |
| 41807.0 | 3275.33 |
| 41808.0 | 3279.2 |
| 41809.0 | 3314.8 |
| 41810.0 | 3302.36 |
| 41813.0 | 3282.58 |
| 41814.0 | 3284.81 |
| 41815.0 | 3252.31 |
| 41816.0 | 3233.19 |
| 41817.0 | 3227.85 |
| 41820.0 | 3228.24 |
| 41821.0 | 3258.71 |
| 41822.0 | 3252.25 |
| 41823.0 | 3289.75 |
| 41824.0 | 3270.47 |
| 41827.0 | 3230.92 |
| 41828.0 | 3184.38 |
| 41829.0 | 3203.1 |
| 41830.0 | 3150.59 |
| 41831.0 | 3157.05 |
| 41834.0 | 3185.86 |
| 41835.0 | 3153.75 |
| 41836.0 | 3202.94 |
| 41837.0 | 3157.82 |
| 41838.0 | 3164.21 |
| 41841.0 | 3137.06 |
| 41842.0 | 3189.22 |
| 41843.0 | 3193.13 |
| 41844.0 | 3220.07 |
| 41845.0 | 3174.99 |
| 41848.0 | 3171.55 |
| 41849.0 | 3190.54 |
| 41850.0 | 3169.23 |
| 41851.0 | 3115.51 |
| 41852.0 | 3072.57 |
| 41855.0 | 3070.46 |
| 41856.0 | 3072.2 |
| 41857.0 | 3050.37 |
| 41858.0 | 3012.88 |
| 41859.0 | 3006.83 |
| 41862.0 | 3047.56 |
| 41863.0 | 3023.77 |
| 41864.0 | 3056.17 |
| 41865.0 | 3058.16 |
| 41866.0 | 3033.52 |
| 41869.0 | 3073.45 |
| 41870.0 | 3091.11 |
| 41871.0 | 3083.5 |
| 41872.0 | 3124.56 |
| 41873.0 | 3098.5 |
| 41876.0 | 3165.47 |
| 41877.0 | 3197.54 |
| 41878.0 | 3194.45 |
| 41879.0 | 3164.44 |
| 41880.0 | 3172.63 |
| 41883.0 | 3175.05 |
| 41884.0 | 3180.29 |
| 41885.0 | 3218.84 |
| 41886.0 | 3277.25 |
| 41887.0 | 3275.25 |
| 41890.0 | 3267.54 |
| 41891.0 | 3245.43 |
| 41892.0 | 3244.16 |
| 41893.0 | 3237.76 |
| 41894.0 | 3235.07 |
| 41897.0 | 3231.7 |
| 41898.0 | 3221.73 |
| 41899.0 | 3237.44 |
| 41900.0 | 3271.37 |
| 41901.0 | 3273.25 |
| 41904.0 | 3257.48 |
| 41905.0 | 3205.93 |
| 41906.0 | 3244.01 |
| 41907.0 | 3202.31 |
| 41908.0 | 3219.58 |
| 41911.0 | 3186.95 |
| 41912.0 | 3225.93 |
| 41913.0 | 3195.08 |
| 41914.0 | 3106.42 |
| 41915.0 | 3133.37 |
| 41918.0 | 3138.67 |
| 41919.0 | 3082.1 |
| 41920.0 | 3053.31 |
| 41921.0 | 3042.45 |
| 41922.0 | 2991.5 |
| 41925.0 | 2998.32 |
| 41926.0 | 3000.99 |
| 41927.0 | 2892.55 |
| 41928.0 | 2874.65 |
| 41929.0 | 2962.24 |
| 41932.0 | 2927.3 |
| 41933.0 | 2991.46 |
| 41934.0 | 3008.53 |
| 41935.0 | 3044.3 |
| 41936.0 | 3030.37 |
| 41939.0 | 2998.84 |
| 41940.0 | 3036.15 |
| 41941.0 | 3022.42 |
| 41942.0 | 3035.9 |
| 41943.0 | 3113.32 |
| 41946.0 | 3082.32 |
| 41947.0 | 3034.24 |
| 41948.0 | 3091.54 |
| 41949.0 | 3102.07 |
| 41950.0 | 3064.92 |
| 41953.0 | 3094.6 |
| 41954.0 | 3104.59 |
| 41955.0 | 3047.3 |
| 41956.0 | 3056.8 |
| 41957.0 | 3059.99 |
| 41960.0 | 3084.79 |
| 41961.0 | 3120.42 |
| 41962.0 | 3123.12 |
| 41963.0 | 3102.21 |
| 41964.0 | 3194.22 |
| 41967.0 | 3211.7 |
| 41968.0 | 3226.15 |
| 41969.0 | 3226.08 |
| 41970.0 | 3244.92 |
| 41971.0 | 3250.93 |
| 41974.0 | 3232.91 |
| 41975.0 | 3238.35 |
| 41976.0 | 3247.72 |
| 41977.0 | 3191.25 |
| 41978.0 | 3277.38 |
| 41981.0 | 3247.99 |
| 41982.0 | 3162.77 |
| 41983.0 | 3150.95 |
| 41984.0 | 3159.11 |
| 41985.0 | 3067.32 |
| 41988.0 | 2982.9 |
| 41989.0 | 3049.99 |
| 41990.0 | 3051.99 |
| 41991.0 | 3153.77 |
| 41992.0 | 3141.28 |
| 41995.0 | 3154.91 |
| 41996.0 | 3192.47 |
| 41997.0 | 3184.66 |
| 42002.0 | 3185.17 |
| 42003.0 | 3135.95 |
| 42004.0 | 3146.43 |
| 42006.0 | 3139.44 |
| 42009.0 | 3023.14 |
| 42010.0 | 3007.91 |
| 42011.0 | 3026.79 |
| 42012.0 | 3135.08 |
| 42013.0 | 3042.9 |
| 42016.0 | 3084.18 |
| 42017.0 | 3133.86 |
| 42018.0 | 3089.67 |
| 42019.0 | 3157.36 |
| 42020.0 | 3202.24 |
| 42023.0 | 3220.9 |
| 42024.0 | 3244.92 |
| 42025.0 | 3269.73 |
| 42026.0 | 3322.65 |
| 42027.0 | 3382.55 |
| 42030.0 | 3414.28 |
| 42031.0 | 3372.58 |
| 42032.0 | 3358.96 |
| 42033.0 | 3371.83 |
| 42034.0 | 3351.44 |
| 42037.0 | 3370.11 |
| 42038.0 | 3414.18 |
| 42039.0 | 3415.53 |
| 42040.0 | 3408.96 |
| 42041.0 | 3398.16 |
| 42044.0 | 3347.75 |
| 42045.0 | 3383.13 |
| 42046.0 | 3374.14 |
| 42047.0 | 3417.61 |
| 42048.0 | 3447.59 |
| 42051.0 | 3433.3 |
| 42052.0 | 3438.44 |
| 42053.0 | 3465.8 |
| 42054.0 | 3488.08 |
| 42055.0 | 3490.53 |
| 42058.0 | 3519.58 |
| 42059.0 | 3547.1 |
| 42060.0 | 3541.78 |
| 42061.0 | 3574.94 |
| 42062.0 | 3599 |
| 42065.0 | 3591.09 |
| 42066.0 | 3549.11 |
| 42067.0 | 3583.44 |
| 42068.0 | 3618.21 |
| 42069.0 | 3617.62 |
| 42072.0 | 3610.28 |
| 42073.0 | 3567.25 |
| 42074.0 | 3649.54 |
| 42075.0 | 3641.32 |
| 42076.0 | 3656.21 |
| 42079.0 | 3706.75 |
| 42080.0 | 3672.16 |
| 42081.0 | 3668.52 |
| 42082.0 | 3670.73 |
| 42083.0 | 3726.07 |
| 42086.0 | 3699.04 |
| 42087.0 | 3731.35 |
| 42088.0 | 3684.04 |
| 42089.0 | 3669.79 |
| 42090.0 | 3679.03 |
| 42093.0 | 3727.8 |
| 42094.0 | 3697.38 |
| 42095.0 | 3714.89 |
| 42096.0 | 3715.27 |
| 42101.0 | 3768.72 |
| 42102.0 | 3742.63 |
| 42103.0 | 3781.79 |
| 42104.0 | 3816.76 |
| 42107.0 | 3828.78 |
| 42108.0 | 3784.53 |
| 42109.0 | 3803.55 |
| 42110.0 | 3751.72 |
| 42111.0 | 3674.05 |
| 42114.0 | 3718.04 |
| 42115.0 | 3719.38 |
| 42116.0 | 3724.49 |
| 42117.0 | 3697.88 |
| 42118.0 | 3713.96 |
| 42121.0 | 3771.45 |
| 42122.0 | 3715.42 |
| 42123.0 | 3617.11 |
| 42124.0 | 3615.59 |
| 42125.0 | 3615.59 |
| 42128.0 | 3632.94 |
| 42129.0 | 3546.56 |
| 42130.0 | 3558.03 |
| 42131.0 | 3556.21 |
| 42132.0 | 3649.48 |
| 42135.0 | 3624.41 |
| 42136.0 | 3573.1 |
| 42137.0 | 3553.42 |
| 42138.0 | 3602.22 |
| 42139.0 | 3573.07 |
| 42142.0 | 3589.22 |
| 42143.0 | 3670.52 |
| 42144.0 | 3683.48 |
| 42145.0 | 3688.72 |
| 42146.0 | 3679.14 |
| 42149.0 | 3655.41 |
| 42150.0 | 3619.3 |
| 42151.0 | 3682.87 |
| 42152.0 | 3650.71 |
| 42153.0 | 3570.78 |
| 42156.0 | 3575.04 |
| 42157.0 | 3561.89 |
| 42158.0 | 3583.82 |
| 42159.0 | 3556.38 |
| 42160.0 | 3510.01 |
| 42163.0 | 3468.31 |
| 42164.0 | 3456.79 |
| 42165.0 | 3526.48 |
| 42166.0 | 3551.91 |
| 42167.0 | 3502.77 |
| 42170.0 | 3438.07 |
| 42171.0 | 3454.09 |
| 42172.0 | 3428.76 |
| 42173.0 | 3450.45 |
| 42174.0 | 3455.8 |
| 42177.0 | 3596.07 |
| 42178.0 | 3625.97 |
| 42179.0 | 3610.95 |
| 42180.0 | 3610.91 |
| 42181.0 | 3621.37 |
| 42184.0 | 3468.9 |
| 42185.0 | 3424.3 |
| 42186.0 | 3496.28 |
| 42187.0 | 3463.25 |
| 42188.0 | 3441.76 |
| 42191.0 | 3365.2 |
| 42192.0 | 3294.19 |
| 42193.0 | 3327.5 |
| 42194.0 | 3420.03 |
| 42195.0 | 3528.81 |
| 42198.0 | 3590.43 |
| 42199.0 | 3607.19 |
| 42200.0 | 3623.87 |
| 42201.0 | 3676.41 |
| 42202.0 | 3670.34 |
| 42205.0 | 3686.58 |
| 42206.0 | 3647.96 |
| 42207.0 | 3635.58 |
| 42208.0 | 3634.64 |
| 42209.0 | 3600 |
| 42212.0 | 3513.1 |
| 42213.0 | 3554.11 |
| 42214.0 | 3575.53 |
| 42215.0 | 3583.79 |
| 42216.0 | 3600.69 |
| 42219.0 | 3635.4 |
| 42220.0 | 3619.31 |
| 42221.0 | 3676.75 |
| 42222.0 | 3668.47 |
| 42223.0 | 3637.8 |
| 42226.0 | 3674.94 |
| 42227.0 | 3605.28 |
| 42228.0 | 3484.41 |
| 42229.0 | 3516.15 |
| 42230.0 | 3491.03 |
| 42233.0 | 3497.9 |
| 42234.0 | 3495.38 |
| 42235.0 | 3429.84 |
| 42236.0 | 3353.48 |
| 42237.0 | 3247.26 |
| 42240.0 | 3073.39 |
| 42241.0 | 3218.01 |
| 42242.0 | 3170.73 |
| 42243.0 | 3280.78 |
| 42244.0 | 3286.59 |
| 42247.0 | 3269.63 |
| 42248.0 | 3188.73 |
| 42249.0 | 3198.86 |
| 42250.0 | 3270.09 |
| 42251.0 | 3180.25 |
| 42254.0 | 3197.97 |
| 42256.0 | 3269.98 |
| 42257.0 | 3221.14 |
| 42258.0 | 3187.94 |
| 42261.0 | 3175.62 |
| 42268.0 | 3184.72 |
| 42269.0 | 3076.05 |
| 42270.0 | 3079.99 |
| 42271.0 | 3019.34 |
| 42272.0 | 3113.16 |
| 42275.0 | 3039.44 |
| 42276.0 | 3029.86 |
| 42277.0 | 3100.67 |
| 42282.0 | 3190.39 |
| 42285.0 | 3224.96 |
| 42286.0 | 3250.31 |